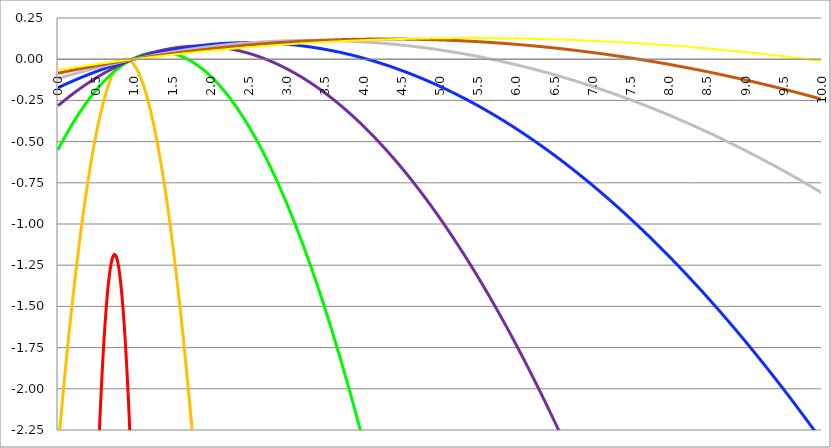
| Category | Series 1 | Series 0 | Series 3 | Series 4 | Series 5 | Series 2 | Series 6 | Series 7 |
|---|---|---|---|---|---|---|---|---|
| 0.0 | -16 | -2.37 | -0.549 | -0.282 | -0.173 | -0.117 | -0.085 | -0.064 |
| 0.005 | -15.801 | -2.344 | -0.544 | -0.28 | -0.172 | -0.117 | -0.085 | -0.064 |
| 0.01 | -15.603 | -2.317 | -0.54 | -0.278 | -0.171 | -0.116 | -0.084 | -0.064 |
| 0.015 | -15.406 | -2.291 | -0.535 | -0.276 | -0.17 | -0.115 | -0.084 | -0.063 |
| 0.02 | -15.211 | -2.265 | -0.531 | -0.274 | -0.169 | -0.115 | -0.083 | -0.063 |
| 0.025 | -15.017 | -2.239 | -0.527 | -0.273 | -0.168 | -0.114 | -0.083 | -0.063 |
| 0.03 | -14.824 | -2.213 | -0.522 | -0.271 | -0.167 | -0.113 | -0.082 | -0.062 |
| 0.035 | -14.633 | -2.187 | -0.518 | -0.269 | -0.165 | -0.113 | -0.082 | -0.062 |
| 0.04 | -14.443 | -2.162 | -0.514 | -0.267 | -0.164 | -0.112 | -0.081 | -0.062 |
| 0.045 | -14.255 | -2.136 | -0.509 | -0.265 | -0.163 | -0.111 | -0.081 | -0.061 |
| 0.05 | -14.068 | -2.111 | -0.505 | -0.263 | -0.162 | -0.11 | -0.08 | -0.061 |
| 0.055 | -13.882 | -2.086 | -0.501 | -0.261 | -0.161 | -0.11 | -0.08 | -0.061 |
| 0.06 | -13.697 | -2.061 | -0.497 | -0.259 | -0.16 | -0.109 | -0.079 | -0.06 |
| 0.065 | -13.514 | -2.036 | -0.492 | -0.257 | -0.159 | -0.108 | -0.079 | -0.06 |
| 0.07 | -13.332 | -2.012 | -0.488 | -0.255 | -0.158 | -0.108 | -0.078 | -0.06 |
| 0.075 | -13.152 | -1.987 | -0.484 | -0.254 | -0.157 | -0.107 | -0.078 | -0.059 |
| 0.08 | -12.973 | -1.963 | -0.48 | -0.252 | -0.156 | -0.106 | -0.077 | -0.059 |
| 0.085 | -12.795 | -1.939 | -0.476 | -0.25 | -0.155 | -0.106 | -0.077 | -0.058 |
| 0.09 | -12.619 | -1.915 | -0.471 | -0.248 | -0.154 | -0.105 | -0.076 | -0.058 |
| 0.095 | -12.444 | -1.891 | -0.467 | -0.246 | -0.153 | -0.104 | -0.076 | -0.058 |
| 0.1 | -12.27 | -1.867 | -0.463 | -0.244 | -0.152 | -0.104 | -0.075 | -0.057 |
| 0.105 | -12.098 | -1.843 | -0.459 | -0.242 | -0.151 | -0.103 | -0.075 | -0.057 |
| 0.11 | -11.927 | -1.82 | -0.455 | -0.241 | -0.15 | -0.102 | -0.075 | -0.057 |
| 0.115 | -11.757 | -1.797 | -0.451 | -0.239 | -0.149 | -0.102 | -0.074 | -0.056 |
| 0.12 | -11.589 | -1.774 | -0.447 | -0.237 | -0.148 | -0.101 | -0.074 | -0.056 |
| 0.125 | -11.422 | -1.751 | -0.443 | -0.235 | -0.147 | -0.1 | -0.073 | -0.056 |
| 0.13 | -11.256 | -1.728 | -0.439 | -0.233 | -0.145 | -0.1 | -0.073 | -0.055 |
| 0.135 | -11.092 | -1.705 | -0.435 | -0.231 | -0.144 | -0.099 | -0.072 | -0.055 |
| 0.14 | -10.929 | -1.683 | -0.431 | -0.23 | -0.143 | -0.098 | -0.072 | -0.055 |
| 0.145 | -10.768 | -1.66 | -0.427 | -0.228 | -0.142 | -0.098 | -0.071 | -0.054 |
| 0.15 | -10.608 | -1.638 | -0.423 | -0.226 | -0.141 | -0.097 | -0.071 | -0.054 |
| 0.155 | -10.449 | -1.616 | -0.419 | -0.224 | -0.14 | -0.096 | -0.07 | -0.054 |
| 0.16 | -10.291 | -1.594 | -0.415 | -0.222 | -0.139 | -0.096 | -0.07 | -0.053 |
| 0.165 | -10.135 | -1.572 | -0.411 | -0.221 | -0.138 | -0.095 | -0.069 | -0.053 |
| 0.17 | -9.98 | -1.55 | -0.407 | -0.219 | -0.137 | -0.094 | -0.069 | -0.053 |
| 0.175 | -9.827 | -1.529 | -0.403 | -0.217 | -0.136 | -0.094 | -0.068 | -0.052 |
| 0.18 | -9.675 | -1.508 | -0.399 | -0.215 | -0.135 | -0.093 | -0.068 | -0.052 |
| 0.185 | -9.524 | -1.486 | -0.396 | -0.214 | -0.134 | -0.092 | -0.068 | -0.052 |
| 0.19 | -9.375 | -1.465 | -0.392 | -0.212 | -0.133 | -0.092 | -0.067 | -0.051 |
| 0.195 | -9.227 | -1.444 | -0.388 | -0.21 | -0.132 | -0.091 | -0.067 | -0.051 |
| 0.2 | -9.08 | -1.424 | -0.384 | -0.208 | -0.131 | -0.09 | -0.066 | -0.05 |
| 0.205 | -8.935 | -1.403 | -0.38 | -0.207 | -0.13 | -0.09 | -0.066 | -0.05 |
| 0.21 | -8.791 | -1.383 | -0.377 | -0.205 | -0.129 | -0.089 | -0.065 | -0.05 |
| 0.215 | -8.648 | -1.362 | -0.373 | -0.203 | -0.128 | -0.088 | -0.065 | -0.049 |
| 0.22 | -8.507 | -1.342 | -0.369 | -0.201 | -0.127 | -0.088 | -0.064 | -0.049 |
| 0.225 | -8.367 | -1.322 | -0.366 | -0.2 | -0.126 | -0.087 | -0.064 | -0.049 |
| 0.23 | -8.228 | -1.302 | -0.362 | -0.198 | -0.125 | -0.087 | -0.063 | -0.048 |
| 0.235 | -8.091 | -1.283 | -0.358 | -0.196 | -0.124 | -0.086 | -0.063 | -0.048 |
| 0.24 | -7.955 | -1.263 | -0.355 | -0.195 | -0.123 | -0.085 | -0.062 | -0.048 |
| 0.245 | -7.821 | -1.244 | -0.351 | -0.193 | -0.122 | -0.085 | -0.062 | -0.047 |
| 0.25 | -7.687 | -1.225 | -0.347 | -0.191 | -0.121 | -0.084 | -0.062 | -0.047 |
| 0.255 | -7.556 | -1.205 | -0.344 | -0.189 | -0.12 | -0.083 | -0.061 | -0.047 |
| 0.26 | -7.425 | -1.187 | -0.34 | -0.188 | -0.119 | -0.083 | -0.061 | -0.046 |
| 0.265 | -7.296 | -1.168 | -0.337 | -0.186 | -0.118 | -0.082 | -0.06 | -0.046 |
| 0.27 | -7.168 | -1.149 | -0.333 | -0.184 | -0.117 | -0.081 | -0.06 | -0.046 |
| 0.275 | -7.042 | -1.131 | -0.329 | -0.183 | -0.116 | -0.081 | -0.059 | -0.045 |
| 0.28 | -6.917 | -1.112 | -0.326 | -0.181 | -0.116 | -0.08 | -0.059 | -0.045 |
| 0.285 | -6.793 | -1.094 | -0.322 | -0.179 | -0.115 | -0.079 | -0.058 | -0.045 |
| 0.29 | -6.671 | -1.076 | -0.319 | -0.178 | -0.114 | -0.079 | -0.058 | -0.044 |
| 0.295 | -6.55 | -1.058 | -0.315 | -0.176 | -0.113 | -0.078 | -0.057 | -0.044 |
| 0.3 | -6.43 | -1.04 | -0.312 | -0.175 | -0.112 | -0.078 | -0.057 | -0.044 |
| 0.305 | -6.312 | -1.023 | -0.309 | -0.173 | -0.111 | -0.077 | -0.057 | -0.043 |
| 0.31 | -6.195 | -1.005 | -0.305 | -0.171 | -0.11 | -0.076 | -0.056 | -0.043 |
| 0.315 | -6.079 | -0.988 | -0.302 | -0.17 | -0.109 | -0.076 | -0.056 | -0.043 |
| 0.32 | -5.965 | -0.971 | -0.298 | -0.168 | -0.108 | -0.075 | -0.055 | -0.042 |
| 0.325 | -5.852 | -0.954 | -0.295 | -0.166 | -0.107 | -0.074 | -0.055 | -0.042 |
| 0.33 | -5.74 | -0.937 | -0.292 | -0.165 | -0.106 | -0.074 | -0.054 | -0.042 |
| 0.335 | -5.63 | -0.92 | -0.288 | -0.163 | -0.105 | -0.073 | -0.054 | -0.041 |
| 0.34 | -5.521 | -0.904 | -0.285 | -0.162 | -0.104 | -0.073 | -0.053 | -0.041 |
| 0.345 | -5.414 | -0.887 | -0.282 | -0.16 | -0.103 | -0.072 | -0.053 | -0.041 |
| 0.35 | -5.307 | -0.871 | -0.278 | -0.158 | -0.102 | -0.071 | -0.053 | -0.04 |
| 0.355 | -5.203 | -0.855 | -0.275 | -0.157 | -0.101 | -0.071 | -0.052 | -0.04 |
| 0.36 | -5.099 | -0.839 | -0.272 | -0.155 | -0.1 | -0.07 | -0.052 | -0.04 |
| 0.365 | -4.997 | -0.823 | -0.269 | -0.154 | -0.099 | -0.069 | -0.051 | -0.039 |
| 0.37 | -4.896 | -0.808 | -0.265 | -0.152 | -0.098 | -0.069 | -0.051 | -0.039 |
| 0.375 | -4.797 | -0.792 | -0.262 | -0.151 | -0.098 | -0.068 | -0.05 | -0.039 |
| 0.38 | -4.699 | -0.777 | -0.259 | -0.149 | -0.097 | -0.068 | -0.05 | -0.038 |
| 0.385 | -4.602 | -0.762 | -0.256 | -0.147 | -0.096 | -0.067 | -0.049 | -0.038 |
| 0.39 | -4.507 | -0.747 | -0.253 | -0.146 | -0.095 | -0.066 | -0.049 | -0.038 |
| 0.395 | -4.413 | -0.732 | -0.25 | -0.144 | -0.094 | -0.066 | -0.049 | -0.037 |
| 0.4 | -4.32 | -0.717 | -0.246 | -0.143 | -0.093 | -0.065 | -0.048 | -0.037 |
| 0.405 | -4.229 | -0.702 | -0.243 | -0.141 | -0.092 | -0.065 | -0.048 | -0.037 |
| 0.41 | -4.139 | -0.688 | -0.24 | -0.14 | -0.091 | -0.064 | -0.047 | -0.036 |
| 0.415 | -4.05 | -0.674 | -0.237 | -0.138 | -0.09 | -0.063 | -0.047 | -0.036 |
| 0.42 | -3.963 | -0.66 | -0.234 | -0.137 | -0.089 | -0.063 | -0.046 | -0.036 |
| 0.425 | -3.877 | -0.646 | -0.231 | -0.135 | -0.088 | -0.062 | -0.046 | -0.035 |
| 0.43 | -3.792 | -0.632 | -0.228 | -0.134 | -0.087 | -0.061 | -0.046 | -0.035 |
| 0.435 | -3.709 | -0.618 | -0.225 | -0.132 | -0.087 | -0.061 | -0.045 | -0.035 |
| 0.44 | -3.627 | -0.605 | -0.222 | -0.131 | -0.086 | -0.06 | -0.045 | -0.034 |
| 0.445 | -3.547 | -0.591 | -0.219 | -0.129 | -0.085 | -0.06 | -0.044 | -0.034 |
| 0.45 | -3.467 | -0.578 | -0.216 | -0.128 | -0.084 | -0.059 | -0.044 | -0.034 |
| 0.455 | -3.39 | -0.565 | -0.213 | -0.126 | -0.083 | -0.058 | -0.043 | -0.033 |
| 0.46 | -3.313 | -0.552 | -0.21 | -0.125 | -0.082 | -0.058 | -0.043 | -0.033 |
| 0.465 | -3.238 | -0.539 | -0.207 | -0.123 | -0.081 | -0.057 | -0.042 | -0.033 |
| 0.47 | -3.164 | -0.526 | -0.205 | -0.122 | -0.08 | -0.057 | -0.042 | -0.032 |
| 0.475 | -3.092 | -0.514 | -0.202 | -0.12 | -0.079 | -0.056 | -0.042 | -0.032 |
| 0.48 | -3.021 | -0.502 | -0.199 | -0.119 | -0.079 | -0.056 | -0.041 | -0.032 |
| 0.485 | -2.951 | -0.489 | -0.196 | -0.118 | -0.078 | -0.055 | -0.041 | -0.031 |
| 0.49 | -2.883 | -0.477 | -0.193 | -0.116 | -0.077 | -0.054 | -0.04 | -0.031 |
| 0.495 | -2.816 | -0.465 | -0.19 | -0.115 | -0.076 | -0.054 | -0.04 | -0.031 |
| 0.5 | -2.75 | -0.454 | -0.188 | -0.113 | -0.075 | -0.053 | -0.039 | -0.03 |
| 0.505 | -2.686 | -0.442 | -0.185 | -0.112 | -0.074 | -0.053 | -0.039 | -0.03 |
| 0.51 | -2.623 | -0.431 | -0.182 | -0.11 | -0.073 | -0.052 | -0.039 | -0.03 |
| 0.515 | -2.561 | -0.419 | -0.179 | -0.109 | -0.072 | -0.051 | -0.038 | -0.03 |
| 0.52 | -2.501 | -0.408 | -0.177 | -0.108 | -0.072 | -0.051 | -0.038 | -0.029 |
| 0.525 | -2.442 | -0.397 | -0.174 | -0.106 | -0.071 | -0.05 | -0.037 | -0.029 |
| 0.53 | -2.384 | -0.386 | -0.171 | -0.105 | -0.07 | -0.05 | -0.037 | -0.029 |
| 0.535 | -2.328 | -0.376 | -0.169 | -0.103 | -0.069 | -0.049 | -0.037 | -0.028 |
| 0.54 | -2.273 | -0.365 | -0.166 | -0.102 | -0.068 | -0.048 | -0.036 | -0.028 |
| 0.545 | -2.22 | -0.355 | -0.163 | -0.101 | -0.067 | -0.048 | -0.036 | -0.028 |
| 0.55 | -2.167 | -0.345 | -0.161 | -0.099 | -0.066 | -0.047 | -0.035 | -0.027 |
| 0.555 | -2.117 | -0.334 | -0.158 | -0.098 | -0.066 | -0.047 | -0.035 | -0.027 |
| 0.56 | -2.067 | -0.325 | -0.155 | -0.097 | -0.065 | -0.046 | -0.034 | -0.027 |
| 0.565 | -2.019 | -0.315 | -0.153 | -0.095 | -0.064 | -0.046 | -0.034 | -0.026 |
| 0.57 | -1.972 | -0.305 | -0.15 | -0.094 | -0.063 | -0.045 | -0.034 | -0.026 |
| 0.575 | -1.927 | -0.296 | -0.148 | -0.092 | -0.062 | -0.044 | -0.033 | -0.026 |
| 0.58 | -1.883 | -0.286 | -0.145 | -0.091 | -0.061 | -0.044 | -0.033 | -0.025 |
| 0.585 | -1.84 | -0.277 | -0.143 | -0.09 | -0.061 | -0.043 | -0.032 | -0.025 |
| 0.59 | -1.799 | -0.268 | -0.14 | -0.088 | -0.06 | -0.043 | -0.032 | -0.025 |
| 0.595 | -1.759 | -0.259 | -0.138 | -0.087 | -0.059 | -0.042 | -0.031 | -0.024 |
| 0.6 | -1.72 | -0.25 | -0.135 | -0.086 | -0.058 | -0.042 | -0.031 | -0.024 |
| 0.605 | -1.683 | -0.242 | -0.133 | -0.085 | -0.057 | -0.041 | -0.031 | -0.024 |
| 0.61 | -1.647 | -0.233 | -0.131 | -0.083 | -0.056 | -0.04 | -0.03 | -0.023 |
| 0.615 | -1.612 | -0.225 | -0.128 | -0.082 | -0.056 | -0.04 | -0.03 | -0.023 |
| 0.62 | -1.579 | -0.217 | -0.126 | -0.081 | -0.055 | -0.039 | -0.029 | -0.023 |
| 0.625 | -1.547 | -0.209 | -0.123 | -0.079 | -0.054 | -0.039 | -0.029 | -0.022 |
| 0.63 | -1.516 | -0.201 | -0.121 | -0.078 | -0.053 | -0.038 | -0.029 | -0.022 |
| 0.635 | -1.487 | -0.193 | -0.119 | -0.077 | -0.052 | -0.038 | -0.028 | -0.022 |
| 0.64 | -1.459 | -0.186 | -0.116 | -0.075 | -0.051 | -0.037 | -0.028 | -0.022 |
| 0.645 | -1.433 | -0.178 | -0.114 | -0.074 | -0.051 | -0.036 | -0.027 | -0.021 |
| 0.65 | -1.407 | -0.171 | -0.112 | -0.073 | -0.05 | -0.036 | -0.027 | -0.021 |
| 0.655 | -1.384 | -0.164 | -0.109 | -0.072 | -0.049 | -0.035 | -0.027 | -0.021 |
| 0.66 | -1.361 | -0.157 | -0.107 | -0.07 | -0.048 | -0.035 | -0.026 | -0.02 |
| 0.665 | -1.34 | -0.15 | -0.105 | -0.069 | -0.047 | -0.034 | -0.026 | -0.02 |
| 0.67 | -1.32 | -0.144 | -0.103 | -0.068 | -0.047 | -0.034 | -0.025 | -0.02 |
| 0.675 | -1.302 | -0.137 | -0.101 | -0.067 | -0.046 | -0.033 | -0.025 | -0.019 |
| 0.68 | -1.285 | -0.131 | -0.098 | -0.065 | -0.045 | -0.033 | -0.024 | -0.019 |
| 0.685 | -1.269 | -0.125 | -0.096 | -0.064 | -0.044 | -0.032 | -0.024 | -0.019 |
| 0.69 | -1.255 | -0.119 | -0.094 | -0.063 | -0.043 | -0.031 | -0.024 | -0.018 |
| 0.695 | -1.242 | -0.113 | -0.092 | -0.062 | -0.043 | -0.031 | -0.023 | -0.018 |
| 0.7 | -1.23 | -0.107 | -0.09 | -0.06 | -0.042 | -0.03 | -0.023 | -0.018 |
| 0.705 | -1.22 | -0.101 | -0.088 | -0.059 | -0.041 | -0.03 | -0.022 | -0.017 |
| 0.71 | -1.211 | -0.096 | -0.086 | -0.058 | -0.04 | -0.029 | -0.022 | -0.017 |
| 0.715 | -1.203 | -0.091 | -0.084 | -0.057 | -0.04 | -0.029 | -0.022 | -0.017 |
| 0.72 | -1.197 | -0.086 | -0.081 | -0.056 | -0.039 | -0.028 | -0.021 | -0.017 |
| 0.725 | -1.192 | -0.081 | -0.079 | -0.054 | -0.038 | -0.028 | -0.021 | -0.016 |
| 0.73 | -1.188 | -0.076 | -0.077 | -0.053 | -0.037 | -0.027 | -0.02 | -0.016 |
| 0.735 | -1.186 | -0.071 | -0.075 | -0.052 | -0.036 | -0.027 | -0.02 | -0.016 |
| 0.74 | -1.185 | -0.067 | -0.073 | -0.051 | -0.036 | -0.026 | -0.02 | -0.015 |
| 0.745 | -1.186 | -0.062 | -0.071 | -0.05 | -0.035 | -0.025 | -0.019 | -0.015 |
| 0.75 | -1.188 | -0.058 | -0.07 | -0.049 | -0.034 | -0.025 | -0.019 | -0.015 |
| 0.755 | -1.191 | -0.054 | -0.068 | -0.047 | -0.033 | -0.024 | -0.018 | -0.014 |
| 0.76 | -1.195 | -0.05 | -0.066 | -0.046 | -0.033 | -0.024 | -0.018 | -0.014 |
| 0.765 | -1.201 | -0.046 | -0.064 | -0.045 | -0.032 | -0.023 | -0.018 | -0.014 |
| 0.77 | -1.208 | -0.042 | -0.062 | -0.044 | -0.031 | -0.023 | -0.017 | -0.013 |
| 0.775000000000001 | -1.217 | -0.039 | -0.06 | -0.043 | -0.03 | -0.022 | -0.017 | -0.013 |
| 0.78 | -1.227 | -0.036 | -0.058 | -0.042 | -0.03 | -0.022 | -0.016 | -0.013 |
| 0.785000000000001 | -1.238 | -0.032 | -0.056 | -0.041 | -0.029 | -0.021 | -0.016 | -0.013 |
| 0.79 | -1.251 | -0.029 | -0.055 | -0.039 | -0.028 | -0.021 | -0.016 | -0.012 |
| 0.795000000000001 | -1.265 | -0.026 | -0.053 | -0.038 | -0.027 | -0.02 | -0.015 | -0.012 |
| 0.800000000000001 | -1.28 | -0.024 | -0.051 | -0.037 | -0.027 | -0.02 | -0.015 | -0.012 |
| 0.805000000000001 | -1.297 | -0.021 | -0.049 | -0.036 | -0.026 | -0.019 | -0.015 | -0.011 |
| 0.810000000000001 | -1.315 | -0.019 | -0.047 | -0.035 | -0.025 | -0.019 | -0.014 | -0.011 |
| 0.815000000000001 | -1.334 | -0.016 | -0.046 | -0.034 | -0.024 | -0.018 | -0.014 | -0.011 |
| 0.820000000000001 | -1.355 | -0.014 | -0.044 | -0.033 | -0.024 | -0.017 | -0.013 | -0.01 |
| 0.825000000000001 | -1.377 | -0.012 | -0.042 | -0.032 | -0.023 | -0.017 | -0.013 | -0.01 |
| 0.830000000000001 | -1.4 | -0.01 | -0.041 | -0.031 | -0.022 | -0.016 | -0.013 | -0.01 |
| 0.835000000000001 | -1.425 | -0.009 | -0.039 | -0.03 | -0.021 | -0.016 | -0.012 | -0.01 |
| 0.840000000000001 | -1.451 | -0.007 | -0.037 | -0.029 | -0.021 | -0.015 | -0.012 | -0.009 |
| 0.845000000000001 | -1.479 | -0.006 | -0.036 | -0.027 | -0.02 | -0.015 | -0.011 | -0.009 |
| 0.850000000000001 | -1.508 | -0.005 | -0.034 | -0.026 | -0.019 | -0.014 | -0.011 | -0.009 |
| 0.855000000000001 | -1.538 | -0.003 | -0.032 | -0.025 | -0.019 | -0.014 | -0.011 | -0.008 |
| 0.860000000000001 | -1.569 | -0.003 | -0.031 | -0.024 | -0.018 | -0.013 | -0.01 | -0.008 |
| 0.865000000000001 | -1.602 | -0.002 | -0.029 | -0.023 | -0.017 | -0.013 | -0.01 | -0.008 |
| 0.870000000000001 | -1.636 | -0.001 | -0.028 | -0.022 | -0.016 | -0.012 | -0.009 | -0.007 |
| 0.875000000000001 | -1.672 | -0.001 | -0.026 | -0.021 | -0.016 | -0.012 | -0.009 | -0.007 |
| 0.880000000000001 | -1.709 | 0 | -0.025 | -0.02 | -0.015 | -0.011 | -0.009 | -0.007 |
| 0.885000000000001 | -1.747 | 0 | -0.023 | -0.019 | -0.014 | -0.011 | -0.008 | -0.007 |
| 0.890000000000001 | -1.787 | 0 | -0.022 | -0.018 | -0.014 | -0.01 | -0.008 | -0.006 |
| 0.895000000000001 | -1.828 | 0 | -0.02 | -0.017 | -0.013 | -0.01 | -0.008 | -0.006 |
| 0.900000000000001 | -1.87 | 0 | -0.019 | -0.016 | -0.012 | -0.009 | -0.007 | -0.006 |
| 0.905000000000001 | -1.914 | -0.001 | -0.017 | -0.015 | -0.012 | -0.009 | -0.007 | -0.005 |
| 0.910000000000001 | -1.959 | -0.001 | -0.016 | -0.014 | -0.011 | -0.008 | -0.006 | -0.005 |
| 0.915000000000001 | -2.005 | -0.002 | -0.014 | -0.013 | -0.01 | -0.008 | -0.006 | -0.005 |
| 0.920000000000001 | -2.053 | -0.003 | -0.013 | -0.012 | -0.009 | -0.007 | -0.006 | -0.004 |
| 0.925000000000001 | -2.102 | -0.004 | -0.012 | -0.011 | -0.009 | -0.007 | -0.005 | -0.004 |
| 0.930000000000001 | -2.152 | -0.005 | -0.01 | -0.01 | -0.008 | -0.006 | -0.005 | -0.004 |
| 0.935000000000001 | -2.204 | -0.006 | -0.009 | -0.009 | -0.007 | -0.006 | -0.004 | -0.004 |
| 0.940000000000001 | -2.257 | -0.008 | -0.008 | -0.008 | -0.007 | -0.005 | -0.004 | -0.003 |
| 0.945000000000001 | -2.312 | -0.009 | -0.006 | -0.007 | -0.006 | -0.005 | -0.004 | -0.003 |
| 0.950000000000001 | -2.368 | -0.011 | -0.005 | -0.006 | -0.005 | -0.004 | -0.003 | -0.003 |
| 0.955000000000001 | -2.425 | -0.013 | -0.004 | -0.005 | -0.005 | -0.004 | -0.003 | -0.002 |
| 0.960000000000001 | -2.483 | -0.015 | -0.003 | -0.004 | -0.004 | -0.003 | -0.003 | -0.002 |
| 0.965000000000001 | -2.543 | -0.017 | -0.001 | -0.003 | -0.003 | -0.003 | -0.002 | -0.002 |
| 0.970000000000001 | -2.604 | -0.02 | 0 | -0.003 | -0.003 | -0.002 | -0.002 | -0.002 |
| 0.975000000000001 | -2.667 | -0.022 | 0.001 | -0.002 | -0.002 | -0.002 | -0.001 | -0.001 |
| 0.980000000000001 | -2.731 | -0.025 | 0.002 | -0.001 | -0.001 | -0.001 | -0.001 | -0.001 |
| 0.985000000000001 | -2.796 | -0.028 | 0.003 | 0 | -0.001 | -0.001 | -0.001 | -0.001 |
| 0.990000000000001 | -2.863 | -0.031 | 0.005 | 0.001 | 0 | 0 | 0 | 0 |
| 0.995000000000001 | -2.931 | -0.034 | 0.006 | 0.002 | 0.001 | 0 | 0 | 0 |
| 1.000000000000001 | -3 | -0.037 | 0.007 | 0.003 | 0.001 | 0.001 | 0 | 0 |
| 1.005000000000001 | -3.071 | -0.04 | 0.008 | 0.004 | 0.002 | 0.001 | 0.001 | 0.001 |
| 1.01 | -3.143 | -0.044 | 0.009 | 0.005 | 0.003 | 0.002 | 0.001 | 0.001 |
| 1.015 | -3.216 | -0.048 | 0.01 | 0.006 | 0.003 | 0.002 | 0.001 | 0.001 |
| 1.02 | -3.291 | -0.052 | 0.011 | 0.006 | 0.004 | 0.003 | 0.002 | 0.001 |
| 1.025 | -3.367 | -0.056 | 0.012 | 0.007 | 0.005 | 0.003 | 0.002 | 0.002 |
| 1.03 | -3.444 | -0.06 | 0.013 | 0.008 | 0.005 | 0.004 | 0.003 | 0.002 |
| 1.035 | -3.523 | -0.064 | 0.014 | 0.009 | 0.006 | 0.004 | 0.003 | 0.002 |
| 1.04 | -3.603 | -0.069 | 0.015 | 0.01 | 0.007 | 0.005 | 0.003 | 0.003 |
| 1.045 | -3.685 | -0.073 | 0.016 | 0.011 | 0.007 | 0.005 | 0.004 | 0.003 |
| 1.05 | -3.767 | -0.078 | 0.017 | 0.012 | 0.008 | 0.005 | 0.004 | 0.003 |
| 1.054999999999999 | -3.852 | -0.083 | 0.018 | 0.012 | 0.008 | 0.006 | 0.004 | 0.003 |
| 1.059999999999999 | -3.937 | -0.088 | 0.019 | 0.013 | 0.009 | 0.006 | 0.005 | 0.004 |
| 1.064999999999999 | -4.024 | -0.093 | 0.02 | 0.014 | 0.01 | 0.007 | 0.005 | 0.004 |
| 1.069999999999999 | -4.112 | -0.098 | 0.021 | 0.015 | 0.01 | 0.007 | 0.006 | 0.004 |
| 1.074999999999999 | -4.202 | -0.104 | 0.022 | 0.016 | 0.011 | 0.008 | 0.006 | 0.005 |
| 1.079999999999999 | -4.293 | -0.11 | 0.023 | 0.017 | 0.012 | 0.008 | 0.006 | 0.005 |
| 1.084999999999999 | -4.385 | -0.115 | 0.023 | 0.017 | 0.012 | 0.009 | 0.007 | 0.005 |
| 1.089999999999999 | -4.479 | -0.121 | 0.024 | 0.018 | 0.013 | 0.009 | 0.007 | 0.005 |
| 1.094999999999999 | -4.574 | -0.127 | 0.025 | 0.019 | 0.013 | 0.01 | 0.007 | 0.006 |
| 1.099999999999999 | -4.67 | -0.134 | 0.026 | 0.02 | 0.014 | 0.01 | 0.008 | 0.006 |
| 1.104999999999998 | -4.768 | -0.14 | 0.027 | 0.021 | 0.015 | 0.011 | 0.008 | 0.006 |
| 1.109999999999998 | -4.867 | -0.147 | 0.027 | 0.021 | 0.015 | 0.011 | 0.008 | 0.007 |
| 1.114999999999998 | -4.967 | -0.153 | 0.028 | 0.022 | 0.016 | 0.012 | 0.009 | 0.007 |
| 1.119999999999998 | -5.069 | -0.16 | 0.029 | 0.023 | 0.016 | 0.012 | 0.009 | 0.007 |
| 1.124999999999998 | -5.172 | -0.167 | 0.029 | 0.024 | 0.017 | 0.013 | 0.009 | 0.007 |
| 1.129999999999998 | -5.276 | -0.174 | 0.03 | 0.025 | 0.018 | 0.013 | 0.01 | 0.008 |
| 1.134999999999998 | -5.382 | -0.182 | 0.031 | 0.025 | 0.018 | 0.013 | 0.01 | 0.008 |
| 1.139999999999998 | -5.489 | -0.189 | 0.031 | 0.026 | 0.019 | 0.014 | 0.011 | 0.008 |
| 1.144999999999998 | -5.598 | -0.197 | 0.032 | 0.027 | 0.019 | 0.014 | 0.011 | 0.009 |
| 1.149999999999997 | -5.707 | -0.205 | 0.033 | 0.028 | 0.02 | 0.015 | 0.011 | 0.009 |
| 1.154999999999997 | -5.819 | -0.212 | 0.033 | 0.028 | 0.021 | 0.015 | 0.012 | 0.009 |
| 1.159999999999997 | -5.931 | -0.221 | 0.034 | 0.029 | 0.021 | 0.016 | 0.012 | 0.009 |
| 1.164999999999997 | -6.045 | -0.229 | 0.034 | 0.03 | 0.022 | 0.016 | 0.012 | 0.01 |
| 1.169999999999997 | -6.16 | -0.237 | 0.035 | 0.03 | 0.022 | 0.017 | 0.013 | 0.01 |
| 1.174999999999997 | -6.277 | -0.246 | 0.036 | 0.031 | 0.023 | 0.017 | 0.013 | 0.01 |
| 1.179999999999997 | -6.395 | -0.254 | 0.036 | 0.032 | 0.024 | 0.018 | 0.013 | 0.01 |
| 1.184999999999997 | -6.514 | -0.263 | 0.037 | 0.033 | 0.024 | 0.018 | 0.014 | 0.011 |
| 1.189999999999997 | -6.635 | -0.272 | 0.037 | 0.033 | 0.025 | 0.018 | 0.014 | 0.011 |
| 1.194999999999996 | -6.757 | -0.281 | 0.038 | 0.034 | 0.025 | 0.019 | 0.014 | 0.011 |
| 1.199999999999996 | -6.88 | -0.29 | 0.038 | 0.035 | 0.026 | 0.019 | 0.015 | 0.012 |
| 1.204999999999996 | -7.005 | -0.3 | 0.038 | 0.035 | 0.026 | 0.02 | 0.015 | 0.012 |
| 1.209999999999996 | -7.131 | -0.309 | 0.039 | 0.036 | 0.027 | 0.02 | 0.015 | 0.012 |
| 1.214999999999996 | -7.258 | -0.319 | 0.039 | 0.037 | 0.028 | 0.021 | 0.016 | 0.012 |
| 1.219999999999996 | -7.387 | -0.329 | 0.04 | 0.037 | 0.028 | 0.021 | 0.016 | 0.013 |
| 1.224999999999996 | -7.517 | -0.339 | 0.04 | 0.038 | 0.029 | 0.022 | 0.016 | 0.013 |
| 1.229999999999996 | -7.648 | -0.349 | 0.04 | 0.039 | 0.029 | 0.022 | 0.017 | 0.013 |
| 1.234999999999996 | -7.781 | -0.359 | 0.041 | 0.039 | 0.03 | 0.022 | 0.017 | 0.014 |
| 1.239999999999996 | -7.915 | -0.37 | 0.041 | 0.04 | 0.03 | 0.023 | 0.018 | 0.014 |
| 1.244999999999995 | -8.051 | -0.38 | 0.041 | 0.041 | 0.031 | 0.023 | 0.018 | 0.014 |
| 1.249999999999995 | -8.187 | -0.391 | 0.042 | 0.041 | 0.031 | 0.024 | 0.018 | 0.014 |
| 1.254999999999995 | -8.326 | -0.402 | 0.042 | 0.042 | 0.032 | 0.024 | 0.019 | 0.015 |
| 1.259999999999995 | -8.465 | -0.413 | 0.042 | 0.043 | 0.033 | 0.025 | 0.019 | 0.015 |
| 1.264999999999995 | -8.606 | -0.424 | 0.042 | 0.043 | 0.033 | 0.025 | 0.019 | 0.015 |
| 1.269999999999995 | -8.748 | -0.436 | 0.043 | 0.044 | 0.034 | 0.025 | 0.02 | 0.015 |
| 1.274999999999995 | -8.892 | -0.447 | 0.043 | 0.044 | 0.034 | 0.026 | 0.02 | 0.016 |
| 1.279999999999995 | -9.037 | -0.459 | 0.043 | 0.045 | 0.035 | 0.026 | 0.02 | 0.016 |
| 1.284999999999995 | -9.183 | -0.471 | 0.043 | 0.046 | 0.035 | 0.027 | 0.021 | 0.016 |
| 1.289999999999994 | -9.331 | -0.483 | 0.043 | 0.046 | 0.036 | 0.027 | 0.021 | 0.017 |
| 1.294999999999994 | -9.48 | -0.495 | 0.043 | 0.047 | 0.036 | 0.028 | 0.021 | 0.017 |
| 1.299999999999994 | -9.63 | -0.507 | 0.044 | 0.047 | 0.037 | 0.028 | 0.022 | 0.017 |
| 1.304999999999994 | -9.782 | -0.519 | 0.044 | 0.048 | 0.037 | 0.028 | 0.022 | 0.017 |
| 1.309999999999994 | -9.935 | -0.532 | 0.044 | 0.048 | 0.038 | 0.029 | 0.022 | 0.018 |
| 1.314999999999994 | -10.089 | -0.545 | 0.044 | 0.049 | 0.038 | 0.029 | 0.023 | 0.018 |
| 1.319999999999994 | -10.245 | -0.558 | 0.044 | 0.05 | 0.039 | 0.03 | 0.023 | 0.018 |
| 1.324999999999994 | -10.402 | -0.571 | 0.044 | 0.05 | 0.039 | 0.03 | 0.023 | 0.018 |
| 1.329999999999994 | -10.56 | -0.584 | 0.044 | 0.051 | 0.04 | 0.031 | 0.024 | 0.019 |
| 1.334999999999993 | -10.72 | -0.597 | 0.044 | 0.051 | 0.04 | 0.031 | 0.024 | 0.019 |
| 1.339999999999993 | -10.881 | -0.611 | 0.044 | 0.052 | 0.041 | 0.031 | 0.024 | 0.019 |
| 1.344999999999993 | -11.044 | -0.624 | 0.044 | 0.052 | 0.041 | 0.032 | 0.025 | 0.019 |
| 1.349999999999993 | -11.207 | -0.638 | 0.044 | 0.053 | 0.042 | 0.032 | 0.025 | 0.02 |
| 1.354999999999993 | -11.373 | -0.652 | 0.044 | 0.053 | 0.042 | 0.033 | 0.025 | 0.02 |
| 1.359999999999993 | -11.539 | -0.666 | 0.044 | 0.054 | 0.043 | 0.033 | 0.026 | 0.02 |
| 1.364999999999993 | -11.707 | -0.68 | 0.044 | 0.054 | 0.043 | 0.033 | 0.026 | 0.021 |
| 1.369999999999993 | -11.876 | -0.694 | 0.043 | 0.055 | 0.044 | 0.034 | 0.026 | 0.021 |
| 1.374999999999993 | -12.047 | -0.709 | 0.043 | 0.055 | 0.044 | 0.034 | 0.027 | 0.021 |
| 1.379999999999993 | -12.219 | -0.724 | 0.043 | 0.056 | 0.045 | 0.035 | 0.027 | 0.021 |
| 1.384999999999992 | -12.392 | -0.738 | 0.043 | 0.056 | 0.045 | 0.035 | 0.027 | 0.022 |
| 1.389999999999992 | -12.567 | -0.753 | 0.043 | 0.057 | 0.046 | 0.035 | 0.028 | 0.022 |
| 1.394999999999992 | -12.743 | -0.768 | 0.043 | 0.057 | 0.046 | 0.036 | 0.028 | 0.022 |
| 1.399999999999992 | -12.92 | -0.784 | 0.042 | 0.058 | 0.047 | 0.036 | 0.028 | 0.022 |
| 1.404999999999992 | -13.099 | -0.799 | 0.042 | 0.058 | 0.047 | 0.037 | 0.029 | 0.023 |
| 1.409999999999992 | -13.279 | -0.815 | 0.042 | 0.059 | 0.048 | 0.037 | 0.029 | 0.023 |
| 1.414999999999992 | -13.46 | -0.83 | 0.042 | 0.059 | 0.048 | 0.037 | 0.029 | 0.023 |
| 1.419999999999992 | -13.643 | -0.846 | 0.041 | 0.06 | 0.049 | 0.038 | 0.03 | 0.023 |
| 1.424999999999992 | -13.827 | -0.862 | 0.041 | 0.06 | 0.049 | 0.038 | 0.03 | 0.024 |
| 1.429999999999991 | -14.012 | -0.878 | 0.041 | 0.061 | 0.05 | 0.039 | 0.03 | 0.024 |
| 1.434999999999991 | -14.199 | -0.895 | 0.04 | 0.061 | 0.05 | 0.039 | 0.031 | 0.024 |
| 1.439999999999991 | -14.387 | -0.911 | 0.04 | 0.062 | 0.051 | 0.039 | 0.031 | 0.025 |
| 1.444999999999991 | -14.577 | -0.928 | 0.04 | 0.062 | 0.051 | 0.04 | 0.031 | 0.025 |
| 1.449999999999991 | -14.767 | -0.945 | 0.039 | 0.062 | 0.052 | 0.04 | 0.031 | 0.025 |
| 1.454999999999991 | -14.96 | -0.961 | 0.039 | 0.063 | 0.052 | 0.041 | 0.032 | 0.025 |
| 1.459999999999991 | -15.153 | -0.979 | 0.039 | 0.063 | 0.053 | 0.041 | 0.032 | 0.026 |
| 1.464999999999991 | -15.348 | -0.996 | 0.038 | 0.064 | 0.053 | 0.041 | 0.032 | 0.026 |
| 1.469999999999991 | -15.544 | -1.013 | 0.038 | 0.064 | 0.053 | 0.042 | 0.033 | 0.026 |
| 1.474999999999991 | -15.742 | -1.031 | 0.037 | 0.064 | 0.054 | 0.042 | 0.033 | 0.026 |
| 1.47999999999999 | -15.941 | -1.048 | 0.037 | 0.065 | 0.054 | 0.043 | 0.033 | 0.027 |
| 1.48499999999999 | -16.141 | -1.066 | 0.036 | 0.065 | 0.055 | 0.043 | 0.034 | 0.027 |
| 1.48999999999999 | -16.343 | -1.084 | 0.036 | 0.066 | 0.055 | 0.043 | 0.034 | 0.027 |
| 1.49499999999999 | -16.546 | -1.102 | 0.035 | 0.066 | 0.056 | 0.044 | 0.034 | 0.027 |
| 1.49999999999999 | -16.75 | -1.12 | 0.035 | 0.066 | 0.056 | 0.044 | 0.035 | 0.028 |
| 1.50499999999999 | -16.956 | -1.139 | 0.034 | 0.067 | 0.057 | 0.044 | 0.035 | 0.028 |
| 1.50999999999999 | -17.163 | -1.157 | 0.033 | 0.067 | 0.057 | 0.045 | 0.035 | 0.028 |
| 1.51499999999999 | -17.371 | -1.176 | 0.033 | 0.067 | 0.057 | 0.045 | 0.036 | 0.028 |
| 1.51999999999999 | -17.581 | -1.195 | 0.032 | 0.068 | 0.058 | 0.046 | 0.036 | 0.029 |
| 1.524999999999989 | -17.792 | -1.214 | 0.032 | 0.068 | 0.058 | 0.046 | 0.036 | 0.029 |
| 1.529999999999989 | -18.004 | -1.233 | 0.031 | 0.069 | 0.059 | 0.046 | 0.037 | 0.029 |
| 1.534999999999989 | -18.218 | -1.252 | 0.03 | 0.069 | 0.059 | 0.047 | 0.037 | 0.029 |
| 1.539999999999989 | -18.433 | -1.272 | 0.03 | 0.069 | 0.06 | 0.047 | 0.037 | 0.03 |
| 1.544999999999989 | -18.65 | -1.291 | 0.029 | 0.07 | 0.06 | 0.047 | 0.037 | 0.03 |
| 1.549999999999989 | -18.867 | -1.311 | 0.028 | 0.07 | 0.06 | 0.048 | 0.038 | 0.03 |
| 1.554999999999989 | -19.087 | -1.331 | 0.028 | 0.07 | 0.061 | 0.048 | 0.038 | 0.03 |
| 1.559999999999989 | -19.307 | -1.351 | 0.027 | 0.07 | 0.061 | 0.049 | 0.038 | 0.031 |
| 1.564999999999989 | -19.529 | -1.371 | 0.026 | 0.071 | 0.062 | 0.049 | 0.039 | 0.031 |
| 1.569999999999989 | -19.752 | -1.392 | 0.025 | 0.071 | 0.062 | 0.049 | 0.039 | 0.031 |
| 1.574999999999988 | -19.977 | -1.412 | 0.024 | 0.071 | 0.063 | 0.05 | 0.039 | 0.031 |
| 1.579999999999988 | -20.203 | -1.433 | 0.024 | 0.072 | 0.063 | 0.05 | 0.04 | 0.032 |
| 1.584999999999988 | -20.43 | -1.454 | 0.023 | 0.072 | 0.063 | 0.05 | 0.04 | 0.032 |
| 1.589999999999988 | -20.659 | -1.475 | 0.022 | 0.072 | 0.064 | 0.051 | 0.04 | 0.032 |
| 1.594999999999988 | -20.889 | -1.496 | 0.021 | 0.073 | 0.064 | 0.051 | 0.041 | 0.032 |
| 1.599999999999988 | -21.12 | -1.517 | 0.02 | 0.073 | 0.065 | 0.052 | 0.041 | 0.033 |
| 1.604999999999988 | -21.353 | -1.538 | 0.019 | 0.073 | 0.065 | 0.052 | 0.041 | 0.033 |
| 1.609999999999988 | -21.587 | -1.56 | 0.018 | 0.073 | 0.065 | 0.052 | 0.041 | 0.033 |
| 1.614999999999987 | -21.822 | -1.582 | 0.017 | 0.074 | 0.066 | 0.053 | 0.042 | 0.033 |
| 1.619999999999987 | -22.059 | -1.604 | 0.017 | 0.074 | 0.066 | 0.053 | 0.042 | 0.034 |
| 1.624999999999987 | -22.297 | -1.626 | 0.016 | 0.074 | 0.066 | 0.053 | 0.042 | 0.034 |
| 1.629999999999987 | -22.536 | -1.648 | 0.015 | 0.074 | 0.067 | 0.054 | 0.043 | 0.034 |
| 1.634999999999987 | -22.777 | -1.67 | 0.014 | 0.075 | 0.067 | 0.054 | 0.043 | 0.034 |
| 1.639999999999987 | -23.019 | -1.693 | 0.013 | 0.075 | 0.068 | 0.054 | 0.043 | 0.035 |
| 1.644999999999987 | -23.263 | -1.715 | 0.012 | 0.075 | 0.068 | 0.055 | 0.044 | 0.035 |
| 1.649999999999987 | -23.507 | -1.738 | 0.01 | 0.075 | 0.068 | 0.055 | 0.044 | 0.035 |
| 1.654999999999987 | -23.754 | -1.761 | 0.009 | 0.075 | 0.069 | 0.055 | 0.044 | 0.035 |
| 1.659999999999986 | -24.001 | -1.784 | 0.008 | 0.076 | 0.069 | 0.056 | 0.044 | 0.036 |
| 1.664999999999986 | -24.25 | -1.807 | 0.007 | 0.076 | 0.069 | 0.056 | 0.045 | 0.036 |
| 1.669999999999986 | -24.5 | -1.83 | 0.006 | 0.076 | 0.07 | 0.056 | 0.045 | 0.036 |
| 1.674999999999986 | -24.752 | -1.854 | 0.005 | 0.076 | 0.07 | 0.057 | 0.045 | 0.036 |
| 1.679999999999986 | -25.005 | -1.878 | 0.004 | 0.076 | 0.071 | 0.057 | 0.046 | 0.037 |
| 1.684999999999986 | -25.259 | -1.901 | 0.003 | 0.077 | 0.071 | 0.058 | 0.046 | 0.037 |
| 1.689999999999986 | -25.515 | -1.925 | 0.001 | 0.077 | 0.071 | 0.058 | 0.046 | 0.037 |
| 1.694999999999986 | -25.772 | -1.949 | 0 | 0.077 | 0.072 | 0.058 | 0.046 | 0.037 |
| 1.699999999999986 | -26.03 | -1.974 | -0.001 | 0.077 | 0.072 | 0.059 | 0.047 | 0.038 |
| 1.704999999999986 | -26.29 | -1.998 | -0.002 | 0.077 | 0.072 | 0.059 | 0.047 | 0.038 |
| 1.709999999999985 | -26.551 | -2.023 | -0.003 | 0.077 | 0.073 | 0.059 | 0.047 | 0.038 |
| 1.714999999999985 | -26.813 | -2.047 | -0.005 | 0.077 | 0.073 | 0.06 | 0.048 | 0.038 |
| 1.719999999999985 | -27.077 | -2.072 | -0.006 | 0.078 | 0.073 | 0.06 | 0.048 | 0.039 |
| 1.724999999999985 | -27.342 | -2.097 | -0.007 | 0.078 | 0.074 | 0.06 | 0.048 | 0.039 |
| 1.729999999999985 | -27.608 | -2.122 | -0.009 | 0.078 | 0.074 | 0.061 | 0.049 | 0.039 |
| 1.734999999999985 | -27.876 | -2.148 | -0.01 | 0.078 | 0.074 | 0.061 | 0.049 | 0.039 |
| 1.739999999999985 | -28.145 | -2.173 | -0.011 | 0.078 | 0.075 | 0.061 | 0.049 | 0.04 |
| 1.744999999999985 | -28.416 | -2.199 | -0.013 | 0.078 | 0.075 | 0.062 | 0.049 | 0.04 |
| 1.749999999999985 | -28.687 | -2.225 | -0.014 | 0.078 | 0.075 | 0.062 | 0.05 | 0.04 |
| 1.754999999999984 | -28.961 | -2.25 | -0.015 | 0.078 | 0.076 | 0.062 | 0.05 | 0.04 |
| 1.759999999999984 | -29.235 | -2.277 | -0.017 | 0.079 | 0.076 | 0.063 | 0.05 | 0.041 |
| 1.764999999999984 | -29.511 | -2.303 | -0.018 | 0.079 | 0.076 | 0.063 | 0.051 | 0.041 |
| 1.769999999999984 | -29.788 | -2.329 | -0.02 | 0.079 | 0.077 | 0.063 | 0.051 | 0.041 |
| 1.774999999999984 | -30.067 | -2.356 | -0.021 | 0.079 | 0.077 | 0.064 | 0.051 | 0.041 |
| 1.779999999999984 | -30.347 | -2.382 | -0.023 | 0.079 | 0.077 | 0.064 | 0.051 | 0.042 |
| 1.784999999999984 | -30.628 | -2.409 | -0.024 | 0.079 | 0.078 | 0.064 | 0.052 | 0.042 |
| 1.789999999999984 | -30.911 | -2.436 | -0.026 | 0.079 | 0.078 | 0.064 | 0.052 | 0.042 |
| 1.794999999999984 | -31.195 | -2.463 | -0.027 | 0.079 | 0.078 | 0.065 | 0.052 | 0.042 |
| 1.799999999999984 | -31.48 | -2.49 | -0.029 | 0.079 | 0.079 | 0.065 | 0.052 | 0.042 |
| 1.804999999999983 | -31.767 | -2.518 | -0.03 | 0.079 | 0.079 | 0.065 | 0.053 | 0.043 |
| 1.809999999999983 | -32.055 | -2.545 | -0.032 | 0.079 | 0.079 | 0.066 | 0.053 | 0.043 |
| 1.814999999999983 | -32.344 | -2.573 | -0.033 | 0.079 | 0.08 | 0.066 | 0.053 | 0.043 |
| 1.819999999999983 | -32.635 | -2.601 | -0.035 | 0.079 | 0.08 | 0.066 | 0.054 | 0.043 |
| 1.824999999999983 | -32.927 | -2.629 | -0.037 | 0.079 | 0.08 | 0.067 | 0.054 | 0.044 |
| 1.829999999999983 | -33.22 | -2.657 | -0.038 | 0.079 | 0.08 | 0.067 | 0.054 | 0.044 |
| 1.834999999999983 | -33.515 | -2.685 | -0.04 | 0.079 | 0.081 | 0.067 | 0.054 | 0.044 |
| 1.839999999999983 | -33.811 | -2.714 | -0.042 | 0.079 | 0.081 | 0.068 | 0.055 | 0.044 |
| 1.844999999999983 | -34.109 | -2.742 | -0.043 | 0.079 | 0.081 | 0.068 | 0.055 | 0.045 |
| 1.849999999999982 | -34.407 | -2.771 | -0.045 | 0.079 | 0.082 | 0.068 | 0.055 | 0.045 |
| 1.854999999999982 | -34.708 | -2.8 | -0.047 | 0.079 | 0.082 | 0.069 | 0.056 | 0.045 |
| 1.859999999999982 | -35.009 | -2.829 | -0.049 | 0.079 | 0.082 | 0.069 | 0.056 | 0.045 |
| 1.864999999999982 | -35.312 | -2.858 | -0.05 | 0.079 | 0.083 | 0.069 | 0.056 | 0.046 |
| 1.869999999999982 | -35.616 | -2.888 | -0.052 | 0.079 | 0.083 | 0.07 | 0.056 | 0.046 |
| 1.874999999999982 | -35.922 | -2.917 | -0.054 | 0.079 | 0.083 | 0.07 | 0.057 | 0.046 |
| 1.879999999999982 | -36.229 | -2.947 | -0.056 | 0.079 | 0.083 | 0.07 | 0.057 | 0.046 |
| 1.884999999999982 | -36.537 | -2.977 | -0.058 | 0.079 | 0.084 | 0.07 | 0.057 | 0.046 |
| 1.889999999999982 | -36.847 | -3.007 | -0.059 | 0.079 | 0.084 | 0.071 | 0.057 | 0.047 |
| 1.894999999999982 | -37.158 | -3.037 | -0.061 | 0.079 | 0.084 | 0.071 | 0.058 | 0.047 |
| 1.899999999999981 | -37.47 | -3.067 | -0.063 | 0.079 | 0.084 | 0.071 | 0.058 | 0.047 |
| 1.904999999999981 | -37.784 | -3.097 | -0.065 | 0.079 | 0.085 | 0.072 | 0.058 | 0.047 |
| 1.909999999999981 | -38.099 | -3.128 | -0.067 | 0.079 | 0.085 | 0.072 | 0.059 | 0.048 |
| 1.914999999999981 | -38.415 | -3.159 | -0.069 | 0.079 | 0.085 | 0.072 | 0.059 | 0.048 |
| 1.919999999999981 | -38.733 | -3.19 | -0.071 | 0.079 | 0.085 | 0.072 | 0.059 | 0.048 |
| 1.924999999999981 | -39.052 | -3.221 | -0.073 | 0.079 | 0.086 | 0.073 | 0.059 | 0.048 |
| 1.929999999999981 | -39.372 | -3.252 | -0.075 | 0.079 | 0.086 | 0.073 | 0.06 | 0.049 |
| 1.934999999999981 | -39.694 | -3.283 | -0.077 | 0.079 | 0.086 | 0.073 | 0.06 | 0.049 |
| 1.939999999999981 | -40.017 | -3.315 | -0.079 | 0.079 | 0.087 | 0.074 | 0.06 | 0.049 |
| 1.94499999999998 | -40.342 | -3.346 | -0.081 | 0.079 | 0.087 | 0.074 | 0.06 | 0.049 |
| 1.94999999999998 | -40.667 | -3.378 | -0.083 | 0.078 | 0.087 | 0.074 | 0.061 | 0.049 |
| 1.95499999999998 | -40.995 | -3.41 | -0.085 | 0.078 | 0.087 | 0.075 | 0.061 | 0.05 |
| 1.95999999999998 | -41.323 | -3.442 | -0.087 | 0.078 | 0.087 | 0.075 | 0.061 | 0.05 |
| 1.96499999999998 | -41.653 | -3.474 | -0.089 | 0.078 | 0.088 | 0.075 | 0.061 | 0.05 |
| 1.96999999999998 | -41.984 | -3.506 | -0.091 | 0.078 | 0.088 | 0.075 | 0.062 | 0.05 |
| 1.97499999999998 | -42.317 | -3.539 | -0.093 | 0.078 | 0.088 | 0.076 | 0.062 | 0.051 |
| 1.97999999999998 | -42.651 | -3.572 | -0.095 | 0.078 | 0.088 | 0.076 | 0.062 | 0.051 |
| 1.98499999999998 | -42.986 | -3.604 | -0.098 | 0.078 | 0.089 | 0.076 | 0.062 | 0.051 |
| 1.98999999999998 | -43.323 | -3.637 | -0.1 | 0.077 | 0.089 | 0.077 | 0.063 | 0.051 |
| 1.994999999999979 | -43.661 | -3.67 | -0.102 | 0.077 | 0.089 | 0.077 | 0.063 | 0.052 |
| 1.999999999999979 | -44 | -3.704 | -0.104 | 0.077 | 0.089 | 0.077 | 0.063 | 0.052 |
| 2.004999999999979 | -44.341 | -3.737 | -0.106 | 0.077 | 0.09 | 0.077 | 0.064 | 0.052 |
| 2.009999999999979 | -44.683 | -3.771 | -0.109 | 0.077 | 0.09 | 0.078 | 0.064 | 0.052 |
| 2.014999999999979 | -45.026 | -3.804 | -0.111 | 0.077 | 0.09 | 0.078 | 0.064 | 0.052 |
| 2.019999999999979 | -45.371 | -3.838 | -0.113 | 0.076 | 0.09 | 0.078 | 0.064 | 0.053 |
| 2.02499999999998 | -45.717 | -3.872 | -0.116 | 0.076 | 0.09 | 0.078 | 0.065 | 0.053 |
| 2.029999999999979 | -46.064 | -3.906 | -0.118 | 0.076 | 0.091 | 0.079 | 0.065 | 0.053 |
| 2.034999999999979 | -46.413 | -3.941 | -0.12 | 0.076 | 0.091 | 0.079 | 0.065 | 0.053 |
| 2.039999999999979 | -46.763 | -3.975 | -0.123 | 0.076 | 0.091 | 0.079 | 0.065 | 0.054 |
| 2.044999999999979 | -47.115 | -4.01 | -0.125 | 0.076 | 0.091 | 0.08 | 0.066 | 0.054 |
| 2.049999999999978 | -47.467 | -4.045 | -0.127 | 0.075 | 0.091 | 0.08 | 0.066 | 0.054 |
| 2.054999999999978 | -47.822 | -4.079 | -0.13 | 0.075 | 0.092 | 0.08 | 0.066 | 0.054 |
| 2.059999999999978 | -48.177 | -4.115 | -0.132 | 0.075 | 0.092 | 0.08 | 0.066 | 0.054 |
| 2.064999999999978 | -48.534 | -4.15 | -0.135 | 0.075 | 0.092 | 0.081 | 0.067 | 0.055 |
| 2.069999999999978 | -48.892 | -4.185 | -0.137 | 0.074 | 0.092 | 0.081 | 0.067 | 0.055 |
| 2.074999999999978 | -49.252 | -4.221 | -0.139 | 0.074 | 0.092 | 0.081 | 0.067 | 0.055 |
| 2.079999999999978 | -49.613 | -4.256 | -0.142 | 0.074 | 0.093 | 0.081 | 0.067 | 0.055 |
| 2.084999999999978 | -49.975 | -4.292 | -0.144 | 0.074 | 0.093 | 0.082 | 0.068 | 0.056 |
| 2.089999999999978 | -50.339 | -4.328 | -0.147 | 0.073 | 0.093 | 0.082 | 0.068 | 0.056 |
| 2.094999999999978 | -50.704 | -4.364 | -0.149 | 0.073 | 0.093 | 0.082 | 0.068 | 0.056 |
| 2.099999999999977 | -51.07 | -4.4 | -0.152 | 0.073 | 0.093 | 0.082 | 0.068 | 0.056 |
| 2.104999999999977 | -51.438 | -4.437 | -0.155 | 0.073 | 0.094 | 0.083 | 0.069 | 0.056 |
| 2.109999999999977 | -51.807 | -4.473 | -0.157 | 0.072 | 0.094 | 0.083 | 0.069 | 0.057 |
| 2.114999999999977 | -52.177 | -4.51 | -0.16 | 0.072 | 0.094 | 0.083 | 0.069 | 0.057 |
| 2.119999999999977 | -52.549 | -4.547 | -0.162 | 0.072 | 0.094 | 0.083 | 0.069 | 0.057 |
| 2.124999999999977 | -52.922 | -4.584 | -0.165 | 0.072 | 0.094 | 0.084 | 0.07 | 0.057 |
| 2.129999999999977 | -53.296 | -4.621 | -0.168 | 0.071 | 0.094 | 0.084 | 0.07 | 0.057 |
| 2.134999999999977 | -53.672 | -4.658 | -0.17 | 0.071 | 0.095 | 0.084 | 0.07 | 0.058 |
| 2.139999999999977 | -54.049 | -4.696 | -0.173 | 0.071 | 0.095 | 0.084 | 0.07 | 0.058 |
| 2.144999999999976 | -54.428 | -4.733 | -0.176 | 0.07 | 0.095 | 0.085 | 0.071 | 0.058 |
| 2.149999999999976 | -54.807 | -4.771 | -0.178 | 0.07 | 0.095 | 0.085 | 0.071 | 0.058 |
| 2.154999999999976 | -55.189 | -4.809 | -0.181 | 0.07 | 0.095 | 0.085 | 0.071 | 0.059 |
| 2.159999999999976 | -55.571 | -4.847 | -0.184 | 0.069 | 0.095 | 0.085 | 0.071 | 0.059 |
| 2.164999999999976 | -55.955 | -4.885 | -0.187 | 0.069 | 0.096 | 0.086 | 0.071 | 0.059 |
| 2.169999999999976 | -56.34 | -4.924 | -0.189 | 0.069 | 0.096 | 0.086 | 0.072 | 0.059 |
| 2.174999999999976 | -56.727 | -4.962 | -0.192 | 0.068 | 0.096 | 0.086 | 0.072 | 0.059 |
| 2.179999999999976 | -57.115 | -5.001 | -0.195 | 0.068 | 0.096 | 0.086 | 0.072 | 0.06 |
| 2.184999999999976 | -57.504 | -5.04 | -0.198 | 0.068 | 0.096 | 0.087 | 0.072 | 0.06 |
| 2.189999999999975 | -57.895 | -5.079 | -0.201 | 0.067 | 0.096 | 0.087 | 0.073 | 0.06 |
| 2.194999999999975 | -58.287 | -5.118 | -0.204 | 0.067 | 0.096 | 0.087 | 0.073 | 0.06 |
| 2.199999999999975 | -58.68 | -5.157 | -0.206 | 0.067 | 0.097 | 0.087 | 0.073 | 0.06 |
| 2.204999999999975 | -59.075 | -5.196 | -0.209 | 0.066 | 0.097 | 0.088 | 0.073 | 0.061 |
| 2.209999999999975 | -59.471 | -5.236 | -0.212 | 0.066 | 0.097 | 0.088 | 0.074 | 0.061 |
| 2.214999999999975 | -59.868 | -5.276 | -0.215 | 0.066 | 0.097 | 0.088 | 0.074 | 0.061 |
| 2.219999999999975 | -60.267 | -5.316 | -0.218 | 0.065 | 0.097 | 0.088 | 0.074 | 0.061 |
| 2.224999999999975 | -60.667 | -5.356 | -0.221 | 0.065 | 0.097 | 0.089 | 0.074 | 0.062 |
| 2.229999999999975 | -61.068 | -5.396 | -0.224 | 0.064 | 0.097 | 0.089 | 0.075 | 0.062 |
| 2.234999999999975 | -61.471 | -5.436 | -0.227 | 0.064 | 0.097 | 0.089 | 0.075 | 0.062 |
| 2.239999999999974 | -61.875 | -5.477 | -0.23 | 0.064 | 0.098 | 0.089 | 0.075 | 0.062 |
| 2.244999999999974 | -62.281 | -5.517 | -0.233 | 0.063 | 0.098 | 0.089 | 0.075 | 0.062 |
| 2.249999999999974 | -62.687 | -5.558 | -0.236 | 0.063 | 0.098 | 0.09 | 0.075 | 0.063 |
| 2.254999999999974 | -63.096 | -5.599 | -0.239 | 0.062 | 0.098 | 0.09 | 0.076 | 0.063 |
| 2.259999999999974 | -63.505 | -5.64 | -0.242 | 0.062 | 0.098 | 0.09 | 0.076 | 0.063 |
| 2.264999999999974 | -63.916 | -5.681 | -0.245 | 0.061 | 0.098 | 0.09 | 0.076 | 0.063 |
| 2.269999999999974 | -64.328 | -5.722 | -0.249 | 0.061 | 0.098 | 0.091 | 0.076 | 0.063 |
| 2.274999999999974 | -64.742 | -5.764 | -0.252 | 0.061 | 0.098 | 0.091 | 0.077 | 0.064 |
| 2.279999999999974 | -65.157 | -5.806 | -0.255 | 0.06 | 0.099 | 0.091 | 0.077 | 0.064 |
| 2.284999999999973 | -65.573 | -5.847 | -0.258 | 0.06 | 0.099 | 0.091 | 0.077 | 0.064 |
| 2.289999999999973 | -65.991 | -5.889 | -0.261 | 0.059 | 0.099 | 0.091 | 0.077 | 0.064 |
| 2.294999999999973 | -66.41 | -5.931 | -0.264 | 0.059 | 0.099 | 0.092 | 0.078 | 0.064 |
| 2.299999999999973 | -66.83 | -5.974 | -0.268 | 0.058 | 0.099 | 0.092 | 0.078 | 0.065 |
| 2.304999999999973 | -67.252 | -6.016 | -0.271 | 0.058 | 0.099 | 0.092 | 0.078 | 0.065 |
| 2.309999999999973 | -67.675 | -6.059 | -0.274 | 0.057 | 0.099 | 0.092 | 0.078 | 0.065 |
| 2.314999999999973 | -68.099 | -6.101 | -0.277 | 0.057 | 0.099 | 0.093 | 0.078 | 0.065 |
| 2.319999999999973 | -68.525 | -6.144 | -0.281 | 0.056 | 0.099 | 0.093 | 0.079 | 0.065 |
| 2.324999999999973 | -68.952 | -6.187 | -0.284 | 0.056 | 0.099 | 0.093 | 0.079 | 0.066 |
| 2.329999999999972 | -69.38 | -6.23 | -0.287 | 0.055 | 0.099 | 0.093 | 0.079 | 0.066 |
| 2.334999999999972 | -69.81 | -6.274 | -0.291 | 0.055 | 0.1 | 0.093 | 0.079 | 0.066 |
| 2.339999999999972 | -70.241 | -6.317 | -0.294 | 0.054 | 0.1 | 0.094 | 0.08 | 0.066 |
| 2.344999999999972 | -70.674 | -6.361 | -0.297 | 0.054 | 0.1 | 0.094 | 0.08 | 0.066 |
| 2.349999999999972 | -71.107 | -6.405 | -0.301 | 0.053 | 0.1 | 0.094 | 0.08 | 0.067 |
| 2.354999999999972 | -71.543 | -6.448 | -0.304 | 0.053 | 0.1 | 0.094 | 0.08 | 0.067 |
| 2.359999999999972 | -71.979 | -6.493 | -0.307 | 0.052 | 0.1 | 0.094 | 0.08 | 0.067 |
| 2.364999999999972 | -72.417 | -6.537 | -0.311 | 0.052 | 0.1 | 0.095 | 0.081 | 0.067 |
| 2.369999999999972 | -72.856 | -6.581 | -0.314 | 0.051 | 0.1 | 0.095 | 0.081 | 0.067 |
| 2.374999999999972 | -73.297 | -6.626 | -0.318 | 0.051 | 0.1 | 0.095 | 0.081 | 0.068 |
| 2.379999999999971 | -73.739 | -6.67 | -0.321 | 0.05 | 0.1 | 0.095 | 0.081 | 0.068 |
| 2.384999999999971 | -74.182 | -6.715 | -0.325 | 0.049 | 0.1 | 0.095 | 0.081 | 0.068 |
| 2.389999999999971 | -74.627 | -6.76 | -0.328 | 0.049 | 0.1 | 0.096 | 0.082 | 0.068 |
| 2.394999999999971 | -75.073 | -6.805 | -0.332 | 0.048 | 0.1 | 0.096 | 0.082 | 0.068 |
| 2.399999999999971 | -75.52 | -6.85 | -0.335 | 0.048 | 0.1 | 0.096 | 0.082 | 0.069 |
| 2.404999999999971 | -75.969 | -6.896 | -0.339 | 0.047 | 0.1 | 0.096 | 0.082 | 0.069 |
| 2.409999999999971 | -76.419 | -6.941 | -0.343 | 0.047 | 0.1 | 0.096 | 0.083 | 0.069 |
| 2.414999999999971 | -76.87 | -6.987 | -0.346 | 0.046 | 0.1 | 0.097 | 0.083 | 0.069 |
| 2.419999999999971 | -77.323 | -7.033 | -0.35 | 0.045 | 0.101 | 0.097 | 0.083 | 0.069 |
| 2.42499999999997 | -77.777 | -7.079 | -0.353 | 0.045 | 0.101 | 0.097 | 0.083 | 0.07 |
| 2.42999999999997 | -78.232 | -7.125 | -0.357 | 0.044 | 0.101 | 0.097 | 0.083 | 0.07 |
| 2.43499999999997 | -78.689 | -7.171 | -0.361 | 0.044 | 0.101 | 0.097 | 0.084 | 0.07 |
| 2.43999999999997 | -79.147 | -7.218 | -0.364 | 0.043 | 0.101 | 0.097 | 0.084 | 0.07 |
| 2.44499999999997 | -79.607 | -7.264 | -0.368 | 0.042 | 0.101 | 0.098 | 0.084 | 0.07 |
| 2.44999999999997 | -80.067 | -7.311 | -0.372 | 0.042 | 0.101 | 0.098 | 0.084 | 0.071 |
| 2.45499999999997 | -80.53 | -7.358 | -0.375 | 0.041 | 0.101 | 0.098 | 0.084 | 0.071 |
| 2.45999999999997 | -80.993 | -7.405 | -0.379 | 0.04 | 0.101 | 0.098 | 0.085 | 0.071 |
| 2.46499999999997 | -81.458 | -7.452 | -0.383 | 0.04 | 0.101 | 0.098 | 0.085 | 0.071 |
| 2.46999999999997 | -81.924 | -7.5 | -0.387 | 0.039 | 0.101 | 0.099 | 0.085 | 0.071 |
| 2.474999999999969 | -82.392 | -7.547 | -0.391 | 0.039 | 0.101 | 0.099 | 0.085 | 0.072 |
| 2.479999999999969 | -82.861 | -7.595 | -0.394 | 0.038 | 0.101 | 0.099 | 0.085 | 0.072 |
| 2.484999999999969 | -83.331 | -7.643 | -0.398 | 0.037 | 0.101 | 0.099 | 0.086 | 0.072 |
| 2.489999999999969 | -83.803 | -7.691 | -0.402 | 0.037 | 0.101 | 0.099 | 0.086 | 0.072 |
| 2.494999999999969 | -84.276 | -7.739 | -0.406 | 0.036 | 0.101 | 0.099 | 0.086 | 0.072 |
| 2.499999999999969 | -84.75 | -7.787 | -0.41 | 0.035 | 0.101 | 0.1 | 0.086 | 0.073 |
| 2.504999999999969 | -85.226 | -7.835 | -0.414 | 0.034 | 0.101 | 0.1 | 0.086 | 0.073 |
| 2.509999999999969 | -85.703 | -7.884 | -0.418 | 0.034 | 0.101 | 0.1 | 0.087 | 0.073 |
| 2.514999999999969 | -86.181 | -7.933 | -0.422 | 0.033 | 0.101 | 0.1 | 0.087 | 0.073 |
| 2.519999999999968 | -86.661 | -7.982 | -0.425 | 0.032 | 0.101 | 0.1 | 0.087 | 0.073 |
| 2.524999999999968 | -87.142 | -8.031 | -0.429 | 0.032 | 0.101 | 0.1 | 0.087 | 0.074 |
| 2.529999999999968 | -87.624 | -8.08 | -0.433 | 0.031 | 0.101 | 0.101 | 0.087 | 0.074 |
| 2.534999999999968 | -88.108 | -8.129 | -0.437 | 0.03 | 0.101 | 0.101 | 0.088 | 0.074 |
| 2.539999999999968 | -88.593 | -8.179 | -0.441 | 0.03 | 0.101 | 0.101 | 0.088 | 0.074 |
| 2.544999999999968 | -89.08 | -8.228 | -0.445 | 0.029 | 0.101 | 0.101 | 0.088 | 0.074 |
| 2.549999999999968 | -89.567 | -8.278 | -0.45 | 0.028 | 0.101 | 0.101 | 0.088 | 0.074 |
| 2.554999999999968 | -90.057 | -8.328 | -0.454 | 0.027 | 0.101 | 0.101 | 0.088 | 0.075 |
| 2.559999999999968 | -90.547 | -8.378 | -0.458 | 0.027 | 0.101 | 0.102 | 0.089 | 0.075 |
| 2.564999999999968 | -91.039 | -8.428 | -0.462 | 0.026 | 0.101 | 0.102 | 0.089 | 0.075 |
| 2.569999999999967 | -91.532 | -8.478 | -0.466 | 0.025 | 0.101 | 0.102 | 0.089 | 0.075 |
| 2.574999999999967 | -92.027 | -8.529 | -0.47 | 0.024 | 0.101 | 0.102 | 0.089 | 0.075 |
| 2.579999999999967 | -92.523 | -8.58 | -0.474 | 0.024 | 0.101 | 0.102 | 0.089 | 0.076 |
| 2.584999999999967 | -93.02 | -8.63 | -0.478 | 0.023 | 0.101 | 0.102 | 0.09 | 0.076 |
| 2.589999999999967 | -93.519 | -8.681 | -0.483 | 0.022 | 0.101 | 0.103 | 0.09 | 0.076 |
| 2.594999999999967 | -94.019 | -8.732 | -0.487 | 0.021 | 0.101 | 0.103 | 0.09 | 0.076 |
| 2.599999999999967 | -94.52 | -8.784 | -0.491 | 0.02 | 0.101 | 0.103 | 0.09 | 0.076 |
| 2.604999999999967 | -95.023 | -8.835 | -0.495 | 0.02 | 0.101 | 0.103 | 0.09 | 0.077 |
| 2.609999999999966 | -95.527 | -8.887 | -0.499 | 0.019 | 0.101 | 0.103 | 0.091 | 0.077 |
| 2.614999999999966 | -96.032 | -8.938 | -0.504 | 0.018 | 0.101 | 0.103 | 0.091 | 0.077 |
| 2.619999999999966 | -96.539 | -8.99 | -0.508 | 0.017 | 0.101 | 0.104 | 0.091 | 0.077 |
| 2.624999999999966 | -97.047 | -9.042 | -0.512 | 0.016 | 0.1 | 0.104 | 0.091 | 0.077 |
| 2.629999999999966 | -97.556 | -9.094 | -0.517 | 0.016 | 0.1 | 0.104 | 0.091 | 0.077 |
| 2.634999999999966 | -98.067 | -9.147 | -0.521 | 0.015 | 0.1 | 0.104 | 0.092 | 0.078 |
| 2.639999999999966 | -98.579 | -9.199 | -0.525 | 0.014 | 0.1 | 0.104 | 0.092 | 0.078 |
| 2.644999999999966 | -99.093 | -9.252 | -0.53 | 0.013 | 0.1 | 0.104 | 0.092 | 0.078 |
| 2.649999999999966 | -99.607 | -9.305 | -0.534 | 0.012 | 0.1 | 0.104 | 0.092 | 0.078 |
| 2.654999999999966 | -100.124 | -9.357 | -0.538 | 0.011 | 0.1 | 0.105 | 0.092 | 0.078 |
| 2.659999999999965 | -100.641 | -9.411 | -0.543 | 0.011 | 0.1 | 0.105 | 0.092 | 0.079 |
| 2.664999999999965 | -101.16 | -9.464 | -0.547 | 0.01 | 0.1 | 0.105 | 0.093 | 0.079 |
| 2.669999999999965 | -101.68 | -9.517 | -0.552 | 0.009 | 0.1 | 0.105 | 0.093 | 0.079 |
| 2.674999999999965 | -102.202 | -9.571 | -0.556 | 0.008 | 0.1 | 0.105 | 0.093 | 0.079 |
| 2.679999999999965 | -102.725 | -9.624 | -0.561 | 0.007 | 0.1 | 0.105 | 0.093 | 0.079 |
| 2.684999999999965 | -103.249 | -9.678 | -0.565 | 0.006 | 0.1 | 0.105 | 0.093 | 0.079 |
| 2.689999999999965 | -103.775 | -9.732 | -0.57 | 0.005 | 0.1 | 0.105 | 0.094 | 0.08 |
| 2.694999999999965 | -104.302 | -9.786 | -0.574 | 0.004 | 0.1 | 0.106 | 0.094 | 0.08 |
| 2.699999999999965 | -104.83 | -9.84 | -0.579 | 0.004 | 0.1 | 0.106 | 0.094 | 0.08 |
| 2.704999999999964 | -105.36 | -9.895 | -0.583 | 0.003 | 0.099 | 0.106 | 0.094 | 0.08 |
| 2.709999999999964 | -105.891 | -9.949 | -0.588 | 0.002 | 0.099 | 0.106 | 0.094 | 0.08 |
| 2.714999999999964 | -106.423 | -10.004 | -0.592 | 0.001 | 0.099 | 0.106 | 0.094 | 0.08 |
| 2.719999999999964 | -106.957 | -10.059 | -0.597 | 0 | 0.099 | 0.106 | 0.095 | 0.081 |
| 2.724999999999964 | -107.492 | -10.114 | -0.602 | -0.001 | 0.099 | 0.106 | 0.095 | 0.081 |
| 2.729999999999964 | -108.028 | -10.169 | -0.606 | -0.002 | 0.099 | 0.107 | 0.095 | 0.081 |
| 2.734999999999964 | -108.566 | -10.224 | -0.611 | -0.003 | 0.099 | 0.107 | 0.095 | 0.081 |
| 2.739999999999964 | -109.105 | -10.28 | -0.616 | -0.004 | 0.099 | 0.107 | 0.095 | 0.081 |
| 2.744999999999964 | -109.646 | -10.335 | -0.62 | -0.005 | 0.099 | 0.107 | 0.096 | 0.082 |
| 2.749999999999964 | -110.187 | -10.391 | -0.625 | -0.006 | 0.099 | 0.107 | 0.096 | 0.082 |
| 2.754999999999963 | -110.731 | -10.447 | -0.63 | -0.007 | 0.099 | 0.107 | 0.096 | 0.082 |
| 2.759999999999963 | -111.275 | -10.503 | -0.635 | -0.008 | 0.098 | 0.107 | 0.096 | 0.082 |
| 2.764999999999963 | -111.821 | -10.559 | -0.639 | -0.008 | 0.098 | 0.107 | 0.096 | 0.082 |
| 2.769999999999963 | -112.368 | -10.616 | -0.644 | -0.009 | 0.098 | 0.108 | 0.096 | 0.082 |
| 2.774999999999963 | -112.917 | -10.672 | -0.649 | -0.01 | 0.098 | 0.108 | 0.097 | 0.083 |
| 2.779999999999963 | -113.467 | -10.729 | -0.654 | -0.011 | 0.098 | 0.108 | 0.097 | 0.083 |
| 2.784999999999963 | -114.018 | -10.786 | -0.659 | -0.012 | 0.098 | 0.108 | 0.097 | 0.083 |
| 2.789999999999963 | -114.571 | -10.843 | -0.663 | -0.013 | 0.098 | 0.108 | 0.097 | 0.083 |
| 2.794999999999963 | -115.125 | -10.9 | -0.668 | -0.014 | 0.098 | 0.108 | 0.097 | 0.083 |
| 2.799999999999962 | -115.68 | -10.957 | -0.673 | -0.015 | 0.098 | 0.108 | 0.097 | 0.083 |
| 2.804999999999962 | -116.237 | -11.014 | -0.678 | -0.016 | 0.097 | 0.108 | 0.098 | 0.084 |
| 2.809999999999962 | -116.795 | -11.072 | -0.683 | -0.017 | 0.097 | 0.108 | 0.098 | 0.084 |
| 2.814999999999962 | -117.354 | -11.13 | -0.688 | -0.018 | 0.097 | 0.109 | 0.098 | 0.084 |
| 2.819999999999962 | -117.915 | -11.188 | -0.693 | -0.019 | 0.097 | 0.109 | 0.098 | 0.084 |
| 2.824999999999962 | -118.477 | -11.246 | -0.698 | -0.02 | 0.097 | 0.109 | 0.098 | 0.084 |
| 2.829999999999962 | -119.04 | -11.304 | -0.703 | -0.021 | 0.097 | 0.109 | 0.098 | 0.084 |
| 2.834999999999962 | -119.605 | -11.362 | -0.708 | -0.022 | 0.097 | 0.109 | 0.099 | 0.085 |
| 2.839999999999962 | -120.171 | -11.421 | -0.713 | -0.024 | 0.096 | 0.109 | 0.099 | 0.085 |
| 2.844999999999962 | -120.739 | -11.479 | -0.718 | -0.025 | 0.096 | 0.109 | 0.099 | 0.085 |
| 2.849999999999961 | -121.307 | -11.538 | -0.723 | -0.026 | 0.096 | 0.109 | 0.099 | 0.085 |
| 2.854999999999961 | -121.878 | -11.597 | -0.728 | -0.027 | 0.096 | 0.109 | 0.099 | 0.085 |
| 2.859999999999961 | -122.449 | -11.656 | -0.733 | -0.028 | 0.096 | 0.109 | 0.099 | 0.086 |
| 2.864999999999961 | -123.022 | -11.715 | -0.738 | -0.029 | 0.096 | 0.11 | 0.1 | 0.086 |
| 2.869999999999961 | -123.596 | -11.774 | -0.743 | -0.03 | 0.096 | 0.11 | 0.1 | 0.086 |
| 2.874999999999961 | -124.172 | -11.834 | -0.748 | -0.031 | 0.095 | 0.11 | 0.1 | 0.086 |
| 2.879999999999961 | -124.749 | -11.894 | -0.753 | -0.032 | 0.095 | 0.11 | 0.1 | 0.086 |
| 2.884999999999961 | -125.327 | -11.953 | -0.759 | -0.033 | 0.095 | 0.11 | 0.1 | 0.086 |
| 2.889999999999961 | -125.907 | -12.013 | -0.764 | -0.034 | 0.095 | 0.11 | 0.1 | 0.087 |
| 2.89499999999996 | -126.488 | -12.073 | -0.769 | -0.035 | 0.095 | 0.11 | 0.1 | 0.087 |
| 2.89999999999996 | -127.07 | -12.134 | -0.774 | -0.036 | 0.095 | 0.11 | 0.101 | 0.087 |
| 2.90499999999996 | -127.654 | -12.194 | -0.779 | -0.038 | 0.095 | 0.11 | 0.101 | 0.087 |
| 2.90999999999996 | -128.239 | -12.255 | -0.785 | -0.039 | 0.094 | 0.11 | 0.101 | 0.087 |
| 2.91499999999996 | -128.825 | -12.315 | -0.79 | -0.04 | 0.094 | 0.11 | 0.101 | 0.087 |
| 2.91999999999996 | -129.413 | -12.376 | -0.795 | -0.041 | 0.094 | 0.111 | 0.101 | 0.087 |
| 2.92499999999996 | -130.002 | -12.437 | -0.801 | -0.042 | 0.094 | 0.111 | 0.101 | 0.088 |
| 2.92999999999996 | -130.592 | -12.498 | -0.806 | -0.043 | 0.094 | 0.111 | 0.102 | 0.088 |
| 2.93499999999996 | -131.184 | -12.56 | -0.811 | -0.044 | 0.093 | 0.111 | 0.102 | 0.088 |
| 2.93999999999996 | -131.777 | -12.621 | -0.817 | -0.045 | 0.093 | 0.111 | 0.102 | 0.088 |
| 2.944999999999959 | -132.372 | -12.683 | -0.822 | -0.047 | 0.093 | 0.111 | 0.102 | 0.088 |
| 2.949999999999959 | -132.967 | -12.745 | -0.827 | -0.048 | 0.093 | 0.111 | 0.102 | 0.088 |
| 2.954999999999959 | -133.565 | -12.806 | -0.833 | -0.049 | 0.093 | 0.111 | 0.102 | 0.089 |
| 2.959999999999959 | -134.163 | -12.869 | -0.838 | -0.05 | 0.093 | 0.111 | 0.102 | 0.089 |
| 2.964999999999959 | -134.763 | -12.931 | -0.844 | -0.051 | 0.092 | 0.111 | 0.103 | 0.089 |
| 2.969999999999959 | -135.364 | -12.993 | -0.849 | -0.052 | 0.092 | 0.111 | 0.103 | 0.089 |
| 2.974999999999959 | -135.967 | -13.056 | -0.854 | -0.054 | 0.092 | 0.111 | 0.103 | 0.089 |
| 2.979999999999959 | -136.571 | -13.118 | -0.86 | -0.055 | 0.092 | 0.112 | 0.103 | 0.089 |
| 2.984999999999959 | -137.176 | -13.181 | -0.865 | -0.056 | 0.092 | 0.112 | 0.103 | 0.09 |
| 2.989999999999958 | -137.783 | -13.244 | -0.871 | -0.057 | 0.091 | 0.112 | 0.103 | 0.09 |
| 2.994999999999958 | -138.391 | -13.307 | -0.876 | -0.058 | 0.091 | 0.112 | 0.104 | 0.09 |
| 2.999999999999958 | -139 | -13.37 | -0.882 | -0.06 | 0.091 | 0.112 | 0.104 | 0.09 |
| 3.004999999999958 | -139.611 | -13.434 | -0.888 | -0.061 | 0.091 | 0.112 | 0.104 | 0.09 |
| 3.009999999999958 | -140.223 | -13.497 | -0.893 | -0.062 | 0.091 | 0.112 | 0.104 | 0.09 |
| 3.014999999999958 | -140.836 | -13.561 | -0.899 | -0.063 | 0.09 | 0.112 | 0.104 | 0.091 |
| 3.019999999999958 | -141.451 | -13.625 | -0.904 | -0.064 | 0.09 | 0.112 | 0.104 | 0.091 |
| 3.024999999999958 | -142.067 | -13.689 | -0.91 | -0.066 | 0.09 | 0.112 | 0.104 | 0.091 |
| 3.029999999999958 | -142.684 | -13.753 | -0.916 | -0.067 | 0.09 | 0.112 | 0.105 | 0.091 |
| 3.034999999999958 | -143.303 | -13.817 | -0.921 | -0.068 | 0.089 | 0.112 | 0.105 | 0.091 |
| 3.039999999999957 | -143.923 | -13.882 | -0.927 | -0.069 | 0.089 | 0.112 | 0.105 | 0.091 |
| 3.044999999999957 | -144.545 | -13.946 | -0.933 | -0.071 | 0.089 | 0.112 | 0.105 | 0.091 |
| 3.049999999999957 | -145.167 | -14.011 | -0.938 | -0.072 | 0.089 | 0.112 | 0.105 | 0.092 |
| 3.054999999999957 | -145.792 | -14.076 | -0.944 | -0.073 | 0.089 | 0.112 | 0.105 | 0.092 |
| 3.059999999999957 | -146.417 | -14.141 | -0.95 | -0.074 | 0.088 | 0.113 | 0.105 | 0.092 |
| 3.064999999999957 | -147.044 | -14.206 | -0.956 | -0.076 | 0.088 | 0.113 | 0.106 | 0.092 |
| 3.069999999999957 | -147.672 | -14.272 | -0.961 | -0.077 | 0.088 | 0.113 | 0.106 | 0.092 |
| 3.074999999999957 | -148.302 | -14.337 | -0.967 | -0.078 | 0.088 | 0.113 | 0.106 | 0.092 |
| 3.079999999999957 | -148.933 | -14.403 | -0.973 | -0.08 | 0.087 | 0.113 | 0.106 | 0.093 |
| 3.084999999999956 | -149.565 | -14.469 | -0.979 | -0.081 | 0.087 | 0.113 | 0.106 | 0.093 |
| 3.089999999999956 | -150.199 | -14.535 | -0.985 | -0.082 | 0.087 | 0.113 | 0.106 | 0.093 |
| 3.094999999999956 | -150.834 | -14.601 | -0.991 | -0.084 | 0.087 | 0.113 | 0.106 | 0.093 |
| 3.099999999999956 | -151.47 | -14.667 | -0.996 | -0.085 | 0.086 | 0.113 | 0.106 | 0.093 |
| 3.104999999999956 | -152.108 | -14.733 | -1.002 | -0.086 | 0.086 | 0.113 | 0.107 | 0.093 |
| 3.109999999999956 | -152.747 | -14.8 | -1.008 | -0.087 | 0.086 | 0.113 | 0.107 | 0.093 |
| 3.114999999999956 | -153.387 | -14.867 | -1.014 | -0.089 | 0.086 | 0.113 | 0.107 | 0.094 |
| 3.119999999999956 | -154.029 | -14.934 | -1.02 | -0.09 | 0.085 | 0.113 | 0.107 | 0.094 |
| 3.124999999999956 | -154.672 | -15.001 | -1.026 | -0.091 | 0.085 | 0.113 | 0.107 | 0.094 |
| 3.129999999999955 | -155.316 | -15.068 | -1.032 | -0.093 | 0.085 | 0.113 | 0.107 | 0.094 |
| 3.134999999999955 | -155.962 | -15.135 | -1.038 | -0.094 | 0.085 | 0.113 | 0.107 | 0.094 |
| 3.139999999999955 | -156.609 | -15.203 | -1.044 | -0.096 | 0.084 | 0.113 | 0.108 | 0.094 |
| 3.144999999999955 | -157.258 | -15.27 | -1.05 | -0.097 | 0.084 | 0.113 | 0.108 | 0.095 |
| 3.149999999999955 | -157.907 | -15.338 | -1.056 | -0.098 | 0.084 | 0.113 | 0.108 | 0.095 |
| 3.154999999999955 | -158.559 | -15.406 | -1.062 | -0.1 | 0.083 | 0.113 | 0.108 | 0.095 |
| 3.159999999999955 | -159.211 | -15.474 | -1.068 | -0.101 | 0.083 | 0.113 | 0.108 | 0.095 |
| 3.164999999999955 | -159.865 | -15.542 | -1.074 | -0.102 | 0.083 | 0.114 | 0.108 | 0.095 |
| 3.169999999999955 | -160.52 | -15.61 | -1.081 | -0.104 | 0.083 | 0.114 | 0.108 | 0.095 |
| 3.174999999999955 | -161.177 | -15.679 | -1.087 | -0.105 | 0.082 | 0.114 | 0.108 | 0.095 |
| 3.179999999999954 | -161.835 | -15.748 | -1.093 | -0.107 | 0.082 | 0.114 | 0.109 | 0.096 |
| 3.184999999999954 | -162.494 | -15.816 | -1.099 | -0.108 | 0.082 | 0.114 | 0.109 | 0.096 |
| 3.189999999999954 | -163.155 | -15.885 | -1.105 | -0.109 | 0.081 | 0.114 | 0.109 | 0.096 |
| 3.194999999999954 | -163.817 | -15.954 | -1.111 | -0.111 | 0.081 | 0.114 | 0.109 | 0.096 |
| 3.199999999999954 | -164.48 | -16.024 | -1.118 | -0.112 | 0.081 | 0.114 | 0.109 | 0.096 |
| 3.204999999999954 | -165.145 | -16.093 | -1.124 | -0.114 | 0.081 | 0.114 | 0.109 | 0.096 |
| 3.209999999999954 | -165.811 | -16.163 | -1.13 | -0.115 | 0.08 | 0.114 | 0.109 | 0.096 |
| 3.214999999999954 | -166.478 | -16.232 | -1.136 | -0.117 | 0.08 | 0.114 | 0.109 | 0.097 |
| 3.219999999999954 | -167.147 | -16.302 | -1.143 | -0.118 | 0.08 | 0.114 | 0.11 | 0.097 |
| 3.224999999999953 | -167.817 | -16.372 | -1.149 | -0.119 | 0.079 | 0.114 | 0.11 | 0.097 |
| 3.229999999999953 | -168.488 | -16.442 | -1.155 | -0.121 | 0.079 | 0.114 | 0.11 | 0.097 |
| 3.234999999999953 | -169.161 | -16.513 | -1.162 | -0.122 | 0.079 | 0.114 | 0.11 | 0.097 |
| 3.239999999999953 | -169.835 | -16.583 | -1.168 | -0.124 | 0.078 | 0.114 | 0.11 | 0.097 |
| 3.244999999999953 | -170.511 | -16.654 | -1.174 | -0.125 | 0.078 | 0.114 | 0.11 | 0.097 |
| 3.249999999999953 | -171.187 | -16.725 | -1.181 | -0.127 | 0.078 | 0.114 | 0.11 | 0.098 |
| 3.254999999999953 | -171.866 | -16.795 | -1.187 | -0.128 | 0.078 | 0.114 | 0.11 | 0.098 |
| 3.259999999999953 | -172.545 | -16.867 | -1.193 | -0.13 | 0.077 | 0.114 | 0.11 | 0.098 |
| 3.264999999999952 | -173.226 | -16.938 | -1.2 | -0.131 | 0.077 | 0.114 | 0.111 | 0.098 |
| 3.269999999999952 | -173.908 | -17.009 | -1.206 | -0.133 | 0.077 | 0.114 | 0.111 | 0.098 |
| 3.274999999999952 | -174.592 | -17.081 | -1.213 | -0.134 | 0.076 | 0.114 | 0.111 | 0.098 |
| 3.279999999999952 | -175.277 | -17.152 | -1.219 | -0.136 | 0.076 | 0.114 | 0.111 | 0.098 |
| 3.284999999999952 | -175.963 | -17.224 | -1.226 | -0.137 | 0.076 | 0.114 | 0.111 | 0.099 |
| 3.289999999999952 | -176.651 | -17.296 | -1.232 | -0.139 | 0.075 | 0.114 | 0.111 | 0.099 |
| 3.294999999999952 | -177.34 | -17.368 | -1.239 | -0.14 | 0.075 | 0.114 | 0.111 | 0.099 |
| 3.299999999999952 | -178.03 | -17.44 | -1.245 | -0.142 | 0.075 | 0.114 | 0.111 | 0.099 |
| 3.304999999999952 | -178.722 | -17.513 | -1.252 | -0.143 | 0.074 | 0.114 | 0.112 | 0.099 |
| 3.309999999999952 | -179.415 | -17.585 | -1.259 | -0.145 | 0.074 | 0.114 | 0.112 | 0.099 |
| 3.314999999999951 | -180.109 | -17.658 | -1.265 | -0.146 | 0.074 | 0.114 | 0.112 | 0.099 |
| 3.319999999999951 | -180.805 | -17.731 | -1.272 | -0.148 | 0.073 | 0.114 | 0.112 | 0.1 |
| 3.324999999999951 | -181.502 | -17.804 | -1.278 | -0.149 | 0.073 | 0.114 | 0.112 | 0.1 |
| 3.329999999999951 | -182.2 | -17.877 | -1.285 | -0.151 | 0.073 | 0.114 | 0.112 | 0.1 |
| 3.334999999999951 | -182.9 | -17.95 | -1.292 | -0.153 | 0.072 | 0.114 | 0.112 | 0.1 |
| 3.339999999999951 | -183.601 | -18.024 | -1.298 | -0.154 | 0.072 | 0.114 | 0.112 | 0.1 |
| 3.344999999999951 | -184.304 | -18.097 | -1.305 | -0.156 | 0.071 | 0.114 | 0.112 | 0.1 |
| 3.349999999999951 | -185.007 | -18.171 | -1.312 | -0.157 | 0.071 | 0.114 | 0.112 | 0.1 |
| 3.354999999999951 | -185.713 | -18.245 | -1.318 | -0.159 | 0.071 | 0.114 | 0.113 | 0.101 |
| 3.359999999999951 | -186.419 | -18.319 | -1.325 | -0.16 | 0.07 | 0.114 | 0.113 | 0.101 |
| 3.36499999999995 | -187.127 | -18.393 | -1.332 | -0.162 | 0.07 | 0.114 | 0.113 | 0.101 |
| 3.36999999999995 | -187.836 | -18.468 | -1.339 | -0.164 | 0.07 | 0.114 | 0.113 | 0.101 |
| 3.37499999999995 | -188.547 | -18.542 | -1.346 | -0.165 | 0.069 | 0.114 | 0.113 | 0.101 |
| 3.37999999999995 | -189.259 | -18.617 | -1.352 | -0.167 | 0.069 | 0.114 | 0.113 | 0.101 |
| 3.38499999999995 | -189.972 | -18.692 | -1.359 | -0.168 | 0.069 | 0.114 | 0.113 | 0.101 |
| 3.38999999999995 | -190.687 | -18.767 | -1.366 | -0.17 | 0.068 | 0.114 | 0.113 | 0.101 |
| 3.39499999999995 | -191.403 | -18.842 | -1.373 | -0.172 | 0.068 | 0.114 | 0.113 | 0.102 |
| 3.39999999999995 | -192.12 | -18.917 | -1.38 | -0.173 | 0.067 | 0.114 | 0.114 | 0.102 |
| 3.40499999999995 | -192.839 | -18.992 | -1.387 | -0.175 | 0.067 | 0.114 | 0.114 | 0.102 |
| 3.409999999999949 | -193.559 | -19.068 | -1.394 | -0.177 | 0.067 | 0.114 | 0.114 | 0.102 |
| 3.414999999999949 | -194.28 | -19.144 | -1.401 | -0.178 | 0.066 | 0.114 | 0.114 | 0.102 |
| 3.419999999999949 | -195.003 | -19.22 | -1.407 | -0.18 | 0.066 | 0.114 | 0.114 | 0.102 |
| 3.424999999999949 | -195.727 | -19.296 | -1.414 | -0.182 | 0.065 | 0.114 | 0.114 | 0.102 |
| 3.429999999999949 | -196.452 | -19.372 | -1.421 | -0.183 | 0.065 | 0.114 | 0.114 | 0.103 |
| 3.434999999999949 | -197.179 | -19.448 | -1.428 | -0.185 | 0.065 | 0.114 | 0.114 | 0.103 |
| 3.439999999999949 | -197.907 | -19.525 | -1.435 | -0.187 | 0.064 | 0.114 | 0.114 | 0.103 |
| 3.444999999999949 | -198.637 | -19.601 | -1.442 | -0.188 | 0.064 | 0.114 | 0.114 | 0.103 |
| 3.449999999999949 | -199.367 | -19.678 | -1.45 | -0.19 | 0.063 | 0.114 | 0.115 | 0.103 |
| 3.454999999999949 | -200.1 | -19.755 | -1.457 | -0.192 | 0.063 | 0.114 | 0.115 | 0.103 |
| 3.459999999999948 | -200.833 | -19.832 | -1.464 | -0.193 | 0.063 | 0.114 | 0.115 | 0.103 |
| 3.464999999999948 | -201.568 | -19.909 | -1.471 | -0.195 | 0.062 | 0.114 | 0.115 | 0.103 |
| 3.469999999999948 | -202.304 | -19.986 | -1.478 | -0.197 | 0.062 | 0.114 | 0.115 | 0.104 |
| 3.474999999999948 | -203.042 | -20.064 | -1.485 | -0.198 | 0.061 | 0.114 | 0.115 | 0.104 |
| 3.479999999999948 | -203.781 | -20.142 | -1.492 | -0.2 | 0.061 | 0.114 | 0.115 | 0.104 |
| 3.484999999999948 | -204.521 | -20.219 | -1.499 | -0.202 | 0.061 | 0.114 | 0.115 | 0.104 |
| 3.489999999999948 | -205.263 | -20.297 | -1.507 | -0.204 | 0.06 | 0.114 | 0.115 | 0.104 |
| 3.494999999999948 | -206.006 | -20.375 | -1.514 | -0.205 | 0.06 | 0.114 | 0.115 | 0.104 |
| 3.499999999999948 | -206.75 | -20.454 | -1.521 | -0.207 | 0.059 | 0.114 | 0.115 | 0.104 |
| 3.504999999999947 | -207.496 | -20.532 | -1.528 | -0.209 | 0.059 | 0.113 | 0.116 | 0.104 |
| 3.509999999999947 | -208.243 | -20.611 | -1.535 | -0.211 | 0.058 | 0.113 | 0.116 | 0.105 |
| 3.514999999999947 | -208.991 | -20.689 | -1.543 | -0.212 | 0.058 | 0.113 | 0.116 | 0.105 |
| 3.519999999999947 | -209.741 | -20.768 | -1.55 | -0.214 | 0.058 | 0.113 | 0.116 | 0.105 |
| 3.524999999999947 | -210.492 | -20.847 | -1.557 | -0.216 | 0.057 | 0.113 | 0.116 | 0.105 |
| 3.529999999999947 | -211.244 | -20.926 | -1.565 | -0.218 | 0.057 | 0.113 | 0.116 | 0.105 |
| 3.534999999999947 | -211.998 | -21.006 | -1.572 | -0.219 | 0.056 | 0.113 | 0.116 | 0.105 |
| 3.539999999999947 | -212.753 | -21.085 | -1.579 | -0.221 | 0.056 | 0.113 | 0.116 | 0.105 |
| 3.544999999999947 | -213.51 | -21.165 | -1.587 | -0.223 | 0.055 | 0.113 | 0.116 | 0.105 |
| 3.549999999999947 | -214.267 | -21.245 | -1.594 | -0.225 | 0.055 | 0.113 | 0.116 | 0.106 |
| 3.554999999999946 | -215.027 | -21.324 | -1.601 | -0.226 | 0.055 | 0.113 | 0.116 | 0.106 |
| 3.559999999999946 | -215.787 | -21.405 | -1.609 | -0.228 | 0.054 | 0.113 | 0.116 | 0.106 |
| 3.564999999999946 | -216.549 | -21.485 | -1.616 | -0.23 | 0.054 | 0.113 | 0.117 | 0.106 |
| 3.569999999999946 | -217.312 | -21.565 | -1.624 | -0.232 | 0.053 | 0.113 | 0.117 | 0.106 |
| 3.574999999999946 | -218.077 | -21.646 | -1.631 | -0.234 | 0.053 | 0.113 | 0.117 | 0.106 |
| 3.579999999999946 | -218.843 | -21.726 | -1.639 | -0.236 | 0.052 | 0.113 | 0.117 | 0.106 |
| 3.584999999999946 | -219.61 | -21.807 | -1.646 | -0.237 | 0.052 | 0.113 | 0.117 | 0.106 |
| 3.589999999999946 | -220.379 | -21.888 | -1.654 | -0.239 | 0.051 | 0.113 | 0.117 | 0.107 |
| 3.594999999999946 | -221.149 | -21.969 | -1.661 | -0.241 | 0.051 | 0.113 | 0.117 | 0.107 |
| 3.599999999999945 | -221.92 | -22.05 | -1.669 | -0.243 | 0.05 | 0.113 | 0.117 | 0.107 |
| 3.604999999999945 | -222.693 | -22.132 | -1.676 | -0.245 | 0.05 | 0.113 | 0.117 | 0.107 |
| 3.609999999999945 | -223.467 | -22.213 | -1.684 | -0.247 | 0.049 | 0.113 | 0.117 | 0.107 |
| 3.614999999999945 | -224.242 | -22.295 | -1.691 | -0.248 | 0.049 | 0.112 | 0.117 | 0.107 |
| 3.619999999999945 | -225.019 | -22.377 | -1.699 | -0.25 | 0.049 | 0.112 | 0.117 | 0.107 |
| 3.624999999999945 | -225.797 | -22.459 | -1.707 | -0.252 | 0.048 | 0.112 | 0.118 | 0.107 |
| 3.629999999999945 | -226.576 | -22.541 | -1.714 | -0.254 | 0.048 | 0.112 | 0.118 | 0.107 |
| 3.634999999999945 | -227.357 | -22.623 | -1.722 | -0.256 | 0.047 | 0.112 | 0.118 | 0.108 |
| 3.639999999999945 | -228.139 | -22.706 | -1.73 | -0.258 | 0.047 | 0.112 | 0.118 | 0.108 |
| 3.644999999999944 | -228.923 | -22.788 | -1.737 | -0.26 | 0.046 | 0.112 | 0.118 | 0.108 |
| 3.649999999999944 | -229.707 | -22.871 | -1.745 | -0.262 | 0.046 | 0.112 | 0.118 | 0.108 |
| 3.654999999999944 | -230.494 | -22.954 | -1.753 | -0.263 | 0.045 | 0.112 | 0.118 | 0.108 |
| 3.659999999999944 | -231.281 | -23.037 | -1.761 | -0.265 | 0.045 | 0.112 | 0.118 | 0.108 |
| 3.664999999999944 | -232.07 | -23.12 | -1.768 | -0.267 | 0.044 | 0.112 | 0.118 | 0.108 |
| 3.669999999999944 | -232.86 | -23.204 | -1.776 | -0.269 | 0.044 | 0.112 | 0.118 | 0.108 |
| 3.674999999999944 | -233.652 | -23.287 | -1.784 | -0.271 | 0.043 | 0.112 | 0.118 | 0.108 |
| 3.679999999999944 | -234.445 | -23.371 | -1.792 | -0.273 | 0.043 | 0.112 | 0.118 | 0.109 |
| 3.684999999999944 | -235.239 | -23.455 | -1.8 | -0.275 | 0.042 | 0.112 | 0.118 | 0.109 |
| 3.689999999999943 | -236.035 | -23.539 | -1.807 | -0.277 | 0.042 | 0.111 | 0.118 | 0.109 |
| 3.694999999999943 | -236.832 | -23.623 | -1.815 | -0.279 | 0.041 | 0.111 | 0.119 | 0.109 |
| 3.699999999999943 | -237.63 | -23.707 | -1.823 | -0.281 | 0.041 | 0.111 | 0.119 | 0.109 |
| 3.704999999999943 | -238.43 | -23.791 | -1.831 | -0.283 | 0.04 | 0.111 | 0.119 | 0.109 |
| 3.709999999999943 | -239.231 | -23.876 | -1.839 | -0.285 | 0.04 | 0.111 | 0.119 | 0.109 |
| 3.714999999999943 | -240.033 | -23.961 | -1.847 | -0.287 | 0.039 | 0.111 | 0.119 | 0.109 |
| 3.719999999999943 | -240.837 | -24.046 | -1.855 | -0.289 | 0.039 | 0.111 | 0.119 | 0.11 |
| 3.724999999999943 | -241.642 | -24.131 | -1.863 | -0.291 | 0.038 | 0.111 | 0.119 | 0.11 |
| 3.729999999999943 | -242.448 | -24.216 | -1.871 | -0.293 | 0.038 | 0.111 | 0.119 | 0.11 |
| 3.734999999999943 | -243.256 | -24.301 | -1.879 | -0.295 | 0.037 | 0.111 | 0.119 | 0.11 |
| 3.739999999999942 | -244.065 | -24.387 | -1.887 | -0.297 | 0.037 | 0.111 | 0.119 | 0.11 |
| 3.744999999999942 | -244.876 | -24.472 | -1.895 | -0.299 | 0.036 | 0.111 | 0.119 | 0.11 |
| 3.749999999999942 | -245.687 | -24.558 | -1.903 | -0.301 | 0.035 | 0.11 | 0.119 | 0.11 |
| 3.754999999999942 | -246.501 | -24.644 | -1.911 | -0.303 | 0.035 | 0.11 | 0.119 | 0.11 |
| 3.759999999999942 | -247.315 | -24.73 | -1.919 | -0.305 | 0.034 | 0.11 | 0.119 | 0.11 |
| 3.764999999999942 | -248.131 | -24.816 | -1.927 | -0.307 | 0.034 | 0.11 | 0.119 | 0.11 |
| 3.769999999999942 | -248.948 | -24.902 | -1.935 | -0.309 | 0.033 | 0.11 | 0.119 | 0.111 |
| 3.774999999999942 | -249.767 | -24.989 | -1.943 | -0.311 | 0.033 | 0.11 | 0.12 | 0.111 |
| 3.779999999999942 | -250.587 | -25.076 | -1.951 | -0.313 | 0.032 | 0.11 | 0.12 | 0.111 |
| 3.784999999999941 | -251.408 | -25.162 | -1.96 | -0.315 | 0.032 | 0.11 | 0.12 | 0.111 |
| 3.789999999999941 | -252.231 | -25.249 | -1.968 | -0.317 | 0.031 | 0.11 | 0.12 | 0.111 |
| 3.794999999999941 | -253.055 | -25.336 | -1.976 | -0.319 | 0.031 | 0.11 | 0.12 | 0.111 |
| 3.799999999999941 | -253.88 | -25.424 | -1.984 | -0.321 | 0.03 | 0.11 | 0.12 | 0.111 |
| 3.804999999999941 | -254.707 | -25.511 | -1.992 | -0.323 | 0.029 | 0.109 | 0.12 | 0.111 |
| 3.809999999999941 | -255.535 | -25.599 | -2.001 | -0.325 | 0.029 | 0.109 | 0.12 | 0.111 |
| 3.814999999999941 | -256.364 | -25.686 | -2.009 | -0.327 | 0.028 | 0.109 | 0.12 | 0.112 |
| 3.819999999999941 | -257.195 | -25.774 | -2.017 | -0.329 | 0.028 | 0.109 | 0.12 | 0.112 |
| 3.824999999999941 | -258.027 | -25.862 | -2.026 | -0.331 | 0.027 | 0.109 | 0.12 | 0.112 |
| 3.829999999999941 | -258.86 | -25.95 | -2.034 | -0.333 | 0.027 | 0.109 | 0.12 | 0.112 |
| 3.83499999999994 | -259.695 | -26.039 | -2.042 | -0.335 | 0.026 | 0.109 | 0.12 | 0.112 |
| 3.83999999999994 | -260.531 | -26.127 | -2.051 | -0.337 | 0.026 | 0.109 | 0.12 | 0.112 |
| 3.84499999999994 | -261.369 | -26.216 | -2.059 | -0.34 | 0.025 | 0.109 | 0.12 | 0.112 |
| 3.84999999999994 | -262.207 | -26.305 | -2.067 | -0.342 | 0.024 | 0.109 | 0.12 | 0.112 |
| 3.85499999999994 | -263.048 | -26.393 | -2.076 | -0.344 | 0.024 | 0.108 | 0.12 | 0.112 |
| 3.85999999999994 | -263.889 | -26.483 | -2.084 | -0.346 | 0.023 | 0.108 | 0.12 | 0.112 |
| 3.86499999999994 | -264.732 | -26.572 | -2.093 | -0.348 | 0.023 | 0.108 | 0.12 | 0.113 |
| 3.86999999999994 | -265.576 | -26.661 | -2.101 | -0.35 | 0.022 | 0.108 | 0.121 | 0.113 |
| 3.87499999999994 | -266.422 | -26.751 | -2.109 | -0.352 | 0.021 | 0.108 | 0.121 | 0.113 |
| 3.879999999999939 | -267.269 | -26.84 | -2.118 | -0.354 | 0.021 | 0.108 | 0.121 | 0.113 |
| 3.884999999999939 | -268.117 | -26.93 | -2.126 | -0.357 | 0.02 | 0.108 | 0.121 | 0.113 |
| 3.889999999999939 | -268.967 | -27.02 | -2.135 | -0.359 | 0.02 | 0.108 | 0.121 | 0.113 |
| 3.894999999999939 | -269.818 | -27.11 | -2.143 | -0.361 | 0.019 | 0.108 | 0.121 | 0.113 |
| 3.899999999999939 | -270.67 | -27.2 | -2.152 | -0.363 | 0.019 | 0.107 | 0.121 | 0.113 |
| 3.904999999999939 | -271.524 | -27.291 | -2.161 | -0.365 | 0.018 | 0.107 | 0.121 | 0.113 |
| 3.909999999999939 | -272.379 | -27.381 | -2.169 | -0.367 | 0.017 | 0.107 | 0.121 | 0.113 |
| 3.914999999999939 | -273.235 | -27.472 | -2.178 | -0.369 | 0.017 | 0.107 | 0.121 | 0.114 |
| 3.919999999999939 | -274.093 | -27.563 | -2.186 | -0.372 | 0.016 | 0.107 | 0.121 | 0.114 |
| 3.924999999999939 | -274.952 | -27.654 | -2.195 | -0.374 | 0.016 | 0.107 | 0.121 | 0.114 |
| 3.929999999999938 | -275.812 | -27.745 | -2.204 | -0.376 | 0.015 | 0.107 | 0.121 | 0.114 |
| 3.934999999999938 | -276.674 | -27.836 | -2.212 | -0.378 | 0.014 | 0.107 | 0.121 | 0.114 |
| 3.939999999999938 | -277.537 | -27.928 | -2.221 | -0.38 | 0.014 | 0.106 | 0.121 | 0.114 |
| 3.944999999999938 | -278.402 | -28.019 | -2.23 | -0.383 | 0.013 | 0.106 | 0.121 | 0.114 |
| 3.949999999999938 | -279.267 | -28.111 | -2.238 | -0.385 | 0.012 | 0.106 | 0.121 | 0.114 |
| 3.954999999999938 | -280.135 | -28.203 | -2.247 | -0.387 | 0.012 | 0.106 | 0.121 | 0.114 |
| 3.959999999999938 | -281.003 | -28.295 | -2.256 | -0.389 | 0.011 | 0.106 | 0.121 | 0.114 |
| 3.964999999999938 | -281.873 | -28.387 | -2.265 | -0.391 | 0.011 | 0.106 | 0.121 | 0.115 |
| 3.969999999999938 | -282.744 | -28.48 | -2.273 | -0.394 | 0.01 | 0.106 | 0.121 | 0.115 |
| 3.974999999999937 | -283.617 | -28.572 | -2.282 | -0.396 | 0.009 | 0.106 | 0.121 | 0.115 |
| 3.979999999999937 | -284.491 | -28.665 | -2.291 | -0.398 | 0.009 | 0.105 | 0.121 | 0.115 |
| 3.984999999999937 | -285.366 | -28.758 | -2.3 | -0.4 | 0.008 | 0.105 | 0.121 | 0.115 |
| 3.989999999999937 | -286.243 | -28.851 | -2.309 | -0.403 | 0.007 | 0.105 | 0.122 | 0.115 |
| 3.994999999999937 | -287.121 | -28.944 | -2.318 | -0.405 | 0.007 | 0.105 | 0.122 | 0.115 |
| 3.999999999999937 | -288 | -29.037 | -2.326 | -0.407 | 0.006 | 0.105 | 0.122 | 0.115 |
| 4.004999999999937 | -288.881 | -29.13 | -2.335 | -0.409 | 0.006 | 0.105 | 0.122 | 0.115 |
| 4.009999999999936 | -289.763 | -29.224 | -2.344 | -0.412 | 0.005 | 0.105 | 0.122 | 0.115 |
| 4.014999999999937 | -290.646 | -29.318 | -2.353 | -0.414 | 0.004 | 0.104 | 0.122 | 0.115 |
| 4.019999999999936 | -291.531 | -29.412 | -2.362 | -0.416 | 0.004 | 0.104 | 0.122 | 0.116 |
| 4.024999999999936 | -292.417 | -29.506 | -2.371 | -0.419 | 0.003 | 0.104 | 0.122 | 0.116 |
| 4.029999999999936 | -293.304 | -29.6 | -2.38 | -0.421 | 0.002 | 0.104 | 0.122 | 0.116 |
| 4.034999999999936 | -294.193 | -29.694 | -2.389 | -0.423 | 0.002 | 0.104 | 0.122 | 0.116 |
| 4.039999999999936 | -295.083 | -29.789 | -2.398 | -0.426 | 0.001 | 0.104 | 0.122 | 0.116 |
| 4.044999999999936 | -295.975 | -29.883 | -2.407 | -0.428 | 0 | 0.104 | 0.122 | 0.116 |
| 4.049999999999935 | -296.867 | -29.978 | -2.416 | -0.43 | 0 | 0.103 | 0.122 | 0.116 |
| 4.054999999999936 | -297.762 | -30.073 | -2.425 | -0.432 | -0.001 | 0.103 | 0.122 | 0.116 |
| 4.059999999999935 | -298.657 | -30.168 | -2.434 | -0.435 | -0.002 | 0.103 | 0.122 | 0.116 |
| 4.064999999999936 | -299.554 | -30.263 | -2.443 | -0.437 | -0.002 | 0.103 | 0.122 | 0.116 |
| 4.069999999999935 | -300.452 | -30.358 | -2.453 | -0.439 | -0.003 | 0.103 | 0.122 | 0.116 |
| 4.074999999999935 | -301.352 | -30.454 | -2.462 | -0.442 | -0.004 | 0.103 | 0.122 | 0.117 |
| 4.079999999999935 | -302.253 | -30.55 | -2.471 | -0.444 | -0.004 | 0.102 | 0.122 | 0.117 |
| 4.084999999999935 | -303.155 | -30.645 | -2.48 | -0.447 | -0.005 | 0.102 | 0.122 | 0.117 |
| 4.089999999999935 | -304.059 | -30.741 | -2.489 | -0.449 | -0.006 | 0.102 | 0.122 | 0.117 |
| 4.094999999999935 | -304.964 | -30.837 | -2.498 | -0.451 | -0.006 | 0.102 | 0.122 | 0.117 |
| 4.099999999999934 | -305.87 | -30.934 | -2.508 | -0.454 | -0.007 | 0.102 | 0.122 | 0.117 |
| 4.104999999999935 | -306.778 | -31.03 | -2.517 | -0.456 | -0.008 | 0.102 | 0.122 | 0.117 |
| 4.109999999999934 | -307.687 | -31.127 | -2.526 | -0.458 | -0.008 | 0.102 | 0.122 | 0.117 |
| 4.114999999999934 | -308.597 | -31.223 | -2.535 | -0.461 | -0.009 | 0.101 | 0.122 | 0.117 |
| 4.119999999999934 | -309.509 | -31.32 | -2.545 | -0.463 | -0.01 | 0.101 | 0.122 | 0.117 |
| 4.124999999999934 | -310.422 | -31.417 | -2.554 | -0.466 | -0.011 | 0.101 | 0.122 | 0.117 |
| 4.129999999999934 | -311.336 | -31.514 | -2.563 | -0.468 | -0.011 | 0.101 | 0.122 | 0.118 |
| 4.134999999999934 | -312.252 | -31.612 | -2.573 | -0.47 | -0.012 | 0.101 | 0.122 | 0.118 |
| 4.139999999999934 | -313.169 | -31.709 | -2.582 | -0.473 | -0.013 | 0.101 | 0.122 | 0.118 |
| 4.144999999999934 | -314.088 | -31.807 | -2.591 | -0.475 | -0.013 | 0.1 | 0.122 | 0.118 |
| 4.149999999999934 | -315.007 | -31.905 | -2.601 | -0.478 | -0.014 | 0.1 | 0.122 | 0.118 |
| 4.154999999999934 | -315.929 | -32.002 | -2.61 | -0.48 | -0.015 | 0.1 | 0.122 | 0.118 |
| 4.159999999999934 | -316.851 | -32.101 | -2.619 | -0.482 | -0.015 | 0.1 | 0.122 | 0.118 |
| 4.164999999999933 | -317.775 | -32.199 | -2.629 | -0.485 | -0.016 | 0.1 | 0.122 | 0.118 |
| 4.169999999999933 | -318.7 | -32.297 | -2.638 | -0.487 | -0.017 | 0.1 | 0.122 | 0.118 |
| 4.174999999999933 | -319.627 | -32.396 | -2.648 | -0.49 | -0.018 | 0.099 | 0.122 | 0.118 |
| 4.179999999999933 | -320.555 | -32.494 | -2.657 | -0.492 | -0.018 | 0.099 | 0.122 | 0.118 |
| 4.184999999999933 | -321.484 | -32.593 | -2.667 | -0.495 | -0.019 | 0.099 | 0.122 | 0.118 |
| 4.189999999999933 | -322.415 | -32.692 | -2.676 | -0.497 | -0.02 | 0.099 | 0.122 | 0.119 |
| 4.194999999999933 | -323.347 | -32.791 | -2.686 | -0.5 | -0.02 | 0.099 | 0.122 | 0.119 |
| 4.199999999999933 | -324.28 | -32.89 | -2.695 | -0.502 | -0.021 | 0.098 | 0.122 | 0.119 |
| 4.204999999999933 | -325.215 | -32.99 | -2.705 | -0.505 | -0.022 | 0.098 | 0.122 | 0.119 |
| 4.209999999999932 | -326.151 | -33.089 | -2.715 | -0.507 | -0.023 | 0.098 | 0.122 | 0.119 |
| 4.214999999999932 | -327.088 | -33.189 | -2.724 | -0.51 | -0.023 | 0.098 | 0.122 | 0.119 |
| 4.219999999999932 | -328.027 | -33.289 | -2.734 | -0.512 | -0.024 | 0.098 | 0.123 | 0.119 |
| 4.224999999999932 | -328.967 | -33.389 | -2.743 | -0.515 | -0.025 | 0.098 | 0.123 | 0.119 |
| 4.229999999999932 | -329.908 | -33.489 | -2.753 | -0.517 | -0.026 | 0.097 | 0.123 | 0.119 |
| 4.234999999999932 | -330.851 | -33.589 | -2.763 | -0.52 | -0.026 | 0.097 | 0.123 | 0.119 |
| 4.239999999999931 | -331.795 | -33.69 | -2.772 | -0.522 | -0.027 | 0.097 | 0.123 | 0.119 |
| 4.244999999999932 | -332.741 | -33.79 | -2.782 | -0.525 | -0.028 | 0.097 | 0.123 | 0.119 |
| 4.249999999999931 | -333.687 | -33.891 | -2.792 | -0.527 | -0.029 | 0.097 | 0.123 | 0.119 |
| 4.254999999999931 | -334.636 | -33.992 | -2.801 | -0.53 | -0.029 | 0.096 | 0.123 | 0.12 |
| 4.259999999999931 | -335.585 | -34.093 | -2.811 | -0.532 | -0.03 | 0.096 | 0.123 | 0.12 |
| 4.264999999999931 | -336.536 | -34.194 | -2.821 | -0.535 | -0.031 | 0.096 | 0.123 | 0.12 |
| 4.269999999999931 | -337.488 | -34.296 | -2.831 | -0.537 | -0.032 | 0.096 | 0.123 | 0.12 |
| 4.274999999999931 | -338.442 | -34.397 | -2.841 | -0.54 | -0.032 | 0.096 | 0.123 | 0.12 |
| 4.27999999999993 | -339.397 | -34.499 | -2.85 | -0.542 | -0.033 | 0.095 | 0.123 | 0.12 |
| 4.284999999999931 | -340.353 | -34.601 | -2.86 | -0.545 | -0.034 | 0.095 | 0.123 | 0.12 |
| 4.28999999999993 | -341.311 | -34.703 | -2.87 | -0.548 | -0.035 | 0.095 | 0.123 | 0.12 |
| 4.294999999999931 | -342.27 | -34.805 | -2.88 | -0.55 | -0.035 | 0.095 | 0.123 | 0.12 |
| 4.29999999999993 | -343.23 | -34.907 | -2.89 | -0.553 | -0.036 | 0.095 | 0.123 | 0.12 |
| 4.30499999999993 | -344.192 | -35.009 | -2.9 | -0.555 | -0.037 | 0.094 | 0.123 | 0.12 |
| 4.30999999999993 | -345.155 | -35.112 | -2.91 | -0.558 | -0.038 | 0.094 | 0.123 | 0.12 |
| 4.31499999999993 | -346.119 | -35.215 | -2.92 | -0.56 | -0.038 | 0.094 | 0.123 | 0.12 |
| 4.31999999999993 | -347.085 | -35.318 | -2.929 | -0.563 | -0.039 | 0.094 | 0.123 | 0.12 |
| 4.32499999999993 | -348.052 | -35.421 | -2.939 | -0.566 | -0.04 | 0.094 | 0.123 | 0.121 |
| 4.32999999999993 | -349.02 | -35.524 | -2.949 | -0.568 | -0.041 | 0.093 | 0.123 | 0.121 |
| 4.33499999999993 | -349.99 | -35.627 | -2.959 | -0.571 | -0.042 | 0.093 | 0.123 | 0.121 |
| 4.33999999999993 | -350.961 | -35.731 | -2.969 | -0.573 | -0.042 | 0.093 | 0.123 | 0.121 |
| 4.34499999999993 | -351.934 | -35.834 | -2.979 | -0.576 | -0.043 | 0.093 | 0.123 | 0.121 |
| 4.34999999999993 | -352.907 | -35.938 | -2.99 | -0.579 | -0.044 | 0.093 | 0.123 | 0.121 |
| 4.354999999999929 | -353.883 | -36.042 | -3 | -0.581 | -0.045 | 0.092 | 0.123 | 0.121 |
| 4.35999999999993 | -354.859 | -36.146 | -3.01 | -0.584 | -0.046 | 0.092 | 0.123 | 0.121 |
| 4.364999999999929 | -355.837 | -36.25 | -3.02 | -0.587 | -0.046 | 0.092 | 0.123 | 0.121 |
| 4.369999999999929 | -356.816 | -36.354 | -3.03 | -0.589 | -0.047 | 0.092 | 0.123 | 0.121 |
| 4.374999999999929 | -357.797 | -36.459 | -3.04 | -0.592 | -0.048 | 0.092 | 0.122 | 0.121 |
| 4.379999999999928 | -358.779 | -36.564 | -3.05 | -0.595 | -0.049 | 0.091 | 0.122 | 0.121 |
| 4.384999999999929 | -359.762 | -36.668 | -3.06 | -0.597 | -0.05 | 0.091 | 0.122 | 0.121 |
| 4.389999999999928 | -360.747 | -36.773 | -3.071 | -0.6 | -0.05 | 0.091 | 0.122 | 0.121 |
| 4.394999999999928 | -361.733 | -36.878 | -3.081 | -0.603 | -0.051 | 0.091 | 0.122 | 0.122 |
| 4.399999999999928 | -362.72 | -36.984 | -3.091 | -0.605 | -0.052 | 0.09 | 0.122 | 0.122 |
| 4.404999999999928 | -363.709 | -37.089 | -3.101 | -0.608 | -0.053 | 0.09 | 0.122 | 0.122 |
| 4.409999999999928 | -364.699 | -37.195 | -3.111 | -0.611 | -0.054 | 0.09 | 0.122 | 0.122 |
| 4.414999999999928 | -365.69 | -37.3 | -3.122 | -0.613 | -0.054 | 0.09 | 0.122 | 0.122 |
| 4.419999999999927 | -366.683 | -37.406 | -3.132 | -0.616 | -0.055 | 0.09 | 0.122 | 0.122 |
| 4.424999999999928 | -367.677 | -37.512 | -3.142 | -0.619 | -0.056 | 0.089 | 0.122 | 0.122 |
| 4.429999999999927 | -368.672 | -37.618 | -3.153 | -0.622 | -0.057 | 0.089 | 0.122 | 0.122 |
| 4.434999999999927 | -369.669 | -37.725 | -3.163 | -0.624 | -0.058 | 0.089 | 0.122 | 0.122 |
| 4.439999999999927 | -370.667 | -37.831 | -3.173 | -0.627 | -0.059 | 0.089 | 0.122 | 0.122 |
| 4.444999999999927 | -371.667 | -37.938 | -3.184 | -0.63 | -0.059 | 0.088 | 0.122 | 0.122 |
| 4.449999999999927 | -372.667 | -38.045 | -3.194 | -0.632 | -0.06 | 0.088 | 0.122 | 0.122 |
| 4.454999999999927 | -373.67 | -38.151 | -3.204 | -0.635 | -0.061 | 0.088 | 0.122 | 0.122 |
| 4.459999999999927 | -374.673 | -38.259 | -3.215 | -0.638 | -0.062 | 0.088 | 0.122 | 0.122 |
| 4.464999999999927 | -375.678 | -38.366 | -3.225 | -0.641 | -0.063 | 0.087 | 0.122 | 0.122 |
| 4.469999999999926 | -376.684 | -38.473 | -3.236 | -0.643 | -0.064 | 0.087 | 0.122 | 0.122 |
| 4.474999999999926 | -377.692 | -38.581 | -3.246 | -0.646 | -0.064 | 0.087 | 0.122 | 0.123 |
| 4.479999999999926 | -378.701 | -38.688 | -3.257 | -0.649 | -0.065 | 0.087 | 0.122 | 0.123 |
| 4.484999999999926 | -379.711 | -38.796 | -3.267 | -0.652 | -0.066 | 0.086 | 0.122 | 0.123 |
| 4.489999999999926 | -380.723 | -38.904 | -3.278 | -0.655 | -0.067 | 0.086 | 0.122 | 0.123 |
| 4.494999999999926 | -381.736 | -39.012 | -3.288 | -0.657 | -0.068 | 0.086 | 0.122 | 0.123 |
| 4.499999999999926 | -382.75 | -39.12 | -3.299 | -0.66 | -0.069 | 0.086 | 0.122 | 0.123 |
| 4.504999999999926 | -383.766 | -39.229 | -3.309 | -0.663 | -0.07 | 0.086 | 0.122 | 0.123 |
| 4.509999999999926 | -384.783 | -39.337 | -3.32 | -0.666 | -0.07 | 0.085 | 0.122 | 0.123 |
| 4.514999999999926 | -385.801 | -39.446 | -3.33 | -0.669 | -0.071 | 0.085 | 0.122 | 0.123 |
| 4.519999999999925 | -386.821 | -39.555 | -3.341 | -0.671 | -0.072 | 0.085 | 0.122 | 0.123 |
| 4.524999999999926 | -387.842 | -39.664 | -3.352 | -0.674 | -0.073 | 0.085 | 0.122 | 0.123 |
| 4.529999999999925 | -388.864 | -39.773 | -3.362 | -0.677 | -0.074 | 0.084 | 0.122 | 0.123 |
| 4.534999999999925 | -389.888 | -39.882 | -3.373 | -0.68 | -0.075 | 0.084 | 0.122 | 0.123 |
| 4.539999999999925 | -390.913 | -39.992 | -3.384 | -0.683 | -0.076 | 0.084 | 0.122 | 0.123 |
| 4.544999999999925 | -391.94 | -40.101 | -3.394 | -0.686 | -0.076 | 0.084 | 0.122 | 0.123 |
| 4.549999999999925 | -392.967 | -40.211 | -3.405 | -0.688 | -0.077 | 0.083 | 0.122 | 0.123 |
| 4.554999999999925 | -393.997 | -40.321 | -3.416 | -0.691 | -0.078 | 0.083 | 0.122 | 0.123 |
| 4.559999999999924 | -395.027 | -40.431 | -3.427 | -0.694 | -0.079 | 0.083 | 0.122 | 0.124 |
| 4.564999999999925 | -396.059 | -40.541 | -3.437 | -0.697 | -0.08 | 0.083 | 0.122 | 0.124 |
| 4.569999999999924 | -397.092 | -40.652 | -3.448 | -0.7 | -0.081 | 0.082 | 0.122 | 0.124 |
| 4.574999999999924 | -398.127 | -40.762 | -3.459 | -0.703 | -0.082 | 0.082 | 0.122 | 0.124 |
| 4.579999999999924 | -399.163 | -40.873 | -3.47 | -0.706 | -0.083 | 0.082 | 0.122 | 0.124 |
| 4.584999999999924 | -400.2 | -40.984 | -3.481 | -0.708 | -0.084 | 0.081 | 0.122 | 0.124 |
| 4.589999999999924 | -401.239 | -41.095 | -3.491 | -0.711 | -0.084 | 0.081 | 0.122 | 0.124 |
| 4.594999999999924 | -402.279 | -41.206 | -3.502 | -0.714 | -0.085 | 0.081 | 0.122 | 0.124 |
| 4.599999999999924 | -403.32 | -41.317 | -3.513 | -0.717 | -0.086 | 0.081 | 0.122 | 0.124 |
| 4.604999999999924 | -404.363 | -41.428 | -3.524 | -0.72 | -0.087 | 0.08 | 0.121 | 0.124 |
| 4.609999999999924 | -405.407 | -41.54 | -3.535 | -0.723 | -0.088 | 0.08 | 0.121 | 0.124 |
| 4.614999999999924 | -406.452 | -41.652 | -3.546 | -0.726 | -0.089 | 0.08 | 0.121 | 0.124 |
| 4.619999999999924 | -407.499 | -41.764 | -3.557 | -0.729 | -0.09 | 0.08 | 0.121 | 0.124 |
| 4.624999999999924 | -408.547 | -41.876 | -3.568 | -0.732 | -0.091 | 0.079 | 0.121 | 0.124 |
| 4.629999999999923 | -409.596 | -41.988 | -3.579 | -0.735 | -0.092 | 0.079 | 0.121 | 0.124 |
| 4.634999999999923 | -410.647 | -42.1 | -3.59 | -0.737 | -0.093 | 0.079 | 0.121 | 0.124 |
| 4.639999999999923 | -411.699 | -42.213 | -3.601 | -0.74 | -0.093 | 0.079 | 0.121 | 0.124 |
| 4.644999999999923 | -412.753 | -42.325 | -3.612 | -0.743 | -0.094 | 0.078 | 0.121 | 0.124 |
| 4.649999999999923 | -413.807 | -42.438 | -3.623 | -0.746 | -0.095 | 0.078 | 0.121 | 0.124 |
| 4.654999999999923 | -414.864 | -42.551 | -3.634 | -0.749 | -0.096 | 0.078 | 0.121 | 0.125 |
| 4.659999999999923 | -415.921 | -42.664 | -3.645 | -0.752 | -0.097 | 0.077 | 0.121 | 0.125 |
| 4.664999999999923 | -416.98 | -42.777 | -3.656 | -0.755 | -0.098 | 0.077 | 0.121 | 0.125 |
| 4.669999999999923 | -418.04 | -42.89 | -3.667 | -0.758 | -0.099 | 0.077 | 0.121 | 0.125 |
| 4.674999999999922 | -419.102 | -43.004 | -3.678 | -0.761 | -0.1 | 0.077 | 0.121 | 0.125 |
| 4.679999999999922 | -420.165 | -43.118 | -3.689 | -0.764 | -0.101 | 0.076 | 0.121 | 0.125 |
| 4.684999999999922 | -421.229 | -43.231 | -3.701 | -0.767 | -0.102 | 0.076 | 0.121 | 0.125 |
| 4.689999999999922 | -422.295 | -43.345 | -3.712 | -0.77 | -0.103 | 0.076 | 0.121 | 0.125 |
| 4.694999999999922 | -423.362 | -43.459 | -3.723 | -0.773 | -0.104 | 0.075 | 0.121 | 0.125 |
| 4.699999999999922 | -424.43 | -43.574 | -3.734 | -0.776 | -0.105 | 0.075 | 0.121 | 0.125 |
| 4.704999999999922 | -425.5 | -43.688 | -3.745 | -0.779 | -0.106 | 0.075 | 0.121 | 0.125 |
| 4.709999999999921 | -426.571 | -43.803 | -3.757 | -0.782 | -0.107 | 0.075 | 0.121 | 0.125 |
| 4.714999999999922 | -427.643 | -43.917 | -3.768 | -0.785 | -0.107 | 0.074 | 0.121 | 0.125 |
| 4.719999999999921 | -428.717 | -44.032 | -3.779 | -0.788 | -0.108 | 0.074 | 0.121 | 0.125 |
| 4.724999999999921 | -429.792 | -44.147 | -3.791 | -0.791 | -0.109 | 0.074 | 0.121 | 0.125 |
| 4.729999999999921 | -430.868 | -44.262 | -3.802 | -0.794 | -0.11 | 0.073 | 0.12 | 0.125 |
| 4.734999999999921 | -431.946 | -44.378 | -3.813 | -0.797 | -0.111 | 0.073 | 0.12 | 0.125 |
| 4.73999999999992 | -433.025 | -44.493 | -3.825 | -0.8 | -0.112 | 0.073 | 0.12 | 0.125 |
| 4.744999999999921 | -434.106 | -44.609 | -3.836 | -0.803 | -0.113 | 0.073 | 0.12 | 0.125 |
| 4.74999999999992 | -435.187 | -44.725 | -3.847 | -0.806 | -0.114 | 0.072 | 0.12 | 0.125 |
| 4.754999999999921 | -436.271 | -44.84 | -3.859 | -0.809 | -0.115 | 0.072 | 0.12 | 0.125 |
| 4.75999999999992 | -437.355 | -44.957 | -3.87 | -0.813 | -0.116 | 0.072 | 0.12 | 0.126 |
| 4.764999999999921 | -438.441 | -45.073 | -3.882 | -0.816 | -0.117 | 0.071 | 0.12 | 0.126 |
| 4.76999999999992 | -439.528 | -45.189 | -3.893 | -0.819 | -0.118 | 0.071 | 0.12 | 0.126 |
| 4.77499999999992 | -440.617 | -45.306 | -3.904 | -0.822 | -0.119 | 0.071 | 0.12 | 0.126 |
| 4.77999999999992 | -441.707 | -45.422 | -3.916 | -0.825 | -0.12 | 0.071 | 0.12 | 0.126 |
| 4.78499999999992 | -442.798 | -45.539 | -3.927 | -0.828 | -0.121 | 0.07 | 0.12 | 0.126 |
| 4.78999999999992 | -443.891 | -45.656 | -3.939 | -0.831 | -0.122 | 0.07 | 0.12 | 0.126 |
| 4.79499999999992 | -444.985 | -45.773 | -3.95 | -0.834 | -0.123 | 0.07 | 0.12 | 0.126 |
| 4.79999999999992 | -446.08 | -45.89 | -3.962 | -0.837 | -0.124 | 0.069 | 0.12 | 0.126 |
| 4.80499999999992 | -447.177 | -46.008 | -3.974 | -0.84 | -0.125 | 0.069 | 0.12 | 0.126 |
| 4.80999999999992 | -448.275 | -46.125 | -3.985 | -0.843 | -0.126 | 0.069 | 0.12 | 0.126 |
| 4.81499999999992 | -449.374 | -46.243 | -3.997 | -0.847 | -0.127 | 0.068 | 0.12 | 0.126 |
| 4.819999999999919 | -450.475 | -46.361 | -4.008 | -0.85 | -0.128 | 0.068 | 0.119 | 0.126 |
| 4.824999999999919 | -451.577 | -46.479 | -4.02 | -0.853 | -0.129 | 0.068 | 0.119 | 0.126 |
| 4.829999999999919 | -452.68 | -46.597 | -4.032 | -0.856 | -0.13 | 0.067 | 0.119 | 0.126 |
| 4.834999999999919 | -453.785 | -46.715 | -4.043 | -0.859 | -0.131 | 0.067 | 0.119 | 0.126 |
| 4.839999999999919 | -454.891 | -46.834 | -4.055 | -0.862 | -0.132 | 0.067 | 0.119 | 0.126 |
| 4.844999999999919 | -455.999 | -46.952 | -4.067 | -0.865 | -0.133 | 0.067 | 0.119 | 0.126 |
| 4.849999999999919 | -457.107 | -47.071 | -4.078 | -0.869 | -0.134 | 0.066 | 0.119 | 0.126 |
| 4.854999999999919 | -458.218 | -47.19 | -4.09 | -0.872 | -0.135 | 0.066 | 0.119 | 0.126 |
| 4.859999999999919 | -459.329 | -47.309 | -4.102 | -0.875 | -0.136 | 0.066 | 0.119 | 0.126 |
| 4.864999999999918 | -460.442 | -47.428 | -4.114 | -0.878 | -0.137 | 0.065 | 0.119 | 0.126 |
| 4.869999999999918 | -461.556 | -47.548 | -4.125 | -0.881 | -0.138 | 0.065 | 0.119 | 0.126 |
| 4.874999999999918 | -462.672 | -47.667 | -4.137 | -0.884 | -0.139 | 0.065 | 0.119 | 0.126 |
| 4.879999999999918 | -463.789 | -47.787 | -4.149 | -0.888 | -0.14 | 0.064 | 0.119 | 0.126 |
| 4.884999999999918 | -464.907 | -47.907 | -4.161 | -0.891 | -0.141 | 0.064 | 0.119 | 0.126 |
| 4.889999999999918 | -466.027 | -48.027 | -4.173 | -0.894 | -0.142 | 0.064 | 0.119 | 0.127 |
| 4.894999999999918 | -467.148 | -48.147 | -4.185 | -0.897 | -0.143 | 0.063 | 0.119 | 0.127 |
| 4.899999999999918 | -468.27 | -48.267 | -4.196 | -0.9 | -0.144 | 0.063 | 0.118 | 0.127 |
| 4.904999999999918 | -469.394 | -48.387 | -4.208 | -0.904 | -0.145 | 0.063 | 0.118 | 0.127 |
| 4.909999999999917 | -470.519 | -48.508 | -4.22 | -0.907 | -0.146 | 0.062 | 0.118 | 0.127 |
| 4.914999999999917 | -471.645 | -48.629 | -4.232 | -0.91 | -0.147 | 0.062 | 0.118 | 0.127 |
| 4.919999999999917 | -472.773 | -48.75 | -4.244 | -0.913 | -0.148 | 0.062 | 0.118 | 0.127 |
| 4.924999999999917 | -473.902 | -48.871 | -4.256 | -0.917 | -0.149 | 0.061 | 0.118 | 0.127 |
| 4.929999999999917 | -475.032 | -48.992 | -4.268 | -0.92 | -0.15 | 0.061 | 0.118 | 0.127 |
| 4.934999999999917 | -476.164 | -49.113 | -4.28 | -0.923 | -0.151 | 0.061 | 0.118 | 0.127 |
| 4.939999999999916 | -477.297 | -49.235 | -4.292 | -0.926 | -0.152 | 0.06 | 0.118 | 0.127 |
| 4.944999999999917 | -478.432 | -49.356 | -4.304 | -0.93 | -0.153 | 0.06 | 0.118 | 0.127 |
| 4.949999999999916 | -479.567 | -49.478 | -4.316 | -0.933 | -0.154 | 0.06 | 0.118 | 0.127 |
| 4.954999999999917 | -480.705 | -49.6 | -4.328 | -0.936 | -0.155 | 0.059 | 0.118 | 0.127 |
| 4.959999999999916 | -481.843 | -49.722 | -4.34 | -0.939 | -0.157 | 0.059 | 0.118 | 0.127 |
| 4.964999999999916 | -482.983 | -49.844 | -4.352 | -0.943 | -0.158 | 0.059 | 0.118 | 0.127 |
| 4.969999999999916 | -484.124 | -49.966 | -4.365 | -0.946 | -0.159 | 0.058 | 0.117 | 0.127 |
| 4.974999999999916 | -485.267 | -50.089 | -4.377 | -0.949 | -0.16 | 0.058 | 0.117 | 0.127 |
| 4.979999999999916 | -486.411 | -50.212 | -4.389 | -0.953 | -0.161 | 0.058 | 0.117 | 0.127 |
| 4.984999999999916 | -487.556 | -50.334 | -4.401 | -0.956 | -0.162 | 0.057 | 0.117 | 0.127 |
| 4.989999999999915 | -488.703 | -50.457 | -4.413 | -0.959 | -0.163 | 0.057 | 0.117 | 0.127 |
| 4.994999999999916 | -489.851 | -50.58 | -4.425 | -0.963 | -0.164 | 0.057 | 0.117 | 0.127 |
| 4.999999999999915 | -491 | -50.704 | -4.438 | -0.966 | -0.165 | 0.056 | 0.117 | 0.127 |
| 5.004999999999916 | -492.151 | -50.827 | -4.45 | -0.969 | -0.166 | 0.056 | 0.117 | 0.127 |
| 5.009999999999915 | -493.303 | -50.951 | -4.462 | -0.972 | -0.167 | 0.056 | 0.117 | 0.127 |
| 5.014999999999915 | -494.456 | -51.074 | -4.474 | -0.976 | -0.168 | 0.055 | 0.117 | 0.127 |
| 5.019999999999915 | -495.611 | -51.198 | -4.487 | -0.979 | -0.169 | 0.055 | 0.117 | 0.127 |
| 5.024999999999915 | -496.767 | -51.322 | -4.499 | -0.982 | -0.17 | 0.054 | 0.117 | 0.127 |
| 5.029999999999915 | -497.924 | -51.446 | -4.511 | -0.986 | -0.172 | 0.054 | 0.117 | 0.127 |
| 5.034999999999915 | -499.083 | -51.571 | -4.524 | -0.989 | -0.173 | 0.054 | 0.116 | 0.127 |
| 5.039999999999914 | -500.243 | -51.695 | -4.536 | -0.993 | -0.174 | 0.053 | 0.116 | 0.127 |
| 5.044999999999915 | -501.405 | -51.82 | -4.548 | -0.996 | -0.175 | 0.053 | 0.116 | 0.127 |
| 5.049999999999914 | -502.567 | -51.945 | -4.561 | -0.999 | -0.176 | 0.053 | 0.116 | 0.127 |
| 5.054999999999914 | -503.732 | -52.069 | -4.573 | -1.003 | -0.177 | 0.052 | 0.116 | 0.127 |
| 5.059999999999914 | -504.897 | -52.195 | -4.585 | -1.006 | -0.178 | 0.052 | 0.116 | 0.127 |
| 5.064999999999914 | -506.064 | -52.32 | -4.598 | -1.009 | -0.179 | 0.052 | 0.116 | 0.128 |
| 5.069999999999914 | -507.232 | -52.445 | -4.61 | -1.013 | -0.18 | 0.051 | 0.116 | 0.128 |
| 5.074999999999914 | -508.402 | -52.571 | -4.623 | -1.016 | -0.181 | 0.051 | 0.116 | 0.128 |
| 5.079999999999914 | -509.573 | -52.696 | -4.635 | -1.02 | -0.182 | 0.051 | 0.116 | 0.128 |
| 5.084999999999914 | -510.745 | -52.822 | -4.648 | -1.023 | -0.184 | 0.05 | 0.116 | 0.128 |
| 5.089999999999914 | -511.919 | -52.948 | -4.66 | -1.026 | -0.185 | 0.05 | 0.115 | 0.128 |
| 5.094999999999914 | -513.094 | -53.074 | -4.673 | -1.03 | -0.186 | 0.049 | 0.115 | 0.128 |
| 5.099999999999913 | -514.27 | -53.2 | -4.685 | -1.033 | -0.187 | 0.049 | 0.115 | 0.128 |
| 5.104999999999913 | -515.448 | -53.327 | -4.698 | -1.037 | -0.188 | 0.049 | 0.115 | 0.128 |
| 5.109999999999913 | -516.627 | -53.453 | -4.711 | -1.04 | -0.189 | 0.048 | 0.115 | 0.128 |
| 5.114999999999913 | -517.807 | -53.58 | -4.723 | -1.044 | -0.19 | 0.048 | 0.115 | 0.128 |
| 5.119999999999913 | -518.989 | -53.707 | -4.736 | -1.047 | -0.191 | 0.048 | 0.115 | 0.128 |
| 5.124999999999913 | -520.172 | -53.834 | -4.748 | -1.05 | -0.193 | 0.047 | 0.115 | 0.128 |
| 5.129999999999913 | -521.356 | -53.961 | -4.761 | -1.054 | -0.194 | 0.047 | 0.115 | 0.128 |
| 5.134999999999913 | -522.542 | -54.088 | -4.774 | -1.057 | -0.195 | 0.046 | 0.115 | 0.128 |
| 5.139999999999913 | -523.729 | -54.216 | -4.786 | -1.061 | -0.196 | 0.046 | 0.115 | 0.128 |
| 5.144999999999913 | -524.918 | -54.343 | -4.799 | -1.064 | -0.197 | 0.046 | 0.114 | 0.128 |
| 5.149999999999912 | -526.107 | -54.471 | -4.812 | -1.068 | -0.198 | 0.045 | 0.114 | 0.128 |
| 5.154999999999912 | -527.299 | -54.599 | -4.824 | -1.071 | -0.199 | 0.045 | 0.114 | 0.128 |
| 5.159999999999912 | -528.491 | -54.727 | -4.837 | -1.075 | -0.2 | 0.045 | 0.114 | 0.128 |
| 5.164999999999912 | -529.685 | -54.855 | -4.85 | -1.078 | -0.202 | 0.044 | 0.114 | 0.128 |
| 5.169999999999912 | -530.88 | -54.984 | -4.863 | -1.082 | -0.203 | 0.044 | 0.114 | 0.128 |
| 5.174999999999912 | -532.077 | -55.112 | -4.876 | -1.085 | -0.204 | 0.043 | 0.114 | 0.128 |
| 5.179999999999912 | -533.275 | -55.241 | -4.888 | -1.089 | -0.205 | 0.043 | 0.114 | 0.128 |
| 5.184999999999912 | -534.474 | -55.37 | -4.901 | -1.092 | -0.206 | 0.043 | 0.114 | 0.128 |
| 5.189999999999912 | -535.675 | -55.499 | -4.914 | -1.096 | -0.207 | 0.042 | 0.114 | 0.128 |
| 5.194999999999911 | -536.877 | -55.628 | -4.927 | -1.099 | -0.209 | 0.042 | 0.113 | 0.128 |
| 5.199999999999911 | -538.08 | -55.757 | -4.94 | -1.103 | -0.21 | 0.042 | 0.113 | 0.128 |
| 5.204999999999911 | -539.285 | -55.886 | -4.953 | -1.106 | -0.211 | 0.041 | 0.113 | 0.128 |
| 5.209999999999911 | -540.491 | -56.016 | -4.966 | -1.11 | -0.212 | 0.041 | 0.113 | 0.128 |
| 5.214999999999911 | -541.698 | -56.146 | -4.979 | -1.113 | -0.213 | 0.04 | 0.113 | 0.128 |
| 5.219999999999911 | -542.907 | -56.276 | -4.991 | -1.117 | -0.214 | 0.04 | 0.113 | 0.128 |
| 5.224999999999911 | -544.117 | -56.406 | -5.004 | -1.121 | -0.215 | 0.04 | 0.113 | 0.128 |
| 5.229999999999911 | -545.328 | -56.536 | -5.017 | -1.124 | -0.217 | 0.039 | 0.113 | 0.128 |
| 5.234999999999911 | -546.541 | -56.666 | -5.03 | -1.128 | -0.218 | 0.039 | 0.113 | 0.128 |
| 5.23999999999991 | -547.755 | -56.797 | -5.043 | -1.131 | -0.219 | 0.038 | 0.113 | 0.128 |
| 5.24499999999991 | -548.971 | -56.927 | -5.056 | -1.135 | -0.22 | 0.038 | 0.112 | 0.128 |
| 5.24999999999991 | -550.187 | -57.058 | -5.07 | -1.138 | -0.221 | 0.038 | 0.112 | 0.128 |
| 5.25499999999991 | -551.406 | -57.189 | -5.083 | -1.142 | -0.223 | 0.037 | 0.112 | 0.128 |
| 5.25999999999991 | -552.625 | -57.32 | -5.096 | -1.146 | -0.224 | 0.037 | 0.112 | 0.128 |
| 5.26499999999991 | -553.846 | -57.451 | -5.109 | -1.149 | -0.225 | 0.036 | 0.112 | 0.128 |
| 5.26999999999991 | -555.068 | -57.582 | -5.122 | -1.153 | -0.226 | 0.036 | 0.112 | 0.128 |
| 5.27499999999991 | -556.292 | -57.714 | -5.135 | -1.156 | -0.227 | 0.036 | 0.112 | 0.128 |
| 5.27999999999991 | -557.517 | -57.846 | -5.148 | -1.16 | -0.228 | 0.035 | 0.112 | 0.128 |
| 5.28499999999991 | -558.743 | -57.977 | -5.161 | -1.164 | -0.23 | 0.035 | 0.112 | 0.128 |
| 5.28999999999991 | -559.971 | -58.109 | -5.175 | -1.167 | -0.231 | 0.034 | 0.111 | 0.128 |
| 5.294999999999909 | -561.2 | -58.241 | -5.188 | -1.171 | -0.232 | 0.034 | 0.111 | 0.128 |
| 5.29999999999991 | -562.43 | -58.374 | -5.201 | -1.175 | -0.233 | 0.034 | 0.111 | 0.128 |
| 5.304999999999909 | -563.662 | -58.506 | -5.214 | -1.178 | -0.234 | 0.033 | 0.111 | 0.128 |
| 5.309999999999909 | -564.895 | -58.639 | -5.227 | -1.182 | -0.236 | 0.033 | 0.111 | 0.128 |
| 5.314999999999909 | -566.129 | -58.771 | -5.241 | -1.185 | -0.237 | 0.032 | 0.111 | 0.128 |
| 5.319999999999909 | -567.365 | -58.904 | -5.254 | -1.189 | -0.238 | 0.032 | 0.111 | 0.128 |
| 5.324999999999909 | -568.602 | -59.037 | -5.267 | -1.193 | -0.239 | 0.031 | 0.111 | 0.128 |
| 5.329999999999909 | -569.84 | -59.17 | -5.281 | -1.196 | -0.241 | 0.031 | 0.111 | 0.128 |
| 5.334999999999908 | -571.08 | -59.304 | -5.294 | -1.2 | -0.242 | 0.031 | 0.11 | 0.128 |
| 5.339999999999908 | -572.321 | -59.437 | -5.307 | -1.204 | -0.243 | 0.03 | 0.11 | 0.128 |
| 5.344999999999908 | -573.564 | -59.571 | -5.321 | -1.207 | -0.244 | 0.03 | 0.11 | 0.128 |
| 5.349999999999908 | -574.807 | -59.705 | -5.334 | -1.211 | -0.245 | 0.029 | 0.11 | 0.128 |
| 5.354999999999908 | -576.053 | -59.838 | -5.347 | -1.215 | -0.247 | 0.029 | 0.11 | 0.128 |
| 5.359999999999908 | -577.299 | -59.973 | -5.361 | -1.219 | -0.248 | 0.029 | 0.11 | 0.128 |
| 5.364999999999908 | -578.547 | -60.107 | -5.374 | -1.222 | -0.249 | 0.028 | 0.11 | 0.128 |
| 5.369999999999908 | -579.796 | -60.241 | -5.388 | -1.226 | -0.25 | 0.028 | 0.11 | 0.128 |
| 5.374999999999908 | -581.047 | -60.376 | -5.401 | -1.23 | -0.252 | 0.027 | 0.109 | 0.128 |
| 5.379999999999907 | -582.299 | -60.51 | -5.415 | -1.233 | -0.253 | 0.027 | 0.109 | 0.128 |
| 5.384999999999907 | -583.552 | -60.645 | -5.428 | -1.237 | -0.254 | 0.026 | 0.109 | 0.128 |
| 5.389999999999907 | -584.807 | -60.78 | -5.442 | -1.241 | -0.255 | 0.026 | 0.109 | 0.128 |
| 5.394999999999907 | -586.063 | -60.915 | -5.455 | -1.245 | -0.256 | 0.026 | 0.109 | 0.128 |
| 5.399999999999907 | -587.32 | -61.05 | -5.469 | -1.248 | -0.258 | 0.025 | 0.109 | 0.128 |
| 5.404999999999907 | -588.579 | -61.186 | -5.482 | -1.252 | -0.259 | 0.025 | 0.109 | 0.128 |
| 5.409999999999906 | -589.839 | -61.321 | -5.496 | -1.256 | -0.26 | 0.024 | 0.109 | 0.128 |
| 5.414999999999907 | -591.1 | -61.457 | -5.509 | -1.26 | -0.261 | 0.024 | 0.108 | 0.128 |
| 5.419999999999906 | -592.363 | -61.593 | -5.523 | -1.263 | -0.263 | 0.023 | 0.108 | 0.128 |
| 5.424999999999907 | -593.627 | -61.729 | -5.537 | -1.267 | -0.264 | 0.023 | 0.108 | 0.128 |
| 5.429999999999906 | -594.892 | -61.865 | -5.55 | -1.271 | -0.265 | 0.023 | 0.108 | 0.128 |
| 5.434999999999906 | -596.159 | -62.001 | -5.564 | -1.275 | -0.266 | 0.022 | 0.108 | 0.128 |
| 5.439999999999906 | -597.427 | -62.138 | -5.578 | -1.278 | -0.268 | 0.022 | 0.108 | 0.128 |
| 5.444999999999906 | -598.697 | -62.274 | -5.591 | -1.282 | -0.269 | 0.021 | 0.108 | 0.128 |
| 5.449999999999905 | -599.967 | -62.411 | -5.605 | -1.286 | -0.27 | 0.021 | 0.108 | 0.128 |
| 5.454999999999906 | -601.24 | -62.548 | -5.619 | -1.29 | -0.272 | 0.02 | 0.107 | 0.128 |
| 5.459999999999905 | -602.513 | -62.685 | -5.633 | -1.294 | -0.273 | 0.02 | 0.107 | 0.128 |
| 5.464999999999906 | -603.788 | -62.822 | -5.646 | -1.297 | -0.274 | 0.019 | 0.107 | 0.128 |
| 5.469999999999905 | -605.064 | -62.96 | -5.66 | -1.301 | -0.275 | 0.019 | 0.107 | 0.128 |
| 5.474999999999905 | -606.342 | -63.097 | -5.674 | -1.305 | -0.277 | 0.019 | 0.107 | 0.128 |
| 5.479999999999905 | -607.621 | -63.235 | -5.688 | -1.309 | -0.278 | 0.018 | 0.107 | 0.128 |
| 5.484999999999905 | -608.901 | -63.373 | -5.702 | -1.313 | -0.279 | 0.018 | 0.107 | 0.128 |
| 5.489999999999905 | -610.183 | -63.511 | -5.715 | -1.317 | -0.28 | 0.017 | 0.107 | 0.128 |
| 5.494999999999905 | -611.466 | -63.649 | -5.729 | -1.32 | -0.282 | 0.017 | 0.106 | 0.128 |
| 5.499999999999904 | -612.75 | -63.787 | -5.743 | -1.324 | -0.283 | 0.016 | 0.106 | 0.128 |
| 5.504999999999905 | -614.036 | -63.925 | -5.757 | -1.328 | -0.284 | 0.016 | 0.106 | 0.128 |
| 5.509999999999904 | -615.323 | -64.064 | -5.771 | -1.332 | -0.286 | 0.015 | 0.106 | 0.128 |
| 5.514999999999905 | -616.611 | -64.203 | -5.785 | -1.336 | -0.287 | 0.015 | 0.106 | 0.128 |
| 5.519999999999904 | -617.901 | -64.342 | -5.799 | -1.34 | -0.288 | 0.014 | 0.106 | 0.128 |
| 5.524999999999904 | -619.192 | -64.481 | -5.813 | -1.344 | -0.29 | 0.014 | 0.106 | 0.128 |
| 5.529999999999904 | -620.484 | -64.62 | -5.827 | -1.347 | -0.291 | 0.014 | 0.105 | 0.128 |
| 5.534999999999904 | -621.778 | -64.759 | -5.841 | -1.351 | -0.292 | 0.013 | 0.105 | 0.128 |
| 5.539999999999904 | -623.073 | -64.899 | -5.855 | -1.355 | -0.293 | 0.013 | 0.105 | 0.128 |
| 5.544999999999904 | -624.37 | -65.038 | -5.869 | -1.359 | -0.295 | 0.012 | 0.105 | 0.128 |
| 5.549999999999904 | -625.667 | -65.178 | -5.883 | -1.363 | -0.296 | 0.012 | 0.105 | 0.128 |
| 5.554999999999904 | -626.967 | -65.318 | -5.897 | -1.367 | -0.297 | 0.011 | 0.105 | 0.128 |
| 5.559999999999904 | -628.267 | -65.458 | -5.911 | -1.371 | -0.299 | 0.011 | 0.105 | 0.128 |
| 5.564999999999904 | -629.569 | -65.598 | -5.925 | -1.375 | -0.3 | 0.01 | 0.104 | 0.128 |
| 5.569999999999903 | -630.872 | -65.738 | -5.939 | -1.379 | -0.301 | 0.01 | 0.104 | 0.128 |
| 5.574999999999903 | -632.177 | -65.879 | -5.953 | -1.383 | -0.303 | 0.009 | 0.104 | 0.128 |
| 5.579999999999903 | -633.483 | -66.02 | -5.967 | -1.386 | -0.304 | 0.009 | 0.104 | 0.128 |
| 5.584999999999903 | -634.79 | -66.16 | -5.982 | -1.39 | -0.305 | 0.008 | 0.104 | 0.128 |
| 5.589999999999903 | -636.099 | -66.301 | -5.996 | -1.394 | -0.307 | 0.008 | 0.104 | 0.128 |
| 5.594999999999903 | -637.409 | -66.442 | -6.01 | -1.398 | -0.308 | 0.008 | 0.104 | 0.128 |
| 5.599999999999903 | -638.72 | -66.584 | -6.024 | -1.402 | -0.309 | 0.007 | 0.103 | 0.128 |
| 5.604999999999903 | -640.033 | -66.725 | -6.038 | -1.406 | -0.311 | 0.007 | 0.103 | 0.128 |
| 5.609999999999903 | -641.347 | -66.867 | -6.053 | -1.41 | -0.312 | 0.006 | 0.103 | 0.128 |
| 5.614999999999902 | -642.662 | -67.008 | -6.067 | -1.414 | -0.313 | 0.006 | 0.103 | 0.128 |
| 5.619999999999902 | -643.979 | -67.15 | -6.081 | -1.418 | -0.315 | 0.005 | 0.103 | 0.128 |
| 5.624999999999902 | -645.297 | -67.292 | -6.096 | -1.422 | -0.316 | 0.005 | 0.103 | 0.128 |
| 5.629999999999902 | -646.616 | -67.434 | -6.11 | -1.426 | -0.317 | 0.004 | 0.103 | 0.128 |
| 5.634999999999902 | -647.937 | -67.577 | -6.124 | -1.43 | -0.319 | 0.004 | 0.102 | 0.128 |
| 5.639999999999902 | -649.259 | -67.719 | -6.139 | -1.434 | -0.32 | 0.003 | 0.102 | 0.128 |
| 5.644999999999902 | -650.583 | -67.862 | -6.153 | -1.438 | -0.321 | 0.003 | 0.102 | 0.128 |
| 5.649999999999902 | -651.907 | -68.005 | -6.167 | -1.442 | -0.323 | 0.002 | 0.102 | 0.128 |
| 5.654999999999902 | -653.234 | -68.147 | -6.182 | -1.446 | -0.324 | 0.002 | 0.102 | 0.128 |
| 5.659999999999901 | -654.561 | -68.291 | -6.196 | -1.45 | -0.325 | 0.001 | 0.102 | 0.128 |
| 5.664999999999901 | -655.89 | -68.434 | -6.211 | -1.454 | -0.327 | 0.001 | 0.102 | 0.128 |
| 5.669999999999901 | -657.22 | -68.577 | -6.225 | -1.458 | -0.328 | 0 | 0.101 | 0.128 |
| 5.674999999999901 | -658.552 | -68.721 | -6.239 | -1.462 | -0.329 | 0 | 0.101 | 0.128 |
| 5.679999999999901 | -659.885 | -68.864 | -6.254 | -1.466 | -0.331 | -0.001 | 0.101 | 0.128 |
| 5.684999999999901 | -661.219 | -69.008 | -6.268 | -1.47 | -0.332 | -0.001 | 0.101 | 0.128 |
| 5.689999999999901 | -662.555 | -69.152 | -6.283 | -1.474 | -0.334 | -0.002 | 0.101 | 0.128 |
| 5.694999999999901 | -663.892 | -69.296 | -6.297 | -1.478 | -0.335 | -0.002 | 0.101 | 0.128 |
| 5.699999999999901 | -665.23 | -69.44 | -6.312 | -1.482 | -0.336 | -0.003 | 0.1 | 0.128 |
| 5.704999999999901 | -666.57 | -69.585 | -6.327 | -1.486 | -0.338 | -0.003 | 0.1 | 0.128 |
| 5.7099999999999 | -667.911 | -69.729 | -6.341 | -1.49 | -0.339 | -0.004 | 0.1 | 0.128 |
| 5.7149999999999 | -669.253 | -69.874 | -6.356 | -1.495 | -0.34 | -0.004 | 0.1 | 0.128 |
| 5.7199999999999 | -670.597 | -70.019 | -6.37 | -1.499 | -0.342 | -0.005 | 0.1 | 0.128 |
| 5.7249999999999 | -671.942 | -70.164 | -6.385 | -1.503 | -0.343 | -0.005 | 0.1 | 0.128 |
| 5.7299999999999 | -673.288 | -70.309 | -6.4 | -1.507 | -0.345 | -0.006 | 0.099 | 0.128 |
| 5.7349999999999 | -674.636 | -70.454 | -6.414 | -1.511 | -0.346 | -0.006 | 0.099 | 0.128 |
| 5.7399999999999 | -675.985 | -70.6 | -6.429 | -1.515 | -0.347 | -0.007 | 0.099 | 0.128 |
| 5.7449999999999 | -677.336 | -70.745 | -6.444 | -1.519 | -0.349 | -0.007 | 0.099 | 0.128 |
| 5.7499999999999 | -678.687 | -70.891 | -6.458 | -1.523 | -0.35 | -0.008 | 0.099 | 0.128 |
| 5.754999999999899 | -680.041 | -71.037 | -6.473 | -1.527 | -0.352 | -0.008 | 0.099 | 0.127 |
| 5.7599999999999 | -681.395 | -71.183 | -6.488 | -1.531 | -0.353 | -0.009 | 0.098 | 0.127 |
| 5.764999999999899 | -682.751 | -71.329 | -6.503 | -1.536 | -0.354 | -0.009 | 0.098 | 0.127 |
| 5.7699999999999 | -684.108 | -71.476 | -6.517 | -1.54 | -0.356 | -0.01 | 0.098 | 0.127 |
| 5.7749999999999 | -685.467 | -71.622 | -6.532 | -1.544 | -0.357 | -0.01 | 0.098 | 0.127 |
| 5.779999999999898 | -686.827 | -71.769 | -6.547 | -1.548 | -0.359 | -0.011 | 0.098 | 0.127 |
| 5.784999999999899 | -688.188 | -71.916 | -6.562 | -1.552 | -0.36 | -0.011 | 0.098 | 0.127 |
| 5.789999999999898 | -689.551 | -72.063 | -6.577 | -1.556 | -0.361 | -0.012 | 0.097 | 0.127 |
| 5.794999999999899 | -690.915 | -72.21 | -6.592 | -1.56 | -0.363 | -0.012 | 0.097 | 0.127 |
| 5.799999999999898 | -692.28 | -72.357 | -6.606 | -1.565 | -0.364 | -0.013 | 0.097 | 0.127 |
| 5.804999999999898 | -693.647 | -72.504 | -6.621 | -1.569 | -0.366 | -0.013 | 0.097 | 0.127 |
| 5.809999999999898 | -695.015 | -72.652 | -6.636 | -1.573 | -0.367 | -0.014 | 0.097 | 0.127 |
| 5.814999999999898 | -696.384 | -72.8 | -6.651 | -1.577 | -0.368 | -0.014 | 0.097 | 0.127 |
| 5.819999999999898 | -697.755 | -72.948 | -6.666 | -1.581 | -0.37 | -0.015 | 0.096 | 0.127 |
| 5.824999999999898 | -699.127 | -73.096 | -6.681 | -1.585 | -0.371 | -0.015 | 0.096 | 0.127 |
| 5.829999999999898 | -700.5 | -73.244 | -6.696 | -1.59 | -0.373 | -0.016 | 0.096 | 0.127 |
| 5.834999999999898 | -701.875 | -73.392 | -6.711 | -1.594 | -0.374 | -0.016 | 0.096 | 0.127 |
| 5.839999999999897 | -703.251 | -73.541 | -6.726 | -1.598 | -0.376 | -0.017 | 0.096 | 0.127 |
| 5.844999999999898 | -704.629 | -73.689 | -6.741 | -1.602 | -0.377 | -0.017 | 0.096 | 0.127 |
| 5.849999999999897 | -706.007 | -73.838 | -6.756 | -1.606 | -0.379 | -0.018 | 0.095 | 0.127 |
| 5.854999999999897 | -707.388 | -73.987 | -6.771 | -1.611 | -0.38 | -0.018 | 0.095 | 0.127 |
| 5.859999999999897 | -708.769 | -74.136 | -6.786 | -1.615 | -0.381 | -0.019 | 0.095 | 0.127 |
| 5.864999999999897 | -710.152 | -74.285 | -6.801 | -1.619 | -0.383 | -0.019 | 0.095 | 0.127 |
| 5.869999999999897 | -711.536 | -74.434 | -6.817 | -1.623 | -0.384 | -0.02 | 0.095 | 0.127 |
| 5.874999999999897 | -712.922 | -74.584 | -6.832 | -1.628 | -0.386 | -0.02 | 0.095 | 0.127 |
| 5.879999999999896 | -714.309 | -74.734 | -6.847 | -1.632 | -0.387 | -0.021 | 0.094 | 0.127 |
| 5.884999999999897 | -715.697 | -74.883 | -6.862 | -1.636 | -0.389 | -0.022 | 0.094 | 0.127 |
| 5.889999999999896 | -717.087 | -75.033 | -6.877 | -1.64 | -0.39 | -0.022 | 0.094 | 0.127 |
| 5.894999999999896 | -718.478 | -75.183 | -6.892 | -1.645 | -0.392 | -0.023 | 0.094 | 0.127 |
| 5.899999999999896 | -719.87 | -75.334 | -6.908 | -1.649 | -0.393 | -0.023 | 0.094 | 0.127 |
| 5.904999999999896 | -721.264 | -75.484 | -6.923 | -1.653 | -0.394 | -0.024 | 0.093 | 0.127 |
| 5.909999999999896 | -722.659 | -75.635 | -6.938 | -1.657 | -0.396 | -0.024 | 0.093 | 0.127 |
| 5.914999999999896 | -724.055 | -75.785 | -6.953 | -1.662 | -0.397 | -0.025 | 0.093 | 0.127 |
| 5.919999999999895 | -725.453 | -75.936 | -6.969 | -1.666 | -0.399 | -0.025 | 0.093 | 0.127 |
| 5.924999999999896 | -726.852 | -76.087 | -6.984 | -1.67 | -0.4 | -0.026 | 0.093 | 0.127 |
| 5.929999999999895 | -728.252 | -76.238 | -6.999 | -1.675 | -0.402 | -0.026 | 0.093 | 0.126 |
| 5.934999999999895 | -729.654 | -76.39 | -7.015 | -1.679 | -0.403 | -0.027 | 0.092 | 0.126 |
| 5.939999999999895 | -731.057 | -76.541 | -7.03 | -1.683 | -0.405 | -0.027 | 0.092 | 0.126 |
| 5.944999999999895 | -732.462 | -76.693 | -7.045 | -1.688 | -0.406 | -0.028 | 0.092 | 0.126 |
| 5.949999999999895 | -733.867 | -76.845 | -7.061 | -1.692 | -0.408 | -0.029 | 0.092 | 0.126 |
| 5.954999999999895 | -735.275 | -76.996 | -7.076 | -1.696 | -0.409 | -0.029 | 0.092 | 0.126 |
| 5.959999999999895 | -736.683 | -77.149 | -7.091 | -1.701 | -0.411 | -0.03 | 0.091 | 0.126 |
| 5.964999999999895 | -738.093 | -77.301 | -7.107 | -1.705 | -0.412 | -0.03 | 0.091 | 0.126 |
| 5.969999999999894 | -739.504 | -77.453 | -7.122 | -1.709 | -0.414 | -0.031 | 0.091 | 0.126 |
| 5.974999999999894 | -740.917 | -77.606 | -7.138 | -1.714 | -0.415 | -0.031 | 0.091 | 0.126 |
| 5.979999999999894 | -742.331 | -77.758 | -7.153 | -1.718 | -0.417 | -0.032 | 0.091 | 0.126 |
| 5.984999999999894 | -743.746 | -77.911 | -7.169 | -1.722 | -0.418 | -0.032 | 0.091 | 0.126 |
| 5.989999999999894 | -745.163 | -78.064 | -7.184 | -1.727 | -0.42 | -0.033 | 0.09 | 0.126 |
| 5.994999999999894 | -746.581 | -78.217 | -7.2 | -1.731 | -0.421 | -0.033 | 0.09 | 0.126 |
| 5.999999999999894 | -748 | -78.37 | -7.215 | -1.735 | -0.423 | -0.034 | 0.09 | 0.126 |
| 6.004999999999894 | -749.421 | -78.524 | -7.231 | -1.74 | -0.424 | -0.035 | 0.09 | 0.126 |
| 6.009999999999894 | -750.843 | -78.677 | -7.247 | -1.744 | -0.426 | -0.035 | 0.09 | 0.126 |
| 6.014999999999894 | -752.266 | -78.831 | -7.262 | -1.749 | -0.427 | -0.036 | 0.089 | 0.126 |
| 6.019999999999894 | -753.691 | -78.985 | -7.278 | -1.753 | -0.429 | -0.036 | 0.089 | 0.126 |
| 6.024999999999894 | -755.117 | -79.139 | -7.293 | -1.757 | -0.43 | -0.037 | 0.089 | 0.126 |
| 6.029999999999894 | -756.544 | -79.293 | -7.309 | -1.762 | -0.432 | -0.037 | 0.089 | 0.126 |
| 6.034999999999894 | -757.973 | -79.447 | -7.325 | -1.766 | -0.433 | -0.038 | 0.089 | 0.126 |
| 6.039999999999893 | -759.403 | -79.602 | -7.34 | -1.771 | -0.435 | -0.039 | 0.088 | 0.126 |
| 6.044999999999893 | -760.835 | -79.756 | -7.356 | -1.775 | -0.436 | -0.039 | 0.088 | 0.126 |
| 6.049999999999893 | -762.267 | -79.911 | -7.372 | -1.779 | -0.438 | -0.04 | 0.088 | 0.126 |
| 6.054999999999893 | -763.702 | -80.066 | -7.387 | -1.784 | -0.439 | -0.04 | 0.088 | 0.126 |
| 6.059999999999893 | -765.137 | -80.221 | -7.403 | -1.788 | -0.441 | -0.041 | 0.088 | 0.125 |
| 6.064999999999893 | -766.574 | -80.376 | -7.419 | -1.793 | -0.442 | -0.041 | 0.087 | 0.125 |
| 6.069999999999893 | -768.012 | -80.532 | -7.435 | -1.797 | -0.444 | -0.042 | 0.087 | 0.125 |
| 6.074999999999893 | -769.452 | -80.687 | -7.451 | -1.802 | -0.445 | -0.042 | 0.087 | 0.125 |
| 6.079999999999892 | -770.893 | -80.843 | -7.466 | -1.806 | -0.447 | -0.043 | 0.087 | 0.125 |
| 6.084999999999892 | -772.335 | -80.999 | -7.482 | -1.81 | -0.449 | -0.044 | 0.087 | 0.125 |
| 6.089999999999892 | -773.779 | -81.155 | -7.498 | -1.815 | -0.45 | -0.044 | 0.086 | 0.125 |
| 6.094999999999892 | -775.224 | -81.311 | -7.514 | -1.819 | -0.452 | -0.045 | 0.086 | 0.125 |
| 6.099999999999892 | -776.67 | -81.467 | -7.53 | -1.824 | -0.453 | -0.045 | 0.086 | 0.125 |
| 6.104999999999892 | -778.118 | -81.623 | -7.546 | -1.828 | -0.455 | -0.046 | 0.086 | 0.125 |
| 6.109999999999892 | -779.567 | -81.78 | -7.562 | -1.833 | -0.456 | -0.047 | 0.086 | 0.125 |
| 6.114999999999892 | -781.017 | -81.937 | -7.578 | -1.837 | -0.458 | -0.047 | 0.085 | 0.125 |
| 6.119999999999892 | -782.469 | -82.094 | -7.593 | -1.842 | -0.459 | -0.048 | 0.085 | 0.125 |
| 6.124999999999892 | -783.922 | -82.251 | -7.609 | -1.846 | -0.461 | -0.048 | 0.085 | 0.125 |
| 6.129999999999892 | -785.376 | -82.408 | -7.625 | -1.851 | -0.462 | -0.049 | 0.085 | 0.125 |
| 6.134999999999891 | -786.832 | -82.565 | -7.641 | -1.855 | -0.464 | -0.049 | 0.085 | 0.125 |
| 6.139999999999891 | -788.289 | -82.723 | -7.657 | -1.86 | -0.466 | -0.05 | 0.084 | 0.125 |
| 6.144999999999891 | -789.748 | -82.88 | -7.673 | -1.864 | -0.467 | -0.051 | 0.084 | 0.125 |
| 6.149999999999891 | -791.207 | -83.038 | -7.69 | -1.869 | -0.469 | -0.051 | 0.084 | 0.125 |
| 6.154999999999891 | -792.669 | -83.196 | -7.706 | -1.874 | -0.47 | -0.052 | 0.084 | 0.125 |
| 6.159999999999891 | -794.131 | -83.354 | -7.722 | -1.878 | -0.472 | -0.052 | 0.084 | 0.125 |
| 6.164999999999891 | -795.595 | -83.512 | -7.738 | -1.883 | -0.473 | -0.053 | 0.083 | 0.124 |
| 6.169999999999891 | -797.06 | -83.67 | -7.754 | -1.887 | -0.475 | -0.054 | 0.083 | 0.124 |
| 6.174999999999891 | -798.527 | -83.829 | -7.77 | -1.892 | -0.477 | -0.054 | 0.083 | 0.124 |
| 6.17999999999989 | -799.995 | -83.988 | -7.786 | -1.896 | -0.478 | -0.055 | 0.083 | 0.124 |
| 6.18499999999989 | -801.464 | -84.146 | -7.802 | -1.901 | -0.48 | -0.055 | 0.082 | 0.124 |
| 6.18999999999989 | -802.935 | -84.305 | -7.819 | -1.905 | -0.481 | -0.056 | 0.082 | 0.124 |
| 6.19499999999989 | -804.407 | -84.464 | -7.835 | -1.91 | -0.483 | -0.056 | 0.082 | 0.124 |
| 6.19999999999989 | -805.88 | -84.624 | -7.851 | -1.915 | -0.485 | -0.057 | 0.082 | 0.124 |
| 6.20499999999989 | -807.355 | -84.783 | -7.867 | -1.919 | -0.486 | -0.058 | 0.082 | 0.124 |
| 6.20999999999989 | -808.831 | -84.943 | -7.883 | -1.924 | -0.488 | -0.058 | 0.081 | 0.124 |
| 6.21499999999989 | -810.308 | -85.102 | -7.9 | -1.928 | -0.489 | -0.059 | 0.081 | 0.124 |
| 6.21999999999989 | -811.787 | -85.262 | -7.916 | -1.933 | -0.491 | -0.059 | 0.081 | 0.124 |
| 6.224999999999889 | -813.267 | -85.422 | -7.932 | -1.938 | -0.493 | -0.06 | 0.081 | 0.124 |
| 6.22999999999989 | -814.748 | -85.582 | -7.949 | -1.942 | -0.494 | -0.061 | 0.081 | 0.124 |
| 6.23499999999989 | -816.231 | -85.743 | -7.965 | -1.947 | -0.496 | -0.061 | 0.08 | 0.124 |
| 6.23999999999989 | -817.715 | -85.903 | -7.981 | -1.951 | -0.497 | -0.062 | 0.08 | 0.124 |
| 6.24499999999989 | -819.201 | -86.064 | -7.998 | -1.956 | -0.499 | -0.063 | 0.08 | 0.124 |
| 6.249999999999888 | -820.687 | -86.225 | -8.014 | -1.961 | -0.501 | -0.063 | 0.08 | 0.124 |
| 6.254999999999889 | -822.176 | -86.385 | -8.03 | -1.965 | -0.502 | -0.064 | 0.079 | 0.124 |
| 6.259999999999888 | -823.665 | -86.547 | -8.047 | -1.97 | -0.504 | -0.064 | 0.079 | 0.123 |
| 6.264999999999889 | -825.156 | -86.708 | -8.063 | -1.975 | -0.505 | -0.065 | 0.079 | 0.123 |
| 6.269999999999888 | -826.648 | -86.869 | -8.08 | -1.979 | -0.507 | -0.066 | 0.079 | 0.123 |
| 6.274999999999888 | -828.142 | -87.031 | -8.096 | -1.984 | -0.509 | -0.066 | 0.079 | 0.123 |
| 6.279999999999888 | -829.637 | -87.192 | -8.113 | -1.989 | -0.51 | -0.067 | 0.078 | 0.123 |
| 6.284999999999888 | -831.133 | -87.354 | -8.129 | -1.993 | -0.512 | -0.067 | 0.078 | 0.123 |
| 6.289999999999888 | -832.631 | -87.516 | -8.146 | -1.998 | -0.514 | -0.068 | 0.078 | 0.123 |
| 6.294999999999888 | -834.13 | -87.678 | -8.162 | -2.003 | -0.515 | -0.069 | 0.078 | 0.123 |
| 6.299999999999887 | -835.63 | -87.84 | -8.179 | -2.007 | -0.517 | -0.069 | 0.077 | 0.123 |
| 6.304999999999888 | -837.132 | -88.003 | -8.195 | -2.012 | -0.518 | -0.07 | 0.077 | 0.123 |
| 6.309999999999887 | -838.635 | -88.165 | -8.212 | -2.017 | -0.52 | -0.07 | 0.077 | 0.123 |
| 6.314999999999888 | -840.139 | -88.328 | -8.228 | -2.021 | -0.522 | -0.071 | 0.077 | 0.123 |
| 6.319999999999887 | -841.645 | -88.491 | -8.245 | -2.026 | -0.523 | -0.072 | 0.077 | 0.123 |
| 6.324999999999887 | -843.152 | -88.654 | -8.262 | -2.031 | -0.525 | -0.072 | 0.076 | 0.123 |
| 6.329999999999887 | -844.66 | -88.817 | -8.278 | -2.036 | -0.527 | -0.073 | 0.076 | 0.123 |
| 6.334999999999887 | -846.17 | -88.98 | -8.295 | -2.04 | -0.528 | -0.074 | 0.076 | 0.123 |
| 6.339999999999887 | -847.681 | -89.144 | -8.312 | -2.045 | -0.53 | -0.074 | 0.076 | 0.123 |
| 6.344999999999887 | -849.194 | -89.307 | -8.328 | -2.05 | -0.532 | -0.075 | 0.075 | 0.122 |
| 6.349999999999886 | -850.707 | -89.471 | -8.345 | -2.055 | -0.533 | -0.075 | 0.075 | 0.122 |
| 6.354999999999887 | -852.223 | -89.635 | -8.362 | -2.059 | -0.535 | -0.076 | 0.075 | 0.122 |
| 6.359999999999886 | -853.739 | -89.799 | -8.379 | -2.064 | -0.537 | -0.077 | 0.075 | 0.122 |
| 6.364999999999886 | -855.257 | -89.963 | -8.395 | -2.069 | -0.538 | -0.077 | 0.074 | 0.122 |
| 6.369999999999886 | -856.776 | -90.128 | -8.412 | -2.074 | -0.54 | -0.078 | 0.074 | 0.122 |
| 6.374999999999886 | -858.297 | -90.292 | -8.429 | -2.078 | -0.542 | -0.079 | 0.074 | 0.122 |
| 6.379999999999886 | -859.819 | -90.457 | -8.446 | -2.083 | -0.543 | -0.079 | 0.074 | 0.122 |
| 6.384999999999886 | -861.342 | -90.622 | -8.463 | -2.088 | -0.545 | -0.08 | 0.074 | 0.122 |
| 6.389999999999885 | -862.867 | -90.787 | -8.479 | -2.093 | -0.547 | -0.081 | 0.073 | 0.122 |
| 6.394999999999886 | -864.393 | -90.952 | -8.496 | -2.097 | -0.548 | -0.081 | 0.073 | 0.122 |
| 6.399999999999885 | -865.92 | -91.117 | -8.513 | -2.102 | -0.55 | -0.082 | 0.073 | 0.122 |
| 6.404999999999885 | -867.449 | -91.282 | -8.53 | -2.107 | -0.552 | -0.082 | 0.073 | 0.122 |
| 6.409999999999885 | -868.979 | -91.448 | -8.547 | -2.112 | -0.553 | -0.083 | 0.072 | 0.122 |
| 6.414999999999885 | -870.51 | -91.614 | -8.564 | -2.117 | -0.555 | -0.084 | 0.072 | 0.122 |
| 6.419999999999885 | -872.043 | -91.78 | -8.581 | -2.121 | -0.557 | -0.084 | 0.072 | 0.122 |
| 6.424999999999885 | -873.577 | -91.946 | -8.598 | -2.126 | -0.558 | -0.085 | 0.072 | 0.121 |
| 6.429999999999885 | -875.112 | -92.112 | -8.615 | -2.131 | -0.56 | -0.086 | 0.071 | 0.121 |
| 6.434999999999885 | -876.649 | -92.278 | -8.632 | -2.136 | -0.562 | -0.086 | 0.071 | 0.121 |
| 6.439999999999884 | -878.187 | -92.445 | -8.649 | -2.141 | -0.563 | -0.087 | 0.071 | 0.121 |
| 6.444999999999884 | -879.727 | -92.611 | -8.666 | -2.146 | -0.565 | -0.088 | 0.071 | 0.121 |
| 6.449999999999884 | -881.267 | -92.778 | -8.683 | -2.15 | -0.567 | -0.088 | 0.07 | 0.121 |
| 6.454999999999884 | -882.81 | -92.945 | -8.7 | -2.155 | -0.568 | -0.089 | 0.07 | 0.121 |
| 6.459999999999884 | -884.353 | -93.112 | -8.717 | -2.16 | -0.57 | -0.09 | 0.07 | 0.121 |
| 6.464999999999884 | -885.898 | -93.279 | -8.734 | -2.165 | -0.572 | -0.09 | 0.07 | 0.121 |
| 6.469999999999884 | -887.444 | -93.446 | -8.751 | -2.17 | -0.574 | -0.091 | 0.069 | 0.121 |
| 6.474999999999884 | -888.992 | -93.614 | -8.768 | -2.175 | -0.575 | -0.092 | 0.069 | 0.121 |
| 6.479999999999884 | -890.541 | -93.782 | -8.785 | -2.18 | -0.577 | -0.092 | 0.069 | 0.121 |
| 6.484999999999884 | -892.091 | -93.949 | -8.803 | -2.185 | -0.579 | -0.093 | 0.069 | 0.121 |
| 6.489999999999883 | -893.643 | -94.117 | -8.82 | -2.189 | -0.58 | -0.093 | 0.068 | 0.121 |
| 6.494999999999884 | -895.196 | -94.285 | -8.837 | -2.194 | -0.582 | -0.094 | 0.068 | 0.12 |
| 6.499999999999883 | -896.75 | -94.454 | -8.854 | -2.199 | -0.584 | -0.095 | 0.068 | 0.12 |
| 6.504999999999884 | -898.306 | -94.622 | -8.871 | -2.204 | -0.586 | -0.095 | 0.068 | 0.12 |
| 6.509999999999883 | -899.863 | -94.791 | -8.889 | -2.209 | -0.587 | -0.096 | 0.067 | 0.12 |
| 6.514999999999883 | -901.421 | -94.959 | -8.906 | -2.214 | -0.589 | -0.097 | 0.067 | 0.12 |
| 6.519999999999883 | -902.981 | -95.128 | -8.923 | -2.219 | -0.591 | -0.097 | 0.067 | 0.12 |
| 6.524999999999883 | -904.542 | -95.297 | -8.941 | -2.224 | -0.592 | -0.098 | 0.067 | 0.12 |
| 6.529999999999883 | -906.104 | -95.466 | -8.958 | -2.229 | -0.594 | -0.099 | 0.066 | 0.12 |
| 6.534999999999883 | -907.668 | -95.636 | -8.975 | -2.234 | -0.596 | -0.099 | 0.066 | 0.12 |
| 6.539999999999882 | -909.233 | -95.805 | -8.993 | -2.239 | -0.598 | -0.1 | 0.066 | 0.12 |
| 6.544999999999883 | -910.8 | -95.975 | -9.01 | -2.244 | -0.599 | -0.101 | 0.066 | 0.12 |
| 6.549999999999882 | -912.367 | -96.145 | -9.027 | -2.249 | -0.601 | -0.101 | 0.065 | 0.12 |
| 6.554999999999882 | -913.937 | -96.314 | -9.045 | -2.253 | -0.603 | -0.102 | 0.065 | 0.12 |
| 6.559999999999882 | -915.507 | -96.485 | -9.062 | -2.258 | -0.605 | -0.103 | 0.065 | 0.12 |
| 6.564999999999882 | -917.079 | -96.655 | -9.08 | -2.263 | -0.606 | -0.103 | 0.065 | 0.119 |
| 6.569999999999882 | -918.652 | -96.825 | -9.097 | -2.268 | -0.608 | -0.104 | 0.064 | 0.119 |
| 6.574999999999882 | -920.227 | -96.996 | -9.114 | -2.273 | -0.61 | -0.105 | 0.064 | 0.119 |
| 6.579999999999881 | -921.803 | -97.166 | -9.132 | -2.278 | -0.612 | -0.105 | 0.064 | 0.119 |
| 6.584999999999882 | -923.38 | -97.337 | -9.149 | -2.283 | -0.613 | -0.106 | 0.064 | 0.119 |
| 6.589999999999881 | -924.959 | -97.508 | -9.167 | -2.288 | -0.615 | -0.107 | 0.063 | 0.119 |
| 6.594999999999882 | -926.539 | -97.679 | -9.184 | -2.293 | -0.617 | -0.108 | 0.063 | 0.119 |
| 6.599999999999881 | -928.12 | -97.85 | -9.202 | -2.298 | -0.619 | -0.108 | 0.063 | 0.119 |
| 6.604999999999881 | -929.703 | -98.022 | -9.22 | -2.303 | -0.62 | -0.109 | 0.063 | 0.119 |
| 6.609999999999881 | -931.287 | -98.193 | -9.237 | -2.308 | -0.622 | -0.11 | 0.062 | 0.119 |
| 6.614999999999881 | -932.872 | -98.365 | -9.255 | -2.313 | -0.624 | -0.11 | 0.062 | 0.119 |
| 6.619999999999881 | -934.459 | -98.537 | -9.272 | -2.318 | -0.626 | -0.111 | 0.062 | 0.119 |
| 6.624999999999881 | -936.047 | -98.709 | -9.29 | -2.323 | -0.628 | -0.112 | 0.062 | 0.119 |
| 6.629999999999881 | -937.636 | -98.881 | -9.308 | -2.328 | -0.629 | -0.112 | 0.061 | 0.118 |
| 6.634999999999881 | -939.227 | -99.053 | -9.325 | -2.334 | -0.631 | -0.113 | 0.061 | 0.118 |
| 6.63999999999988 | -940.819 | -99.226 | -9.343 | -2.339 | -0.633 | -0.114 | 0.061 | 0.118 |
| 6.64499999999988 | -942.413 | -99.398 | -9.361 | -2.344 | -0.635 | -0.114 | 0.061 | 0.118 |
| 6.64999999999988 | -944.007 | -99.571 | -9.378 | -2.349 | -0.636 | -0.115 | 0.06 | 0.118 |
| 6.65499999999988 | -945.604 | -99.744 | -9.396 | -2.354 | -0.638 | -0.116 | 0.06 | 0.118 |
| 6.65999999999988 | -947.201 | -99.917 | -9.414 | -2.359 | -0.64 | -0.116 | 0.06 | 0.118 |
| 6.66499999999988 | -948.8 | -100.09 | -9.432 | -2.364 | -0.642 | -0.117 | 0.059 | 0.118 |
| 6.66999999999988 | -950.4 | -100.264 | -9.449 | -2.369 | -0.644 | -0.118 | 0.059 | 0.118 |
| 6.67499999999988 | -952.002 | -100.437 | -9.467 | -2.374 | -0.645 | -0.119 | 0.059 | 0.118 |
| 6.67999999999988 | -953.605 | -100.611 | -9.485 | -2.379 | -0.647 | -0.119 | 0.059 | 0.118 |
| 6.68499999999988 | -955.209 | -100.785 | -9.503 | -2.384 | -0.649 | -0.12 | 0.058 | 0.118 |
| 6.68999999999988 | -956.815 | -100.959 | -9.521 | -2.389 | -0.651 | -0.121 | 0.058 | 0.117 |
| 6.694999999999879 | -958.422 | -101.133 | -9.539 | -2.394 | -0.653 | -0.121 | 0.058 | 0.117 |
| 6.69999999999988 | -960.03 | -101.307 | -9.556 | -2.4 | -0.654 | -0.122 | 0.058 | 0.117 |
| 6.70499999999988 | -961.64 | -101.481 | -9.574 | -2.405 | -0.656 | -0.123 | 0.057 | 0.117 |
| 6.70999999999988 | -963.251 | -101.656 | -9.592 | -2.41 | -0.658 | -0.123 | 0.057 | 0.117 |
| 6.714999999999879 | -964.863 | -101.831 | -9.61 | -2.415 | -0.66 | -0.124 | 0.057 | 0.117 |
| 6.719999999999878 | -966.477 | -102.006 | -9.628 | -2.42 | -0.662 | -0.125 | 0.057 | 0.117 |
| 6.724999999999879 | -968.092 | -102.181 | -9.646 | -2.425 | -0.663 | -0.126 | 0.056 | 0.117 |
| 6.729999999999878 | -969.708 | -102.356 | -9.664 | -2.43 | -0.665 | -0.126 | 0.056 | 0.117 |
| 6.734999999999878 | -971.326 | -102.531 | -9.682 | -2.435 | -0.667 | -0.127 | 0.056 | 0.117 |
| 6.739999999999878 | -972.945 | -102.707 | -9.7 | -2.441 | -0.669 | -0.128 | 0.055 | 0.117 |
| 6.744999999999878 | -974.566 | -102.882 | -9.718 | -2.446 | -0.671 | -0.128 | 0.055 | 0.116 |
| 6.749999999999878 | -976.187 | -103.058 | -9.736 | -2.451 | -0.673 | -0.129 | 0.055 | 0.116 |
| 6.754999999999878 | -977.811 | -103.234 | -9.754 | -2.456 | -0.674 | -0.13 | 0.055 | 0.116 |
| 6.759999999999878 | -979.435 | -103.41 | -9.772 | -2.461 | -0.676 | -0.131 | 0.054 | 0.116 |
| 6.764999999999878 | -981.061 | -103.586 | -9.79 | -2.466 | -0.678 | -0.131 | 0.054 | 0.116 |
| 6.769999999999877 | -982.688 | -103.762 | -9.809 | -2.472 | -0.68 | -0.132 | 0.054 | 0.116 |
| 6.774999999999877 | -984.317 | -103.939 | -9.827 | -2.477 | -0.682 | -0.133 | 0.053 | 0.116 |
| 6.779999999999877 | -985.947 | -104.116 | -9.845 | -2.482 | -0.684 | -0.133 | 0.053 | 0.116 |
| 6.784999999999877 | -987.578 | -104.292 | -9.863 | -2.487 | -0.685 | -0.134 | 0.053 | 0.116 |
| 6.789999999999877 | -989.211 | -104.469 | -9.881 | -2.492 | -0.687 | -0.135 | 0.053 | 0.116 |
| 6.794999999999877 | -990.845 | -104.646 | -9.899 | -2.498 | -0.689 | -0.136 | 0.052 | 0.116 |
| 6.799999999999877 | -992.48 | -104.824 | -9.918 | -2.503 | -0.691 | -0.136 | 0.052 | 0.115 |
| 6.804999999999877 | -994.117 | -105.001 | -9.936 | -2.508 | -0.693 | -0.137 | 0.052 | 0.115 |
| 6.809999999999876 | -995.755 | -105.179 | -9.954 | -2.513 | -0.695 | -0.138 | 0.052 | 0.115 |
| 6.814999999999877 | -997.394 | -105.356 | -9.972 | -2.519 | -0.697 | -0.138 | 0.051 | 0.115 |
| 6.819999999999876 | -999.035 | -105.534 | -9.991 | -2.524 | -0.698 | -0.139 | 0.051 | 0.115 |
| 6.824999999999877 | -1000.677 | -105.712 | -10.009 | -2.529 | -0.7 | -0.14 | 0.051 | 0.115 |
| 6.829999999999876 | -1002.32 | -105.89 | -10.027 | -2.534 | -0.702 | -0.141 | 0.05 | 0.115 |
| 6.834999999999876 | -1003.965 | -106.069 | -10.046 | -2.54 | -0.704 | -0.141 | 0.05 | 0.115 |
| 6.839999999999876 | -1005.611 | -106.247 | -10.064 | -2.545 | -0.706 | -0.142 | 0.05 | 0.115 |
| 6.844999999999876 | -1007.259 | -106.426 | -10.082 | -2.55 | -0.708 | -0.143 | 0.05 | 0.115 |
| 6.849999999999876 | -1008.907 | -106.605 | -10.101 | -2.555 | -0.71 | -0.144 | 0.049 | 0.115 |
| 6.854999999999876 | -1010.558 | -106.783 | -10.119 | -2.561 | -0.711 | -0.144 | 0.049 | 0.114 |
| 6.859999999999875 | -1012.209 | -106.963 | -10.137 | -2.566 | -0.713 | -0.145 | 0.049 | 0.114 |
| 6.864999999999876 | -1013.862 | -107.142 | -10.156 | -2.571 | -0.715 | -0.146 | 0.048 | 0.114 |
| 6.869999999999875 | -1015.516 | -107.321 | -10.174 | -2.576 | -0.717 | -0.146 | 0.048 | 0.114 |
| 6.874999999999875 | -1017.172 | -107.501 | -10.193 | -2.582 | -0.719 | -0.147 | 0.048 | 0.114 |
| 6.879999999999875 | -1018.829 | -107.68 | -10.211 | -2.587 | -0.721 | -0.148 | 0.048 | 0.114 |
| 6.884999999999875 | -1020.487 | -107.86 | -10.23 | -2.592 | -0.723 | -0.149 | 0.047 | 0.114 |
| 6.889999999999875 | -1022.147 | -108.04 | -10.248 | -2.598 | -0.725 | -0.149 | 0.047 | 0.114 |
| 6.894999999999875 | -1023.808 | -108.22 | -10.267 | -2.603 | -0.726 | -0.15 | 0.047 | 0.114 |
| 6.899999999999875 | -1025.47 | -108.4 | -10.285 | -2.608 | -0.728 | -0.151 | 0.046 | 0.114 |
| 6.904999999999874 | -1027.134 | -108.581 | -10.304 | -2.614 | -0.73 | -0.152 | 0.046 | 0.113 |
| 6.909999999999874 | -1028.799 | -108.761 | -10.323 | -2.619 | -0.732 | -0.152 | 0.046 | 0.113 |
| 6.914999999999874 | -1030.465 | -108.942 | -10.341 | -2.624 | -0.734 | -0.153 | 0.045 | 0.113 |
| 6.919999999999874 | -1032.133 | -109.123 | -10.36 | -2.63 | -0.736 | -0.154 | 0.045 | 0.113 |
| 6.924999999999874 | -1033.802 | -109.304 | -10.378 | -2.635 | -0.738 | -0.155 | 0.045 | 0.113 |
| 6.929999999999874 | -1035.472 | -109.485 | -10.397 | -2.64 | -0.74 | -0.155 | 0.045 | 0.113 |
| 6.934999999999874 | -1037.144 | -109.666 | -10.416 | -2.646 | -0.742 | -0.156 | 0.044 | 0.113 |
| 6.939999999999874 | -1038.817 | -109.848 | -10.434 | -2.651 | -0.744 | -0.157 | 0.044 | 0.113 |
| 6.944999999999874 | -1040.492 | -110.029 | -10.453 | -2.656 | -0.745 | -0.158 | 0.044 | 0.113 |
| 6.949999999999874 | -1042.167 | -110.211 | -10.472 | -2.662 | -0.747 | -0.158 | 0.043 | 0.113 |
| 6.954999999999874 | -1043.845 | -110.393 | -10.49 | -2.667 | -0.749 | -0.159 | 0.043 | 0.112 |
| 6.959999999999873 | -1045.523 | -110.575 | -10.509 | -2.673 | -0.751 | -0.16 | 0.043 | 0.112 |
| 6.964999999999874 | -1047.203 | -110.757 | -10.528 | -2.678 | -0.753 | -0.161 | 0.042 | 0.112 |
| 6.969999999999873 | -1048.884 | -110.94 | -10.547 | -2.683 | -0.755 | -0.161 | 0.042 | 0.112 |
| 6.974999999999873 | -1050.567 | -111.122 | -10.566 | -2.689 | -0.757 | -0.162 | 0.042 | 0.112 |
| 6.979999999999873 | -1052.251 | -111.305 | -10.584 | -2.694 | -0.759 | -0.163 | 0.042 | 0.112 |
| 6.984999999999873 | -1053.936 | -111.488 | -10.603 | -2.7 | -0.761 | -0.164 | 0.041 | 0.112 |
| 6.989999999999873 | -1055.623 | -111.671 | -10.622 | -2.705 | -0.763 | -0.164 | 0.041 | 0.112 |
| 6.994999999999873 | -1057.311 | -111.854 | -10.641 | -2.71 | -0.765 | -0.165 | 0.041 | 0.112 |
| 6.999999999999872 | -1059 | -112.037 | -10.66 | -2.716 | -0.767 | -0.166 | 0.04 | 0.112 |
| 7.004999999999873 | -1060.691 | -112.22 | -10.679 | -2.721 | -0.769 | -0.167 | 0.04 | 0.111 |
| 7.009999999999872 | -1062.383 | -112.404 | -10.698 | -2.727 | -0.771 | -0.168 | 0.04 | 0.111 |
| 7.014999999999873 | -1064.076 | -112.588 | -10.717 | -2.732 | -0.772 | -0.168 | 0.039 | 0.111 |
| 7.019999999999872 | -1065.771 | -112.772 | -10.735 | -2.738 | -0.774 | -0.169 | 0.039 | 0.111 |
| 7.024999999999872 | -1067.467 | -112.956 | -10.754 | -2.743 | -0.776 | -0.17 | 0.039 | 0.111 |
| 7.029999999999872 | -1069.164 | -113.14 | -10.773 | -2.748 | -0.778 | -0.171 | 0.039 | 0.111 |
| 7.034999999999872 | -1070.863 | -113.324 | -10.792 | -2.754 | -0.78 | -0.171 | 0.038 | 0.111 |
| 7.039999999999872 | -1072.563 | -113.509 | -10.811 | -2.759 | -0.782 | -0.172 | 0.038 | 0.111 |
| 7.044999999999872 | -1074.265 | -113.693 | -10.83 | -2.765 | -0.784 | -0.173 | 0.038 | 0.111 |
| 7.049999999999871 | -1075.967 | -113.878 | -10.85 | -2.77 | -0.786 | -0.174 | 0.037 | 0.11 |
| 7.054999999999872 | -1077.672 | -114.063 | -10.869 | -2.776 | -0.788 | -0.174 | 0.037 | 0.11 |
| 7.059999999999871 | -1079.377 | -114.248 | -10.888 | -2.781 | -0.79 | -0.175 | 0.037 | 0.11 |
| 7.064999999999872 | -1081.084 | -114.433 | -10.907 | -2.787 | -0.792 | -0.176 | 0.036 | 0.11 |
| 7.069999999999871 | -1082.792 | -114.618 | -10.926 | -2.792 | -0.794 | -0.177 | 0.036 | 0.11 |
| 7.074999999999871 | -1084.502 | -114.804 | -10.945 | -2.798 | -0.796 | -0.178 | 0.036 | 0.11 |
| 7.07999999999987 | -1086.213 | -114.99 | -10.964 | -2.803 | -0.798 | -0.178 | 0.035 | 0.11 |
| 7.084999999999871 | -1087.925 | -115.175 | -10.983 | -2.809 | -0.8 | -0.179 | 0.035 | 0.11 |
| 7.08999999999987 | -1089.639 | -115.361 | -11.003 | -2.814 | -0.802 | -0.18 | 0.035 | 0.11 |
| 7.094999999999871 | -1091.354 | -115.547 | -11.022 | -2.82 | -0.804 | -0.181 | 0.034 | 0.11 |
| 7.09999999999987 | -1093.07 | -115.734 | -11.041 | -2.825 | -0.806 | -0.181 | 0.034 | 0.109 |
| 7.104999999999871 | -1094.788 | -115.92 | -11.06 | -2.831 | -0.808 | -0.182 | 0.034 | 0.109 |
| 7.10999999999987 | -1096.507 | -116.107 | -11.079 | -2.837 | -0.81 | -0.183 | 0.034 | 0.109 |
| 7.114999999999871 | -1098.227 | -116.293 | -11.099 | -2.842 | -0.812 | -0.184 | 0.033 | 0.109 |
| 7.11999999999987 | -1099.949 | -116.48 | -11.118 | -2.848 | -0.814 | -0.185 | 0.033 | 0.109 |
| 7.12499999999987 | -1101.672 | -116.667 | -11.137 | -2.853 | -0.816 | -0.185 | 0.033 | 0.109 |
| 7.12999999999987 | -1103.396 | -116.854 | -11.157 | -2.859 | -0.818 | -0.186 | 0.032 | 0.109 |
| 7.13499999999987 | -1105.122 | -117.042 | -11.176 | -2.864 | -0.82 | -0.187 | 0.032 | 0.109 |
| 7.13999999999987 | -1106.849 | -117.229 | -11.195 | -2.87 | -0.822 | -0.188 | 0.032 | 0.108 |
| 7.14499999999987 | -1108.578 | -117.417 | -11.215 | -2.875 | -0.824 | -0.189 | 0.031 | 0.108 |
| 7.14999999999987 | -1110.307 | -117.605 | -11.234 | -2.881 | -0.826 | -0.189 | 0.031 | 0.108 |
| 7.15499999999987 | -1112.039 | -117.792 | -11.253 | -2.887 | -0.828 | -0.19 | 0.031 | 0.108 |
| 7.15999999999987 | -1113.771 | -117.981 | -11.273 | -2.892 | -0.83 | -0.191 | 0.03 | 0.108 |
| 7.164999999999869 | -1115.505 | -118.169 | -11.292 | -2.898 | -0.832 | -0.192 | 0.03 | 0.108 |
| 7.16999999999987 | -1117.24 | -118.357 | -11.312 | -2.903 | -0.834 | -0.193 | 0.03 | 0.108 |
| 7.17499999999987 | -1118.977 | -118.546 | -11.331 | -2.909 | -0.836 | -0.193 | 0.029 | 0.108 |
| 7.17999999999987 | -1120.715 | -118.734 | -11.351 | -2.915 | -0.838 | -0.194 | 0.029 | 0.108 |
| 7.18499999999987 | -1122.454 | -118.923 | -11.37 | -2.92 | -0.84 | -0.195 | 0.029 | 0.107 |
| 7.189999999999868 | -1124.195 | -119.112 | -11.39 | -2.926 | -0.842 | -0.196 | 0.028 | 0.107 |
| 7.194999999999869 | -1125.937 | -119.301 | -11.409 | -2.932 | -0.844 | -0.197 | 0.028 | 0.107 |
| 7.199999999999868 | -1127.68 | -119.49 | -11.429 | -2.937 | -0.846 | -0.197 | 0.028 | 0.107 |
| 7.204999999999868 | -1129.425 | -119.68 | -11.448 | -2.943 | -0.848 | -0.198 | 0.027 | 0.107 |
| 7.209999999999868 | -1131.171 | -119.869 | -11.468 | -2.949 | -0.85 | -0.199 | 0.027 | 0.107 |
| 7.214999999999868 | -1132.918 | -120.059 | -11.487 | -2.954 | -0.852 | -0.2 | 0.027 | 0.107 |
| 7.219999999999868 | -1134.667 | -120.249 | -11.507 | -2.96 | -0.854 | -0.201 | 0.026 | 0.107 |
| 7.224999999999868 | -1136.417 | -120.439 | -11.527 | -2.965 | -0.856 | -0.201 | 0.026 | 0.106 |
| 7.229999999999868 | -1138.168 | -120.629 | -11.546 | -2.971 | -0.858 | -0.202 | 0.026 | 0.106 |
| 7.234999999999867 | -1139.921 | -120.819 | -11.566 | -2.977 | -0.86 | -0.203 | 0.025 | 0.106 |
| 7.239999999999867 | -1141.675 | -121.01 | -11.586 | -2.983 | -0.862 | -0.204 | 0.025 | 0.106 |
| 7.244999999999867 | -1143.431 | -121.2 | -11.605 | -2.988 | -0.864 | -0.205 | 0.025 | 0.106 |
| 7.249999999999867 | -1145.187 | -121.391 | -11.625 | -2.994 | -0.866 | -0.205 | 0.024 | 0.106 |
| 7.254999999999867 | -1146.946 | -121.582 | -11.645 | -3 | -0.868 | -0.206 | 0.024 | 0.106 |
| 7.259999999999867 | -1148.705 | -121.773 | -11.665 | -3.005 | -0.87 | -0.207 | 0.024 | 0.106 |
| 7.264999999999867 | -1150.466 | -121.964 | -11.684 | -3.011 | -0.872 | -0.208 | 0.023 | 0.106 |
| 7.269999999999867 | -1152.228 | -122.156 | -11.704 | -3.017 | -0.874 | -0.209 | 0.023 | 0.105 |
| 7.274999999999867 | -1153.992 | -122.347 | -11.724 | -3.022 | -0.876 | -0.21 | 0.023 | 0.105 |
| 7.279999999999867 | -1155.757 | -122.539 | -11.744 | -3.028 | -0.878 | -0.21 | 0.022 | 0.105 |
| 7.284999999999866 | -1157.523 | -122.731 | -11.764 | -3.034 | -0.881 | -0.211 | 0.022 | 0.105 |
| 7.289999999999866 | -1159.291 | -122.923 | -11.783 | -3.04 | -0.883 | -0.212 | 0.022 | 0.105 |
| 7.294999999999866 | -1161.06 | -123.115 | -11.803 | -3.045 | -0.885 | -0.213 | 0.021 | 0.105 |
| 7.299999999999866 | -1162.83 | -123.307 | -11.823 | -3.051 | -0.887 | -0.214 | 0.021 | 0.105 |
| 7.304999999999866 | -1164.602 | -123.499 | -11.843 | -3.057 | -0.889 | -0.215 | 0.021 | 0.105 |
| 7.309999999999866 | -1166.375 | -123.692 | -11.863 | -3.063 | -0.891 | -0.215 | 0.02 | 0.104 |
| 7.314999999999866 | -1168.149 | -123.885 | -11.883 | -3.068 | -0.893 | -0.216 | 0.02 | 0.104 |
| 7.319999999999866 | -1169.925 | -124.078 | -11.903 | -3.074 | -0.895 | -0.217 | 0.02 | 0.104 |
| 7.324999999999866 | -1171.702 | -124.271 | -11.923 | -3.08 | -0.897 | -0.218 | 0.019 | 0.104 |
| 7.329999999999865 | -1173.48 | -124.464 | -11.943 | -3.086 | -0.899 | -0.219 | 0.019 | 0.104 |
| 7.334999999999865 | -1175.26 | -124.657 | -11.963 | -3.091 | -0.901 | -0.219 | 0.019 | 0.104 |
| 7.339999999999865 | -1177.041 | -124.851 | -11.983 | -3.097 | -0.903 | -0.22 | 0.018 | 0.104 |
| 7.344999999999865 | -1178.824 | -125.044 | -12.003 | -3.103 | -0.905 | -0.221 | 0.018 | 0.104 |
| 7.349999999999865 | -1180.607 | -125.238 | -12.023 | -3.109 | -0.907 | -0.222 | 0.018 | 0.103 |
| 7.354999999999865 | -1182.393 | -125.432 | -12.043 | -3.115 | -0.91 | -0.223 | 0.017 | 0.103 |
| 7.359999999999865 | -1184.179 | -125.626 | -12.063 | -3.12 | -0.912 | -0.224 | 0.017 | 0.103 |
| 7.364999999999865 | -1185.967 | -125.82 | -12.083 | -3.126 | -0.914 | -0.225 | 0.017 | 0.103 |
| 7.369999999999865 | -1187.756 | -126.014 | -12.103 | -3.132 | -0.916 | -0.225 | 0.016 | 0.103 |
| 7.374999999999864 | -1189.547 | -126.209 | -12.123 | -3.138 | -0.918 | -0.226 | 0.016 | 0.103 |
| 7.379999999999864 | -1191.339 | -126.404 | -12.143 | -3.144 | -0.92 | -0.227 | 0.016 | 0.103 |
| 7.384999999999864 | -1193.132 | -126.598 | -12.164 | -3.15 | -0.922 | -0.228 | 0.015 | 0.102 |
| 7.389999999999864 | -1194.927 | -126.793 | -12.184 | -3.155 | -0.924 | -0.229 | 0.015 | 0.102 |
| 7.394999999999864 | -1196.723 | -126.988 | -12.204 | -3.161 | -0.926 | -0.23 | 0.015 | 0.102 |
| 7.399999999999864 | -1198.52 | -127.184 | -12.224 | -3.167 | -0.928 | -0.23 | 0.014 | 0.102 |
| 7.404999999999864 | -1200.319 | -127.379 | -12.244 | -3.173 | -0.931 | -0.231 | 0.014 | 0.102 |
| 7.409999999999864 | -1202.119 | -127.575 | -12.265 | -3.179 | -0.933 | -0.232 | 0.014 | 0.102 |
| 7.414999999999864 | -1203.92 | -127.77 | -12.285 | -3.185 | -0.935 | -0.233 | 0.013 | 0.102 |
| 7.419999999999864 | -1205.723 | -127.966 | -12.305 | -3.191 | -0.937 | -0.234 | 0.013 | 0.102 |
| 7.424999999999864 | -1207.527 | -128.162 | -12.326 | -3.196 | -0.939 | -0.235 | 0.012 | 0.101 |
| 7.429999999999863 | -1209.332 | -128.358 | -12.346 | -3.202 | -0.941 | -0.236 | 0.012 | 0.101 |
| 7.434999999999863 | -1211.139 | -128.555 | -12.366 | -3.208 | -0.943 | -0.236 | 0.012 | 0.101 |
| 7.439999999999863 | -1212.947 | -128.751 | -12.387 | -3.214 | -0.945 | -0.237 | 0.011 | 0.101 |
| 7.444999999999863 | -1214.757 | -128.948 | -12.407 | -3.22 | -0.948 | -0.238 | 0.011 | 0.101 |
| 7.449999999999863 | -1216.567 | -129.145 | -12.427 | -3.226 | -0.95 | -0.239 | 0.011 | 0.101 |
| 7.454999999999863 | -1218.38 | -129.341 | -12.448 | -3.232 | -0.952 | -0.24 | 0.01 | 0.101 |
| 7.459999999999863 | -1220.193 | -129.539 | -12.468 | -3.238 | -0.954 | -0.241 | 0.01 | 0.101 |
| 7.464999999999863 | -1222.008 | -129.736 | -12.489 | -3.244 | -0.956 | -0.242 | 0.01 | 0.1 |
| 7.469999999999862 | -1223.824 | -129.933 | -12.509 | -3.25 | -0.958 | -0.242 | 0.009 | 0.1 |
| 7.474999999999862 | -1225.642 | -130.131 | -12.529 | -3.255 | -0.96 | -0.243 | 0.009 | 0.1 |
| 7.479999999999862 | -1227.461 | -130.328 | -12.55 | -3.261 | -0.962 | -0.244 | 0.009 | 0.1 |
| 7.484999999999862 | -1229.281 | -130.526 | -12.57 | -3.267 | -0.965 | -0.245 | 0.008 | 0.1 |
| 7.489999999999862 | -1231.103 | -130.724 | -12.591 | -3.273 | -0.967 | -0.246 | 0.008 | 0.1 |
| 7.494999999999862 | -1232.926 | -130.922 | -12.611 | -3.279 | -0.969 | -0.247 | 0.008 | 0.1 |
| 7.499999999999862 | -1234.75 | -131.12 | -12.632 | -3.285 | -0.971 | -0.248 | 0.007 | 0.099 |
| 7.504999999999862 | -1236.576 | -131.319 | -12.653 | -3.291 | -0.973 | -0.248 | 0.007 | 0.099 |
| 7.509999999999862 | -1238.403 | -131.517 | -12.673 | -3.297 | -0.975 | -0.249 | 0.006 | 0.099 |
| 7.514999999999862 | -1240.231 | -131.716 | -12.694 | -3.303 | -0.978 | -0.25 | 0.006 | 0.099 |
| 7.519999999999861 | -1242.061 | -131.915 | -12.714 | -3.309 | -0.98 | -0.251 | 0.006 | 0.099 |
| 7.524999999999862 | -1243.892 | -132.114 | -12.735 | -3.315 | -0.982 | -0.252 | 0.005 | 0.099 |
| 7.529999999999861 | -1245.724 | -132.313 | -12.756 | -3.321 | -0.984 | -0.253 | 0.005 | 0.099 |
| 7.534999999999861 | -1247.558 | -132.512 | -12.776 | -3.327 | -0.986 | -0.254 | 0.005 | 0.098 |
| 7.53999999999986 | -1249.393 | -132.712 | -12.797 | -3.333 | -0.988 | -0.255 | 0.004 | 0.098 |
| 7.544999999999861 | -1251.23 | -132.911 | -12.818 | -3.339 | -0.991 | -0.255 | 0.004 | 0.098 |
| 7.54999999999986 | -1253.067 | -133.111 | -12.838 | -3.345 | -0.993 | -0.256 | 0.004 | 0.098 |
| 7.554999999999861 | -1254.907 | -133.311 | -12.859 | -3.351 | -0.995 | -0.257 | 0.003 | 0.098 |
| 7.55999999999986 | -1256.747 | -133.511 | -12.88 | -3.357 | -0.997 | -0.258 | 0.003 | 0.098 |
| 7.564999999999861 | -1258.589 | -133.711 | -12.901 | -3.363 | -0.999 | -0.259 | 0.002 | 0.098 |
| 7.56999999999986 | -1260.432 | -133.912 | -12.921 | -3.369 | -1.001 | -0.26 | 0.002 | 0.097 |
| 7.57499999999986 | -1262.277 | -134.112 | -12.942 | -3.375 | -1.004 | -0.261 | 0.002 | 0.097 |
| 7.57999999999986 | -1264.123 | -134.313 | -12.963 | -3.381 | -1.006 | -0.262 | 0.001 | 0.097 |
| 7.58499999999986 | -1265.97 | -134.514 | -12.984 | -3.387 | -1.008 | -0.262 | 0.001 | 0.097 |
| 7.58999999999986 | -1267.819 | -134.715 | -13.005 | -3.393 | -1.01 | -0.263 | 0.001 | 0.097 |
| 7.59499999999986 | -1269.669 | -134.916 | -13.026 | -3.399 | -1.012 | -0.264 | 0 | 0.097 |
| 7.59999999999986 | -1271.52 | -135.117 | -13.046 | -3.405 | -1.015 | -0.265 | 0 | 0.097 |
| 7.60499999999986 | -1273.373 | -135.318 | -13.067 | -3.411 | -1.017 | -0.266 | -0.001 | 0.096 |
| 7.60999999999986 | -1275.227 | -135.52 | -13.088 | -3.417 | -1.019 | -0.267 | -0.001 | 0.096 |
| 7.61499999999986 | -1277.082 | -135.722 | -13.109 | -3.424 | -1.021 | -0.268 | -0.001 | 0.096 |
| 7.61999999999986 | -1278.939 | -135.924 | -13.13 | -3.43 | -1.023 | -0.269 | -0.002 | 0.096 |
| 7.62499999999986 | -1280.797 | -136.126 | -13.151 | -3.436 | -1.026 | -0.27 | -0.002 | 0.096 |
| 7.629999999999859 | -1282.656 | -136.328 | -13.172 | -3.442 | -1.028 | -0.27 | -0.002 | 0.096 |
| 7.634999999999859 | -1284.517 | -136.53 | -13.193 | -3.448 | -1.03 | -0.271 | -0.003 | 0.096 |
| 7.63999999999986 | -1286.379 | -136.733 | -13.214 | -3.454 | -1.032 | -0.272 | -0.003 | 0.095 |
| 7.644999999999859 | -1288.243 | -136.935 | -13.235 | -3.46 | -1.034 | -0.273 | -0.004 | 0.095 |
| 7.64999999999986 | -1290.107 | -137.138 | -13.256 | -3.466 | -1.037 | -0.274 | -0.004 | 0.095 |
| 7.654999999999859 | -1291.974 | -137.341 | -13.277 | -3.472 | -1.039 | -0.275 | -0.004 | 0.095 |
| 7.659999999999859 | -1293.841 | -137.544 | -13.298 | -3.478 | -1.041 | -0.276 | -0.005 | 0.095 |
| 7.664999999999859 | -1295.71 | -137.747 | -13.319 | -3.485 | -1.043 | -0.277 | -0.005 | 0.095 |
| 7.669999999999859 | -1297.58 | -137.95 | -13.341 | -3.491 | -1.045 | -0.278 | -0.005 | 0.095 |
| 7.674999999999859 | -1299.452 | -138.154 | -13.362 | -3.497 | -1.048 | -0.279 | -0.006 | 0.094 |
| 7.679999999999858 | -1301.325 | -138.358 | -13.383 | -3.503 | -1.05 | -0.28 | -0.006 | 0.094 |
| 7.684999999999858 | -1303.199 | -138.561 | -13.404 | -3.509 | -1.052 | -0.28 | -0.007 | 0.094 |
| 7.689999999999858 | -1305.075 | -138.765 | -13.425 | -3.515 | -1.054 | -0.281 | -0.007 | 0.094 |
| 7.694999999999858 | -1306.952 | -138.969 | -13.446 | -3.521 | -1.057 | -0.282 | -0.007 | 0.094 |
| 7.699999999999858 | -1308.83 | -139.174 | -13.468 | -3.528 | -1.059 | -0.283 | -0.008 | 0.094 |
| 7.704999999999858 | -1310.71 | -139.378 | -13.489 | -3.534 | -1.061 | -0.284 | -0.008 | 0.093 |
| 7.709999999999857 | -1312.591 | -139.583 | -13.51 | -3.54 | -1.063 | -0.285 | -0.008 | 0.093 |
| 7.714999999999858 | -1314.473 | -139.787 | -13.531 | -3.546 | -1.066 | -0.286 | -0.009 | 0.093 |
| 7.719999999999857 | -1316.357 | -139.992 | -13.553 | -3.552 | -1.068 | -0.287 | -0.009 | 0.093 |
| 7.724999999999857 | -1318.242 | -140.197 | -13.574 | -3.559 | -1.07 | -0.288 | -0.01 | 0.093 |
| 7.729999999999857 | -1320.128 | -140.402 | -13.595 | -3.565 | -1.072 | -0.289 | -0.01 | 0.093 |
| 7.734999999999857 | -1322.016 | -140.608 | -13.617 | -3.571 | -1.075 | -0.29 | -0.01 | 0.093 |
| 7.739999999999857 | -1323.905 | -140.813 | -13.638 | -3.577 | -1.077 | -0.29 | -0.011 | 0.092 |
| 7.744999999999857 | -1325.796 | -141.019 | -13.659 | -3.583 | -1.079 | -0.291 | -0.011 | 0.092 |
| 7.749999999999856 | -1327.687 | -141.225 | -13.681 | -3.59 | -1.081 | -0.292 | -0.012 | 0.092 |
| 7.754999999999857 | -1329.581 | -141.43 | -13.702 | -3.596 | -1.084 | -0.293 | -0.012 | 0.092 |
| 7.759999999999856 | -1331.475 | -141.637 | -13.723 | -3.602 | -1.086 | -0.294 | -0.012 | 0.092 |
| 7.764999999999857 | -1333.371 | -141.843 | -13.745 | -3.608 | -1.088 | -0.295 | -0.013 | 0.092 |
| 7.769999999999856 | -1335.268 | -142.049 | -13.766 | -3.615 | -1.09 | -0.296 | -0.013 | 0.091 |
| 7.774999999999856 | -1337.167 | -142.256 | -13.788 | -3.621 | -1.093 | -0.297 | -0.014 | 0.091 |
| 7.779999999999856 | -1339.067 | -142.462 | -13.809 | -3.627 | -1.095 | -0.298 | -0.014 | 0.091 |
| 7.784999999999856 | -1340.968 | -142.669 | -13.831 | -3.633 | -1.097 | -0.299 | -0.014 | 0.091 |
| 7.789999999999856 | -1342.871 | -142.876 | -13.852 | -3.64 | -1.1 | -0.3 | -0.015 | 0.091 |
| 7.794999999999856 | -1344.775 | -143.083 | -13.874 | -3.646 | -1.102 | -0.301 | -0.015 | 0.091 |
| 7.799999999999855 | -1346.68 | -143.29 | -13.895 | -3.652 | -1.104 | -0.302 | -0.015 | 0.091 |
| 7.804999999999856 | -1348.587 | -143.498 | -13.917 | -3.658 | -1.106 | -0.302 | -0.016 | 0.09 |
| 7.809999999999855 | -1350.495 | -143.705 | -13.939 | -3.665 | -1.109 | -0.303 | -0.016 | 0.09 |
| 7.814999999999856 | -1352.404 | -143.913 | -13.96 | -3.671 | -1.111 | -0.304 | -0.017 | 0.09 |
| 7.819999999999855 | -1354.315 | -144.121 | -13.982 | -3.677 | -1.113 | -0.305 | -0.017 | 0.09 |
| 7.824999999999855 | -1356.227 | -144.329 | -14.003 | -3.684 | -1.115 | -0.306 | -0.017 | 0.09 |
| 7.829999999999855 | -1358.14 | -144.537 | -14.025 | -3.69 | -1.118 | -0.307 | -0.018 | 0.09 |
| 7.834999999999855 | -1360.055 | -144.745 | -14.047 | -3.696 | -1.12 | -0.308 | -0.018 | 0.089 |
| 7.839999999999855 | -1361.971 | -144.954 | -14.068 | -3.702 | -1.122 | -0.309 | -0.019 | 0.089 |
| 7.844999999999855 | -1363.889 | -145.162 | -14.09 | -3.709 | -1.125 | -0.31 | -0.019 | 0.089 |
| 7.849999999999854 | -1365.807 | -145.371 | -14.112 | -3.715 | -1.127 | -0.311 | -0.019 | 0.089 |
| 7.854999999999855 | -1367.728 | -145.58 | -14.133 | -3.721 | -1.129 | -0.312 | -0.02 | 0.089 |
| 7.859999999999854 | -1369.649 | -145.789 | -14.155 | -3.728 | -1.132 | -0.313 | -0.02 | 0.089 |
| 7.864999999999854 | -1371.572 | -145.998 | -14.177 | -3.734 | -1.134 | -0.314 | -0.021 | 0.088 |
| 7.869999999999854 | -1373.496 | -146.208 | -14.199 | -3.74 | -1.136 | -0.315 | -0.021 | 0.088 |
| 7.874999999999854 | -1375.422 | -146.417 | -14.221 | -3.747 | -1.139 | -0.316 | -0.021 | 0.088 |
| 7.879999999999854 | -1377.349 | -146.627 | -14.242 | -3.753 | -1.141 | -0.317 | -0.022 | 0.088 |
| 7.884999999999854 | -1379.277 | -146.837 | -14.264 | -3.759 | -1.143 | -0.318 | -0.022 | 0.088 |
| 7.889999999999854 | -1381.207 | -147.047 | -14.286 | -3.766 | -1.145 | -0.318 | -0.023 | 0.088 |
| 7.894999999999854 | -1383.138 | -147.257 | -14.308 | -3.772 | -1.148 | -0.319 | -0.023 | 0.087 |
| 7.899999999999854 | -1385.07 | -147.467 | -14.33 | -3.779 | -1.15 | -0.32 | -0.023 | 0.087 |
| 7.904999999999854 | -1387.004 | -147.677 | -14.352 | -3.785 | -1.152 | -0.321 | -0.024 | 0.087 |
| 7.909999999999853 | -1388.939 | -147.888 | -14.374 | -3.791 | -1.155 | -0.322 | -0.024 | 0.087 |
| 7.914999999999853 | -1390.875 | -148.099 | -14.396 | -3.798 | -1.157 | -0.323 | -0.025 | 0.087 |
| 7.919999999999853 | -1392.813 | -148.31 | -14.417 | -3.804 | -1.159 | -0.324 | -0.025 | 0.087 |
| 7.924999999999853 | -1394.752 | -148.521 | -14.439 | -3.811 | -1.162 | -0.325 | -0.026 | 0.086 |
| 7.929999999999853 | -1396.692 | -148.732 | -14.461 | -3.817 | -1.164 | -0.326 | -0.026 | 0.086 |
| 7.934999999999853 | -1398.634 | -148.943 | -14.483 | -3.823 | -1.166 | -0.327 | -0.026 | 0.086 |
| 7.939999999999852 | -1400.577 | -149.155 | -14.505 | -3.83 | -1.169 | -0.328 | -0.027 | 0.086 |
| 7.944999999999853 | -1402.522 | -149.366 | -14.527 | -3.836 | -1.171 | -0.329 | -0.027 | 0.086 |
| 7.949999999999852 | -1404.467 | -149.578 | -14.55 | -3.843 | -1.173 | -0.33 | -0.028 | 0.086 |
| 7.954999999999853 | -1406.415 | -149.79 | -14.572 | -3.849 | -1.176 | -0.331 | -0.028 | 0.085 |
| 7.959999999999852 | -1408.363 | -150.002 | -14.594 | -3.856 | -1.178 | -0.332 | -0.028 | 0.085 |
| 7.964999999999852 | -1410.313 | -150.214 | -14.616 | -3.862 | -1.181 | -0.333 | -0.029 | 0.085 |
| 7.969999999999852 | -1412.264 | -150.426 | -14.638 | -3.868 | -1.183 | -0.334 | -0.029 | 0.085 |
| 7.974999999999852 | -1414.217 | -150.639 | -14.66 | -3.875 | -1.185 | -0.335 | -0.03 | 0.085 |
| 7.979999999999852 | -1416.171 | -150.852 | -14.682 | -3.881 | -1.188 | -0.336 | -0.03 | 0.085 |
| 7.984999999999852 | -1418.126 | -151.064 | -14.704 | -3.888 | -1.19 | -0.337 | -0.03 | 0.084 |
| 7.989999999999851 | -1420.083 | -151.277 | -14.727 | -3.894 | -1.192 | -0.338 | -0.031 | 0.084 |
| 7.994999999999852 | -1422.041 | -151.49 | -14.749 | -3.901 | -1.195 | -0.339 | -0.031 | 0.084 |
| 7.999999999999851 | -1424 | -151.704 | -14.771 | -3.907 | -1.197 | -0.34 | -0.032 | 0.084 |
| 8.004999999999852 | -1425.961 | -151.917 | -14.793 | -3.914 | -1.199 | -0.341 | -0.032 | 0.084 |
| 8.009999999999852 | -1427.923 | -152.131 | -14.815 | -3.92 | -1.202 | -0.342 | -0.033 | 0.084 |
| 8.014999999999853 | -1429.886 | -152.344 | -14.838 | -3.927 | -1.204 | -0.343 | -0.033 | 0.083 |
| 8.019999999999852 | -1431.851 | -152.558 | -14.86 | -3.933 | -1.207 | -0.343 | -0.033 | 0.083 |
| 8.024999999999855 | -1433.817 | -152.772 | -14.882 | -3.94 | -1.209 | -0.344 | -0.034 | 0.083 |
| 8.029999999999855 | -1435.784 | -152.986 | -14.905 | -3.946 | -1.211 | -0.345 | -0.034 | 0.083 |
| 8.034999999999856 | -1437.753 | -153.201 | -14.927 | -3.953 | -1.214 | -0.346 | -0.035 | 0.083 |
| 8.039999999999857 | -1439.723 | -153.415 | -14.949 | -3.959 | -1.216 | -0.347 | -0.035 | 0.083 |
| 8.044999999999858 | -1441.695 | -153.63 | -14.972 | -3.966 | -1.218 | -0.348 | -0.035 | 0.082 |
| 8.049999999999859 | -1443.667 | -153.845 | -14.994 | -3.972 | -1.221 | -0.349 | -0.036 | 0.082 |
| 8.05499999999986 | -1445.642 | -154.059 | -15.016 | -3.979 | -1.223 | -0.35 | -0.036 | 0.082 |
| 8.05999999999986 | -1447.617 | -154.275 | -15.039 | -3.985 | -1.226 | -0.351 | -0.037 | 0.082 |
| 8.06499999999986 | -1449.594 | -154.49 | -15.061 | -3.992 | -1.228 | -0.352 | -0.037 | 0.082 |
| 8.06999999999986 | -1451.572 | -154.705 | -15.084 | -3.999 | -1.23 | -0.353 | -0.038 | 0.082 |
| 8.074999999999863 | -1453.552 | -154.921 | -15.106 | -4.005 | -1.233 | -0.354 | -0.038 | 0.081 |
| 8.079999999999863 | -1455.533 | -155.136 | -15.129 | -4.012 | -1.235 | -0.355 | -0.038 | 0.081 |
| 8.084999999999864 | -1457.515 | -155.352 | -15.151 | -4.018 | -1.238 | -0.356 | -0.039 | 0.081 |
| 8.089999999999865 | -1459.499 | -155.568 | -15.174 | -4.025 | -1.24 | -0.357 | -0.039 | 0.081 |
| 8.094999999999866 | -1461.484 | -155.784 | -15.196 | -4.031 | -1.242 | -0.358 | -0.04 | 0.081 |
| 8.099999999999866 | -1463.47 | -156 | -15.219 | -4.038 | -1.245 | -0.359 | -0.04 | 0.08 |
| 8.104999999999867 | -1465.458 | -156.217 | -15.241 | -4.045 | -1.247 | -0.36 | -0.041 | 0.08 |
| 8.109999999999866 | -1467.447 | -156.433 | -15.264 | -4.051 | -1.25 | -0.361 | -0.041 | 0.08 |
| 8.114999999999869 | -1469.437 | -156.65 | -15.286 | -4.058 | -1.252 | -0.362 | -0.041 | 0.08 |
| 8.11999999999987 | -1471.429 | -156.867 | -15.309 | -4.064 | -1.255 | -0.363 | -0.042 | 0.08 |
| 8.12499999999987 | -1473.422 | -157.084 | -15.332 | -4.071 | -1.257 | -0.364 | -0.042 | 0.08 |
| 8.129999999999871 | -1475.416 | -157.301 | -15.354 | -4.078 | -1.259 | -0.365 | -0.043 | 0.079 |
| 8.134999999999872 | -1477.412 | -157.518 | -15.377 | -4.084 | -1.262 | -0.366 | -0.043 | 0.079 |
| 8.139999999999873 | -1479.409 | -157.736 | -15.4 | -4.091 | -1.264 | -0.367 | -0.044 | 0.079 |
| 8.144999999999873 | -1481.408 | -157.953 | -15.422 | -4.097 | -1.267 | -0.368 | -0.044 | 0.079 |
| 8.149999999999874 | -1483.407 | -158.171 | -15.445 | -4.104 | -1.269 | -0.369 | -0.044 | 0.079 |
| 8.154999999999875 | -1485.409 | -158.389 | -15.468 | -4.111 | -1.272 | -0.37 | -0.045 | 0.079 |
| 8.159999999999876 | -1487.411 | -158.607 | -15.491 | -4.117 | -1.274 | -0.371 | -0.045 | 0.078 |
| 8.164999999999877 | -1489.415 | -158.825 | -15.513 | -4.124 | -1.276 | -0.372 | -0.046 | 0.078 |
| 8.169999999999877 | -1491.42 | -159.044 | -15.536 | -4.131 | -1.279 | -0.373 | -0.046 | 0.078 |
| 8.174999999999878 | -1493.427 | -159.262 | -15.559 | -4.137 | -1.281 | -0.374 | -0.047 | 0.078 |
| 8.179999999999877 | -1495.435 | -159.481 | -15.582 | -4.144 | -1.284 | -0.375 | -0.047 | 0.078 |
| 8.18499999999988 | -1497.444 | -159.7 | -15.605 | -4.151 | -1.286 | -0.376 | -0.047 | 0.077 |
| 8.18999999999988 | -1499.455 | -159.919 | -15.627 | -4.157 | -1.289 | -0.377 | -0.048 | 0.077 |
| 8.194999999999881 | -1501.467 | -160.138 | -15.65 | -4.164 | -1.291 | -0.378 | -0.048 | 0.077 |
| 8.199999999999882 | -1503.48 | -160.357 | -15.673 | -4.171 | -1.294 | -0.379 | -0.049 | 0.077 |
| 8.204999999999883 | -1505.495 | -160.576 | -15.696 | -4.178 | -1.296 | -0.38 | -0.049 | 0.077 |
| 8.209999999999884 | -1507.511 | -160.796 | -15.719 | -4.184 | -1.298 | -0.381 | -0.05 | 0.077 |
| 8.214999999999884 | -1509.528 | -161.016 | -15.742 | -4.191 | -1.301 | -0.382 | -0.05 | 0.076 |
| 8.219999999999885 | -1511.547 | -161.236 | -15.765 | -4.198 | -1.303 | -0.383 | -0.051 | 0.076 |
| 8.224999999999886 | -1513.567 | -161.456 | -15.788 | -4.204 | -1.306 | -0.384 | -0.051 | 0.076 |
| 8.229999999999887 | -1515.588 | -161.676 | -15.811 | -4.211 | -1.308 | -0.385 | -0.051 | 0.076 |
| 8.234999999999888 | -1517.611 | -161.896 | -15.834 | -4.218 | -1.311 | -0.386 | -0.052 | 0.076 |
| 8.239999999999888 | -1519.635 | -162.117 | -15.857 | -4.225 | -1.313 | -0.387 | -0.052 | 0.075 |
| 8.244999999999889 | -1521.661 | -162.337 | -15.88 | -4.231 | -1.316 | -0.388 | -0.053 | 0.075 |
| 8.24999999999989 | -1523.687 | -162.558 | -15.903 | -4.238 | -1.318 | -0.39 | -0.053 | 0.075 |
| 8.25499999999989 | -1525.716 | -162.779 | -15.926 | -4.245 | -1.321 | -0.391 | -0.054 | 0.075 |
| 8.25999999999989 | -1527.745 | -163 | -15.949 | -4.252 | -1.323 | -0.392 | -0.054 | 0.075 |
| 8.264999999999892 | -1529.776 | -163.221 | -15.972 | -4.258 | -1.326 | -0.393 | -0.055 | 0.074 |
| 8.269999999999891 | -1531.808 | -163.442 | -15.995 | -4.265 | -1.328 | -0.394 | -0.055 | 0.074 |
| 8.274999999999894 | -1533.842 | -163.664 | -16.018 | -4.272 | -1.331 | -0.395 | -0.055 | 0.074 |
| 8.279999999999895 | -1535.877 | -163.886 | -16.041 | -4.279 | -1.333 | -0.396 | -0.056 | 0.074 |
| 8.284999999999895 | -1537.913 | -164.107 | -16.065 | -4.285 | -1.336 | -0.397 | -0.056 | 0.074 |
| 8.289999999999896 | -1539.951 | -164.329 | -16.088 | -4.292 | -1.338 | -0.398 | -0.057 | 0.074 |
| 8.294999999999897 | -1541.99 | -164.551 | -16.111 | -4.299 | -1.341 | -0.399 | -0.057 | 0.073 |
| 8.299999999999898 | -1544.03 | -164.774 | -16.134 | -4.306 | -1.343 | -0.4 | -0.058 | 0.073 |
| 8.304999999999898 | -1546.072 | -164.996 | -16.157 | -4.313 | -1.346 | -0.401 | -0.058 | 0.073 |
| 8.3099999999999 | -1548.115 | -165.219 | -16.181 | -4.319 | -1.348 | -0.402 | -0.059 | 0.073 |
| 8.3149999999999 | -1550.159 | -165.441 | -16.204 | -4.326 | -1.351 | -0.403 | -0.059 | 0.073 |
| 8.3199999999999 | -1552.205 | -165.664 | -16.227 | -4.333 | -1.353 | -0.404 | -0.059 | 0.072 |
| 8.3249999999999 | -1554.252 | -165.887 | -16.251 | -4.34 | -1.356 | -0.405 | -0.06 | 0.072 |
| 8.3299999999999 | -1556.3 | -166.11 | -16.274 | -4.347 | -1.358 | -0.406 | -0.06 | 0.072 |
| 8.334999999999903 | -1558.35 | -166.334 | -16.297 | -4.354 | -1.361 | -0.407 | -0.061 | 0.072 |
| 8.339999999999902 | -1560.401 | -166.557 | -16.321 | -4.36 | -1.363 | -0.408 | -0.061 | 0.072 |
| 8.344999999999905 | -1562.454 | -166.781 | -16.344 | -4.367 | -1.366 | -0.409 | -0.062 | 0.071 |
| 8.349999999999905 | -1564.507 | -167.005 | -16.367 | -4.374 | -1.368 | -0.41 | -0.062 | 0.071 |
| 8.354999999999906 | -1566.563 | -167.228 | -16.391 | -4.381 | -1.371 | -0.411 | -0.063 | 0.071 |
| 8.359999999999907 | -1568.619 | -167.453 | -16.414 | -4.388 | -1.373 | -0.412 | -0.063 | 0.071 |
| 8.364999999999908 | -1570.677 | -167.677 | -16.438 | -4.395 | -1.376 | -0.413 | -0.064 | 0.071 |
| 8.369999999999909 | -1572.736 | -167.901 | -16.461 | -4.402 | -1.378 | -0.414 | -0.064 | 0.07 |
| 8.37499999999991 | -1574.797 | -168.126 | -16.484 | -4.408 | -1.381 | -0.415 | -0.065 | 0.07 |
| 8.37999999999991 | -1576.859 | -168.35 | -16.508 | -4.415 | -1.383 | -0.416 | -0.065 | 0.07 |
| 8.38499999999991 | -1578.922 | -168.575 | -16.531 | -4.422 | -1.386 | -0.418 | -0.065 | 0.07 |
| 8.38999999999991 | -1580.987 | -168.8 | -16.555 | -4.429 | -1.388 | -0.419 | -0.066 | 0.07 |
| 8.39499999999991 | -1583.053 | -169.025 | -16.578 | -4.436 | -1.391 | -0.42 | -0.066 | 0.069 |
| 8.39999999999991 | -1585.12 | -169.25 | -16.602 | -4.443 | -1.393 | -0.421 | -0.067 | 0.069 |
| 8.404999999999914 | -1587.189 | -169.476 | -16.626 | -4.45 | -1.396 | -0.422 | -0.067 | 0.069 |
| 8.409999999999915 | -1589.259 | -169.701 | -16.649 | -4.457 | -1.398 | -0.423 | -0.068 | 0.069 |
| 8.414999999999916 | -1591.33 | -169.927 | -16.673 | -4.464 | -1.401 | -0.424 | -0.068 | 0.069 |
| 8.419999999999916 | -1593.403 | -170.153 | -16.696 | -4.471 | -1.404 | -0.425 | -0.069 | 0.068 |
| 8.424999999999917 | -1595.477 | -170.379 | -16.72 | -4.477 | -1.406 | -0.426 | -0.069 | 0.068 |
| 8.429999999999916 | -1597.552 | -170.605 | -16.744 | -4.484 | -1.409 | -0.427 | -0.07 | 0.068 |
| 8.434999999999919 | -1599.629 | -170.831 | -16.767 | -4.491 | -1.411 | -0.428 | -0.07 | 0.068 |
| 8.43999999999992 | -1601.707 | -171.058 | -16.791 | -4.498 | -1.414 | -0.429 | -0.071 | 0.068 |
| 8.44499999999992 | -1603.787 | -171.284 | -16.815 | -4.505 | -1.416 | -0.43 | -0.071 | 0.067 |
| 8.44999999999992 | -1605.867 | -171.511 | -16.838 | -4.512 | -1.419 | -0.431 | -0.071 | 0.067 |
| 8.45499999999992 | -1607.95 | -171.738 | -16.862 | -4.519 | -1.421 | -0.432 | -0.072 | 0.067 |
| 8.45999999999992 | -1610.033 | -171.965 | -16.886 | -4.526 | -1.424 | -0.433 | -0.072 | 0.067 |
| 8.464999999999923 | -1612.118 | -172.192 | -16.91 | -4.533 | -1.427 | -0.435 | -0.073 | 0.067 |
| 8.469999999999924 | -1614.204 | -172.42 | -16.933 | -4.54 | -1.429 | -0.436 | -0.073 | 0.066 |
| 8.474999999999925 | -1616.292 | -172.647 | -16.957 | -4.547 | -1.432 | -0.437 | -0.074 | 0.066 |
| 8.479999999999926 | -1618.381 | -172.875 | -16.981 | -4.554 | -1.434 | -0.438 | -0.074 | 0.066 |
| 8.484999999999927 | -1620.471 | -173.103 | -17.005 | -4.561 | -1.437 | -0.439 | -0.075 | 0.066 |
| 8.489999999999927 | -1622.563 | -173.331 | -17.029 | -4.568 | -1.439 | -0.44 | -0.075 | 0.066 |
| 8.494999999999928 | -1624.656 | -173.559 | -17.053 | -4.575 | -1.442 | -0.441 | -0.076 | 0.065 |
| 8.499999999999927 | -1626.75 | -173.787 | -17.076 | -4.582 | -1.445 | -0.442 | -0.076 | 0.065 |
| 8.50499999999993 | -1628.846 | -174.015 | -17.1 | -4.589 | -1.447 | -0.443 | -0.077 | 0.065 |
| 8.50999999999993 | -1630.943 | -174.244 | -17.124 | -4.596 | -1.45 | -0.444 | -0.077 | 0.065 |
| 8.51499999999993 | -1633.041 | -174.473 | -17.148 | -4.603 | -1.452 | -0.445 | -0.078 | 0.065 |
| 8.51999999999993 | -1635.141 | -174.702 | -17.172 | -4.61 | -1.455 | -0.446 | -0.078 | 0.064 |
| 8.524999999999933 | -1637.242 | -174.931 | -17.196 | -4.617 | -1.458 | -0.447 | -0.079 | 0.064 |
| 8.529999999999934 | -1639.344 | -175.16 | -17.22 | -4.624 | -1.46 | -0.448 | -0.079 | 0.064 |
| 8.534999999999934 | -1641.448 | -175.389 | -17.244 | -4.631 | -1.463 | -0.45 | -0.079 | 0.064 |
| 8.539999999999935 | -1643.553 | -175.619 | -17.268 | -4.638 | -1.465 | -0.451 | -0.08 | 0.064 |
| 8.544999999999934 | -1645.66 | -175.848 | -17.292 | -4.645 | -1.468 | -0.452 | -0.08 | 0.063 |
| 8.549999999999937 | -1647.767 | -176.078 | -17.316 | -4.652 | -1.471 | -0.453 | -0.081 | 0.063 |
| 8.554999999999938 | -1649.877 | -176.308 | -17.34 | -4.659 | -1.473 | -0.454 | -0.081 | 0.063 |
| 8.559999999999938 | -1651.987 | -176.538 | -17.364 | -4.667 | -1.476 | -0.455 | -0.082 | 0.063 |
| 8.56499999999994 | -1654.099 | -176.768 | -17.388 | -4.674 | -1.478 | -0.456 | -0.082 | 0.063 |
| 8.56999999999994 | -1656.212 | -176.998 | -17.413 | -4.681 | -1.481 | -0.457 | -0.083 | 0.062 |
| 8.57499999999994 | -1658.327 | -177.229 | -17.437 | -4.688 | -1.484 | -0.458 | -0.083 | 0.062 |
| 8.57999999999994 | -1660.443 | -177.46 | -17.461 | -4.695 | -1.486 | -0.459 | -0.084 | 0.062 |
| 8.58499999999994 | -1662.56 | -177.69 | -17.485 | -4.702 | -1.489 | -0.46 | -0.084 | 0.062 |
| 8.58999999999994 | -1664.679 | -177.921 | -17.509 | -4.709 | -1.492 | -0.462 | -0.085 | 0.062 |
| 8.594999999999944 | -1666.799 | -178.152 | -17.533 | -4.716 | -1.494 | -0.463 | -0.085 | 0.061 |
| 8.599999999999945 | -1668.92 | -178.384 | -17.558 | -4.723 | -1.497 | -0.464 | -0.086 | 0.061 |
| 8.604999999999945 | -1671.043 | -178.615 | -17.582 | -4.73 | -1.499 | -0.465 | -0.086 | 0.061 |
| 8.609999999999946 | -1673.167 | -178.847 | -17.606 | -4.738 | -1.502 | -0.466 | -0.087 | 0.061 |
| 8.614999999999945 | -1675.292 | -179.078 | -17.63 | -4.745 | -1.505 | -0.467 | -0.087 | 0.06 |
| 8.619999999999948 | -1677.419 | -179.31 | -17.655 | -4.752 | -1.507 | -0.468 | -0.088 | 0.06 |
| 8.624999999999948 | -1679.547 | -179.542 | -17.679 | -4.759 | -1.51 | -0.469 | -0.088 | 0.06 |
| 8.62999999999995 | -1681.676 | -179.774 | -17.703 | -4.766 | -1.513 | -0.47 | -0.089 | 0.06 |
| 8.63499999999995 | -1683.807 | -180.007 | -17.728 | -4.773 | -1.515 | -0.471 | -0.089 | 0.06 |
| 8.63999999999995 | -1685.939 | -180.239 | -17.752 | -4.78 | -1.518 | -0.473 | -0.09 | 0.059 |
| 8.644999999999952 | -1688.073 | -180.472 | -17.776 | -4.788 | -1.521 | -0.474 | -0.09 | 0.059 |
| 8.649999999999952 | -1690.207 | -180.705 | -17.801 | -4.795 | -1.523 | -0.475 | -0.091 | 0.059 |
| 8.654999999999953 | -1692.344 | -180.937 | -17.825 | -4.802 | -1.526 | -0.476 | -0.091 | 0.059 |
| 8.659999999999952 | -1694.481 | -181.171 | -17.849 | -4.809 | -1.528 | -0.477 | -0.092 | 0.059 |
| 8.664999999999955 | -1696.62 | -181.404 | -17.874 | -4.816 | -1.531 | -0.478 | -0.092 | 0.058 |
| 8.669999999999956 | -1698.76 | -181.637 | -17.898 | -4.823 | -1.534 | -0.479 | -0.093 | 0.058 |
| 8.674999999999956 | -1700.902 | -181.871 | -17.923 | -4.831 | -1.536 | -0.48 | -0.093 | 0.058 |
| 8.679999999999955 | -1703.045 | -182.104 | -17.947 | -4.838 | -1.539 | -0.481 | -0.094 | 0.058 |
| 8.684999999999958 | -1705.189 | -182.338 | -17.972 | -4.845 | -1.542 | -0.483 | -0.094 | 0.057 |
| 8.689999999999959 | -1707.335 | -182.572 | -17.996 | -4.852 | -1.544 | -0.484 | -0.095 | 0.057 |
| 8.69499999999996 | -1709.482 | -182.806 | -18.021 | -4.859 | -1.547 | -0.485 | -0.095 | 0.057 |
| 8.69999999999996 | -1711.63 | -183.04 | -18.045 | -4.867 | -1.55 | -0.486 | -0.096 | 0.057 |
| 8.70499999999996 | -1713.78 | -183.275 | -18.07 | -4.874 | -1.552 | -0.487 | -0.096 | 0.057 |
| 8.70999999999996 | -1715.931 | -183.509 | -18.095 | -4.881 | -1.555 | -0.488 | -0.096 | 0.056 |
| 8.714999999999963 | -1718.083 | -183.744 | -18.119 | -4.888 | -1.558 | -0.489 | -0.097 | 0.056 |
| 8.719999999999963 | -1720.237 | -183.979 | -18.144 | -4.896 | -1.56 | -0.49 | -0.097 | 0.056 |
| 8.724999999999964 | -1722.392 | -184.214 | -18.168 | -4.903 | -1.563 | -0.492 | -0.098 | 0.056 |
| 8.729999999999963 | -1724.548 | -184.449 | -18.193 | -4.91 | -1.566 | -0.493 | -0.098 | 0.056 |
| 8.734999999999966 | -1726.706 | -184.684 | -18.218 | -4.917 | -1.568 | -0.494 | -0.099 | 0.055 |
| 8.739999999999966 | -1728.865 | -184.92 | -18.242 | -4.925 | -1.571 | -0.495 | -0.099 | 0.055 |
| 8.744999999999967 | -1731.026 | -185.155 | -18.267 | -4.932 | -1.574 | -0.496 | -0.1 | 0.055 |
| 8.749999999999966 | -1733.187 | -185.391 | -18.292 | -4.939 | -1.577 | -0.497 | -0.1 | 0.055 |
| 8.754999999999969 | -1735.351 | -185.627 | -18.316 | -4.946 | -1.579 | -0.498 | -0.101 | 0.054 |
| 8.75999999999997 | -1737.515 | -185.863 | -18.341 | -4.954 | -1.582 | -0.499 | -0.101 | 0.054 |
| 8.76499999999997 | -1739.681 | -186.099 | -18.366 | -4.961 | -1.585 | -0.501 | -0.102 | 0.054 |
| 8.76999999999997 | -1741.848 | -186.336 | -18.391 | -4.968 | -1.587 | -0.502 | -0.102 | 0.054 |
| 8.77499999999997 | -1744.017 | -186.572 | -18.416 | -4.976 | -1.59 | -0.503 | -0.103 | 0.054 |
| 8.779999999999973 | -1746.187 | -186.809 | -18.44 | -4.983 | -1.593 | -0.504 | -0.104 | 0.053 |
| 8.784999999999973 | -1748.358 | -187.046 | -18.465 | -4.99 | -1.595 | -0.505 | -0.104 | 0.053 |
| 8.789999999999974 | -1750.531 | -187.283 | -18.49 | -4.998 | -1.598 | -0.506 | -0.105 | 0.053 |
| 8.794999999999975 | -1752.705 | -187.52 | -18.515 | -5.005 | -1.601 | -0.507 | -0.105 | 0.053 |
| 8.799999999999976 | -1754.88 | -187.757 | -18.54 | -5.012 | -1.604 | -0.508 | -0.106 | 0.052 |
| 8.804999999999977 | -1757.057 | -187.994 | -18.565 | -5.02 | -1.606 | -0.51 | -0.106 | 0.052 |
| 8.809999999999977 | -1759.235 | -188.232 | -18.59 | -5.027 | -1.609 | -0.511 | -0.107 | 0.052 |
| 8.814999999999978 | -1761.414 | -188.47 | -18.615 | -5.034 | -1.612 | -0.512 | -0.107 | 0.052 |
| 8.819999999999977 | -1763.595 | -188.708 | -18.639 | -5.042 | -1.614 | -0.513 | -0.108 | 0.052 |
| 8.82499999999998 | -1765.777 | -188.946 | -18.664 | -5.049 | -1.617 | -0.514 | -0.108 | 0.051 |
| 8.82999999999998 | -1767.96 | -189.184 | -18.689 | -5.056 | -1.62 | -0.515 | -0.109 | 0.051 |
| 8.83499999999998 | -1770.145 | -189.422 | -18.714 | -5.064 | -1.623 | -0.516 | -0.109 | 0.051 |
| 8.83999999999998 | -1772.331 | -189.661 | -18.739 | -5.071 | -1.625 | -0.518 | -0.11 | 0.051 |
| 8.844999999999983 | -1774.519 | -189.899 | -18.764 | -5.078 | -1.628 | -0.519 | -0.11 | 0.05 |
| 8.849999999999984 | -1776.707 | -190.138 | -18.79 | -5.086 | -1.631 | -0.52 | -0.111 | 0.05 |
| 8.854999999999984 | -1778.898 | -190.377 | -18.815 | -5.093 | -1.634 | -0.521 | -0.111 | 0.05 |
| 8.859999999999985 | -1781.089 | -190.616 | -18.84 | -5.101 | -1.636 | -0.522 | -0.112 | 0.05 |
| 8.864999999999984 | -1783.282 | -190.855 | -18.865 | -5.108 | -1.639 | -0.523 | -0.112 | 0.049 |
| 8.869999999999987 | -1785.476 | -191.094 | -18.89 | -5.115 | -1.642 | -0.525 | -0.113 | 0.049 |
| 8.874999999999988 | -1787.672 | -191.334 | -18.915 | -5.123 | -1.645 | -0.526 | -0.113 | 0.049 |
| 8.879999999999988 | -1789.869 | -191.574 | -18.94 | -5.13 | -1.647 | -0.527 | -0.114 | 0.049 |
| 8.88499999999999 | -1792.067 | -191.813 | -18.965 | -5.138 | -1.65 | -0.528 | -0.114 | 0.049 |
| 8.88999999999999 | -1794.267 | -192.053 | -18.991 | -5.145 | -1.653 | -0.529 | -0.115 | 0.048 |
| 8.89499999999999 | -1796.468 | -192.293 | -19.016 | -5.152 | -1.656 | -0.53 | -0.115 | 0.048 |
| 8.89999999999999 | -1798.67 | -192.534 | -19.041 | -5.16 | -1.658 | -0.531 | -0.116 | 0.048 |
| 8.90499999999999 | -1800.874 | -192.774 | -19.066 | -5.167 | -1.661 | -0.533 | -0.116 | 0.048 |
| 8.90999999999999 | -1803.079 | -193.015 | -19.091 | -5.175 | -1.664 | -0.534 | -0.117 | 0.047 |
| 8.914999999999994 | -1805.285 | -193.255 | -19.117 | -5.182 | -1.667 | -0.535 | -0.117 | 0.047 |
| 8.919999999999995 | -1807.493 | -193.496 | -19.142 | -5.19 | -1.669 | -0.536 | -0.118 | 0.047 |
| 8.924999999999995 | -1809.702 | -193.737 | -19.167 | -5.197 | -1.672 | -0.537 | -0.118 | 0.047 |
| 8.929999999999996 | -1811.912 | -193.978 | -19.193 | -5.205 | -1.675 | -0.538 | -0.119 | 0.046 |
| 8.934999999999995 | -1814.124 | -194.22 | -19.218 | -5.212 | -1.678 | -0.54 | -0.119 | 0.046 |
| 8.939999999999998 | -1816.337 | -194.461 | -19.243 | -5.219 | -1.68 | -0.541 | -0.12 | 0.046 |
| 8.944999999999999 | -1818.552 | -194.703 | -19.269 | -5.227 | -1.683 | -0.542 | -0.12 | 0.046 |
| 8.95 | -1820.768 | -194.945 | -19.294 | -5.234 | -1.686 | -0.543 | -0.121 | 0.046 |
| 8.955 | -1822.985 | -195.186 | -19.319 | -5.242 | -1.689 | -0.544 | -0.121 | 0.045 |
| 8.96 | -1825.203 | -195.429 | -19.345 | -5.249 | -1.692 | -0.545 | -0.122 | 0.045 |
| 8.965 | -1827.423 | -195.671 | -19.37 | -5.257 | -1.694 | -0.547 | -0.123 | 0.045 |
| 8.970000000000002 | -1829.644 | -195.913 | -19.396 | -5.264 | -1.697 | -0.548 | -0.123 | 0.045 |
| 8.975000000000003 | -1831.867 | -196.156 | -19.421 | -5.272 | -1.7 | -0.549 | -0.124 | 0.044 |
| 8.980000000000002 | -1834.091 | -196.398 | -19.447 | -5.279 | -1.703 | -0.55 | -0.124 | 0.044 |
| 8.985000000000005 | -1836.316 | -196.641 | -19.472 | -5.287 | -1.705 | -0.551 | -0.125 | 0.044 |
| 8.990000000000006 | -1838.543 | -196.884 | -19.498 | -5.295 | -1.708 | -0.553 | -0.125 | 0.044 |
| 8.995000000000006 | -1840.771 | -197.127 | -19.523 | -5.302 | -1.711 | -0.554 | -0.126 | 0.043 |
| 9.000000000000007 | -1843 | -197.37 | -19.549 | -5.31 | -1.714 | -0.555 | -0.126 | 0.043 |
| 9.005000000000008 | -1845.231 | -197.614 | -19.574 | -5.317 | -1.717 | -0.556 | -0.127 | 0.043 |
| 9.010000000000009 | -1847.463 | -197.857 | -19.6 | -5.325 | -1.719 | -0.557 | -0.127 | 0.043 |
| 9.01500000000001 | -1849.696 | -198.101 | -19.625 | -5.332 | -1.722 | -0.558 | -0.128 | 0.042 |
| 9.02000000000001 | -1851.931 | -198.345 | -19.651 | -5.34 | -1.725 | -0.56 | -0.128 | 0.042 |
| 9.02500000000001 | -1854.167 | -198.589 | -19.677 | -5.347 | -1.728 | -0.561 | -0.129 | 0.042 |
| 9.030000000000012 | -1856.404 | -198.833 | -19.702 | -5.355 | -1.731 | -0.562 | -0.129 | 0.042 |
| 9.035000000000013 | -1858.643 | -199.077 | -19.728 | -5.362 | -1.734 | -0.563 | -0.13 | 0.042 |
| 9.040000000000013 | -1860.883 | -199.322 | -19.754 | -5.37 | -1.736 | -0.564 | -0.13 | 0.041 |
| 9.045000000000014 | -1863.125 | -199.566 | -19.779 | -5.378 | -1.739 | -0.566 | -0.131 | 0.041 |
| 9.050000000000013 | -1865.368 | -199.811 | -19.805 | -5.385 | -1.742 | -0.567 | -0.132 | 0.041 |
| 9.055000000000016 | -1867.612 | -200.056 | -19.831 | -5.393 | -1.745 | -0.568 | -0.132 | 0.041 |
| 9.060000000000016 | -1869.857 | -200.301 | -19.857 | -5.4 | -1.748 | -0.569 | -0.133 | 0.04 |
| 9.065000000000017 | -1872.104 | -200.546 | -19.882 | -5.408 | -1.75 | -0.57 | -0.133 | 0.04 |
| 9.070000000000018 | -1874.352 | -200.792 | -19.908 | -5.416 | -1.753 | -0.571 | -0.134 | 0.04 |
| 9.075000000000019 | -1876.602 | -201.037 | -19.934 | -5.423 | -1.756 | -0.573 | -0.134 | 0.04 |
| 9.08000000000002 | -1878.853 | -201.283 | -19.96 | -5.431 | -1.759 | -0.574 | -0.135 | 0.039 |
| 9.08500000000002 | -1881.105 | -201.529 | -19.986 | -5.438 | -1.762 | -0.575 | -0.135 | 0.039 |
| 9.090000000000021 | -1883.359 | -201.775 | -20.011 | -5.446 | -1.765 | -0.576 | -0.136 | 0.039 |
| 9.09500000000002 | -1885.614 | -202.021 | -20.037 | -5.454 | -1.767 | -0.577 | -0.136 | 0.039 |
| 9.100000000000023 | -1887.87 | -202.267 | -20.063 | -5.461 | -1.77 | -0.579 | -0.137 | 0.038 |
| 9.105000000000024 | -1890.128 | -202.513 | -20.089 | -5.469 | -1.773 | -0.58 | -0.137 | 0.038 |
| 9.110000000000024 | -1892.387 | -202.76 | -20.115 | -5.477 | -1.776 | -0.581 | -0.138 | 0.038 |
| 9.115000000000025 | -1894.647 | -203.007 | -20.141 | -5.484 | -1.779 | -0.582 | -0.139 | 0.038 |
| 9.120000000000026 | -1896.909 | -203.254 | -20.167 | -5.492 | -1.782 | -0.584 | -0.139 | 0.037 |
| 9.125000000000027 | -1899.172 | -203.501 | -20.193 | -5.5 | -1.785 | -0.585 | -0.14 | 0.037 |
| 9.130000000000027 | -1901.436 | -203.748 | -20.219 | -5.507 | -1.787 | -0.586 | -0.14 | 0.037 |
| 9.135000000000028 | -1903.702 | -203.995 | -20.245 | -5.515 | -1.79 | -0.587 | -0.141 | 0.037 |
| 9.140000000000029 | -1905.969 | -204.243 | -20.271 | -5.523 | -1.793 | -0.588 | -0.141 | 0.036 |
| 9.14500000000003 | -1908.238 | -204.49 | -20.297 | -5.53 | -1.796 | -0.59 | -0.142 | 0.036 |
| 9.15000000000003 | -1910.508 | -204.738 | -20.323 | -5.538 | -1.799 | -0.591 | -0.142 | 0.036 |
| 9.15500000000003 | -1912.779 | -204.986 | -20.349 | -5.546 | -1.802 | -0.592 | -0.143 | 0.036 |
| 9.160000000000032 | -1915.051 | -205.234 | -20.375 | -5.554 | -1.805 | -0.593 | -0.143 | 0.035 |
| 9.165000000000031 | -1917.325 | -205.482 | -20.401 | -5.561 | -1.807 | -0.594 | -0.144 | 0.035 |
| 9.170000000000034 | -1919.6 | -205.73 | -20.427 | -5.569 | -1.81 | -0.596 | -0.145 | 0.035 |
| 9.175000000000034 | -1921.877 | -205.979 | -20.453 | -5.577 | -1.813 | -0.597 | -0.145 | 0.035 |
| 9.180000000000035 | -1924.155 | -206.228 | -20.479 | -5.584 | -1.816 | -0.598 | -0.146 | 0.034 |
| 9.185000000000036 | -1926.434 | -206.476 | -20.506 | -5.592 | -1.819 | -0.599 | -0.146 | 0.034 |
| 9.190000000000037 | -1928.715 | -206.725 | -20.532 | -5.6 | -1.822 | -0.6 | -0.147 | 0.034 |
| 9.195000000000038 | -1930.997 | -206.974 | -20.558 | -5.608 | -1.825 | -0.602 | -0.147 | 0.034 |
| 9.200000000000038 | -1933.28 | -207.224 | -20.584 | -5.615 | -1.828 | -0.603 | -0.148 | 0.033 |
| 9.20500000000004 | -1935.565 | -207.473 | -20.61 | -5.623 | -1.83 | -0.604 | -0.148 | 0.033 |
| 9.21000000000004 | -1937.851 | -207.723 | -20.637 | -5.631 | -1.833 | -0.605 | -0.149 | 0.033 |
| 9.21500000000004 | -1940.138 | -207.972 | -20.663 | -5.639 | -1.836 | -0.607 | -0.149 | 0.033 |
| 9.220000000000041 | -1942.427 | -208.222 | -20.689 | -5.646 | -1.839 | -0.608 | -0.15 | 0.032 |
| 9.225000000000042 | -1944.717 | -208.472 | -20.716 | -5.654 | -1.842 | -0.609 | -0.151 | 0.032 |
| 9.230000000000043 | -1947.008 | -208.722 | -20.742 | -5.662 | -1.845 | -0.61 | -0.151 | 0.032 |
| 9.235000000000044 | -1949.301 | -208.973 | -20.768 | -5.67 | -1.848 | -0.612 | -0.152 | 0.032 |
| 9.240000000000045 | -1951.595 | -209.223 | -20.795 | -5.678 | -1.851 | -0.613 | -0.152 | 0.031 |
| 9.245000000000045 | -1953.891 | -209.474 | -20.821 | -5.685 | -1.854 | -0.614 | -0.153 | 0.031 |
| 9.250000000000046 | -1956.188 | -209.725 | -20.847 | -5.693 | -1.857 | -0.615 | -0.153 | 0.031 |
| 9.255000000000045 | -1958.486 | -209.975 | -20.874 | -5.701 | -1.859 | -0.616 | -0.154 | 0.031 |
| 9.260000000000048 | -1960.785 | -210.227 | -20.9 | -5.709 | -1.862 | -0.618 | -0.154 | 0.03 |
| 9.265000000000049 | -1963.086 | -210.478 | -20.927 | -5.717 | -1.865 | -0.619 | -0.155 | 0.03 |
| 9.27000000000005 | -1965.388 | -210.729 | -20.953 | -5.724 | -1.868 | -0.62 | -0.156 | 0.03 |
| 9.27500000000005 | -1967.692 | -210.981 | -20.979 | -5.732 | -1.871 | -0.621 | -0.156 | 0.03 |
| 9.28000000000005 | -1969.997 | -211.232 | -21.006 | -5.74 | -1.874 | -0.623 | -0.157 | 0.029 |
| 9.285000000000052 | -1972.303 | -211.484 | -21.032 | -5.748 | -1.877 | -0.624 | -0.157 | 0.029 |
| 9.290000000000052 | -1974.611 | -211.736 | -21.059 | -5.756 | -1.88 | -0.625 | -0.158 | 0.029 |
| 9.295000000000053 | -1976.92 | -211.988 | -21.085 | -5.764 | -1.883 | -0.626 | -0.158 | 0.029 |
| 9.300000000000052 | -1979.23 | -212.24 | -21.112 | -5.771 | -1.886 | -0.628 | -0.159 | 0.028 |
| 9.305000000000055 | -1981.542 | -212.493 | -21.139 | -5.779 | -1.889 | -0.629 | -0.16 | 0.028 |
| 9.310000000000056 | -1983.855 | -212.745 | -21.165 | -5.787 | -1.892 | -0.63 | -0.16 | 0.028 |
| 9.315000000000056 | -1986.169 | -212.998 | -21.192 | -5.795 | -1.895 | -0.631 | -0.161 | 0.028 |
| 9.320000000000057 | -1988.485 | -213.251 | -21.218 | -5.803 | -1.897 | -0.633 | -0.161 | 0.027 |
| 9.325000000000056 | -1990.802 | -213.504 | -21.245 | -5.811 | -1.9 | -0.634 | -0.162 | 0.027 |
| 9.330000000000059 | -1993.12 | -213.757 | -21.272 | -5.819 | -1.903 | -0.635 | -0.162 | 0.027 |
| 9.33500000000006 | -1995.44 | -214.01 | -21.298 | -5.827 | -1.906 | -0.636 | -0.163 | 0.027 |
| 9.34000000000006 | -1997.761 | -214.264 | -21.325 | -5.834 | -1.909 | -0.638 | -0.163 | 0.026 |
| 9.34500000000006 | -2000.084 | -214.517 | -21.352 | -5.842 | -1.912 | -0.639 | -0.164 | 0.026 |
| 9.35000000000006 | -2002.408 | -214.771 | -21.378 | -5.85 | -1.915 | -0.64 | -0.165 | 0.026 |
| 9.35500000000006 | -2004.733 | -215.025 | -21.405 | -5.858 | -1.918 | -0.641 | -0.165 | 0.026 |
| 9.360000000000063 | -2007.059 | -215.279 | -21.432 | -5.866 | -1.921 | -0.643 | -0.166 | 0.025 |
| 9.365000000000064 | -2009.387 | -215.533 | -21.459 | -5.874 | -1.924 | -0.644 | -0.166 | 0.025 |
| 9.370000000000063 | -2011.716 | -215.788 | -21.485 | -5.882 | -1.927 | -0.645 | -0.167 | 0.025 |
| 9.375000000000066 | -2014.047 | -216.042 | -21.512 | -5.89 | -1.93 | -0.646 | -0.167 | 0.025 |
| 9.380000000000067 | -2016.379 | -216.297 | -21.539 | -5.898 | -1.933 | -0.648 | -0.168 | 0.024 |
| 9.385000000000067 | -2018.712 | -216.552 | -21.566 | -5.906 | -1.936 | -0.649 | -0.169 | 0.024 |
| 9.390000000000068 | -2021.047 | -216.807 | -21.593 | -5.914 | -1.939 | -0.65 | -0.169 | 0.024 |
| 9.395000000000069 | -2023.383 | -217.062 | -21.62 | -5.922 | -1.942 | -0.651 | -0.17 | 0.023 |
| 9.40000000000007 | -2025.72 | -217.317 | -21.646 | -5.93 | -1.945 | -0.653 | -0.17 | 0.023 |
| 9.40500000000007 | -2028.059 | -217.572 | -21.673 | -5.938 | -1.948 | -0.654 | -0.171 | 0.023 |
| 9.410000000000071 | -2030.399 | -217.828 | -21.7 | -5.946 | -1.951 | -0.655 | -0.171 | 0.023 |
| 9.41500000000007 | -2032.74 | -218.084 | -21.727 | -5.953 | -1.954 | -0.656 | -0.172 | 0.022 |
| 9.420000000000073 | -2035.083 | -218.34 | -21.754 | -5.961 | -1.957 | -0.658 | -0.173 | 0.022 |
| 9.425000000000074 | -2037.427 | -218.596 | -21.781 | -5.969 | -1.96 | -0.659 | -0.173 | 0.022 |
| 9.430000000000074 | -2039.772 | -218.852 | -21.808 | -5.977 | -1.963 | -0.66 | -0.174 | 0.022 |
| 9.435000000000075 | -2042.119 | -219.108 | -21.835 | -5.985 | -1.966 | -0.662 | -0.174 | 0.021 |
| 9.440000000000076 | -2044.467 | -219.365 | -21.862 | -5.993 | -1.969 | -0.663 | -0.175 | 0.021 |
| 9.445000000000077 | -2046.817 | -219.621 | -21.889 | -6.001 | -1.972 | -0.664 | -0.176 | 0.021 |
| 9.450000000000077 | -2049.168 | -219.878 | -21.916 | -6.009 | -1.975 | -0.665 | -0.176 | 0.021 |
| 9.455000000000078 | -2051.52 | -220.135 | -21.943 | -6.017 | -1.978 | -0.667 | -0.177 | 0.02 |
| 9.460000000000077 | -2053.873 | -220.392 | -21.97 | -6.025 | -1.981 | -0.668 | -0.177 | 0.02 |
| 9.46500000000008 | -2056.228 | -220.649 | -21.997 | -6.034 | -1.984 | -0.669 | -0.178 | 0.02 |
| 9.47000000000008 | -2058.584 | -220.906 | -22.025 | -6.042 | -1.987 | -0.67 | -0.178 | 0.019 |
| 9.47500000000008 | -2060.942 | -221.164 | -22.052 | -6.05 | -1.99 | -0.672 | -0.179 | 0.019 |
| 9.480000000000082 | -2063.301 | -221.422 | -22.079 | -6.058 | -1.993 | -0.673 | -0.18 | 0.019 |
| 9.485000000000081 | -2065.661 | -221.679 | -22.106 | -6.066 | -1.996 | -0.674 | -0.18 | 0.019 |
| 9.490000000000084 | -2068.023 | -221.937 | -22.133 | -6.074 | -1.999 | -0.676 | -0.181 | 0.018 |
| 9.495000000000084 | -2070.386 | -222.195 | -22.16 | -6.082 | -2.002 | -0.677 | -0.181 | 0.018 |
| 9.500000000000085 | -2072.75 | -222.454 | -22.188 | -6.09 | -2.005 | -0.678 | -0.182 | 0.018 |
| 9.505000000000086 | -2075.116 | -222.712 | -22.215 | -6.098 | -2.008 | -0.679 | -0.183 | 0.018 |
| 9.510000000000087 | -2077.483 | -222.971 | -22.242 | -6.106 | -2.011 | -0.681 | -0.183 | 0.017 |
| 9.515000000000088 | -2079.851 | -223.229 | -22.269 | -6.114 | -2.014 | -0.682 | -0.184 | 0.017 |
| 9.520000000000088 | -2082.221 | -223.488 | -22.297 | -6.122 | -2.017 | -0.683 | -0.184 | 0.017 |
| 9.52500000000009 | -2084.592 | -223.747 | -22.324 | -6.13 | -2.02 | -0.685 | -0.185 | 0.017 |
| 9.53000000000009 | -2086.964 | -224.006 | -22.351 | -6.138 | -2.023 | -0.686 | -0.185 | 0.016 |
| 9.53500000000009 | -2089.338 | -224.266 | -22.379 | -6.146 | -2.026 | -0.687 | -0.186 | 0.016 |
| 9.540000000000092 | -2091.713 | -224.525 | -22.406 | -6.155 | -2.029 | -0.688 | -0.187 | 0.016 |
| 9.545000000000092 | -2094.09 | -224.785 | -22.433 | -6.163 | -2.032 | -0.69 | -0.187 | 0.015 |
| 9.550000000000093 | -2096.468 | -225.045 | -22.461 | -6.171 | -2.035 | -0.691 | -0.188 | 0.015 |
| 9.555000000000094 | -2098.847 | -225.304 | -22.488 | -6.179 | -2.038 | -0.692 | -0.188 | 0.015 |
| 9.560000000000095 | -2101.227 | -225.565 | -22.515 | -6.187 | -2.041 | -0.694 | -0.189 | 0.015 |
| 9.565000000000095 | -2103.609 | -225.825 | -22.543 | -6.195 | -2.044 | -0.695 | -0.19 | 0.014 |
| 9.570000000000096 | -2105.992 | -226.085 | -22.57 | -6.203 | -2.047 | -0.696 | -0.19 | 0.014 |
| 9.575000000000095 | -2108.377 | -226.346 | -22.598 | -6.211 | -2.05 | -0.698 | -0.191 | 0.014 |
| 9.580000000000098 | -2110.763 | -226.606 | -22.625 | -6.22 | -2.053 | -0.699 | -0.191 | 0.014 |
| 9.585000000000099 | -2113.15 | -226.867 | -22.653 | -6.228 | -2.056 | -0.7 | -0.192 | 0.013 |
| 9.5900000000001 | -2115.539 | -227.128 | -22.68 | -6.236 | -2.059 | -0.701 | -0.193 | 0.013 |
| 9.5950000000001 | -2117.929 | -227.389 | -22.708 | -6.244 | -2.062 | -0.703 | -0.193 | 0.013 |
| 9.600000000000101 | -2120.32 | -227.65 | -22.735 | -6.252 | -2.065 | -0.704 | -0.194 | 0.012 |
| 9.605000000000102 | -2122.713 | -227.912 | -22.763 | -6.26 | -2.068 | -0.705 | -0.194 | 0.012 |
| 9.610000000000102 | -2125.107 | -228.173 | -22.791 | -6.269 | -2.072 | -0.707 | -0.195 | 0.012 |
| 9.615000000000103 | -2127.502 | -228.435 | -22.818 | -6.277 | -2.075 | -0.708 | -0.196 | 0.012 |
| 9.620000000000104 | -2129.899 | -228.697 | -22.846 | -6.285 | -2.078 | -0.709 | -0.196 | 0.011 |
| 9.625000000000105 | -2132.297 | -228.959 | -22.873 | -6.293 | -2.081 | -0.711 | -0.197 | 0.011 |
| 9.630000000000106 | -2134.696 | -229.221 | -22.901 | -6.301 | -2.084 | -0.712 | -0.197 | 0.011 |
| 9.635000000000106 | -2137.097 | -229.483 | -22.929 | -6.31 | -2.087 | -0.713 | -0.198 | 0.01 |
| 9.640000000000107 | -2139.499 | -229.746 | -22.956 | -6.318 | -2.09 | -0.715 | -0.199 | 0.01 |
| 9.645000000000108 | -2141.903 | -230.008 | -22.984 | -6.326 | -2.093 | -0.716 | -0.199 | 0.01 |
| 9.650000000000109 | -2144.308 | -230.271 | -23.012 | -6.334 | -2.096 | -0.717 | -0.2 | 0.01 |
| 9.65500000000011 | -2146.714 | -230.534 | -23.039 | -6.342 | -2.099 | -0.718 | -0.2 | 0.009 |
| 9.66000000000011 | -2149.121 | -230.797 | -23.067 | -6.351 | -2.102 | -0.72 | -0.201 | 0.009 |
| 9.66500000000011 | -2151.53 | -231.06 | -23.095 | -6.359 | -2.105 | -0.721 | -0.202 | 0.009 |
| 9.670000000000112 | -2153.94 | -231.324 | -23.123 | -6.367 | -2.108 | -0.722 | -0.202 | 0.009 |
| 9.675000000000113 | -2156.352 | -231.587 | -23.151 | -6.375 | -2.112 | -0.724 | -0.203 | 0.008 |
| 9.680000000000113 | -2158.765 | -231.851 | -23.178 | -6.384 | -2.115 | -0.725 | -0.203 | 0.008 |
| 9.685000000000114 | -2161.179 | -232.115 | -23.206 | -6.392 | -2.118 | -0.726 | -0.204 | 0.008 |
| 9.690000000000115 | -2163.595 | -232.379 | -23.234 | -6.4 | -2.121 | -0.728 | -0.205 | 0.007 |
| 9.695000000000116 | -2166.012 | -232.643 | -23.262 | -6.408 | -2.124 | -0.729 | -0.205 | 0.007 |
| 9.700000000000117 | -2168.43 | -232.907 | -23.29 | -6.417 | -2.127 | -0.73 | -0.206 | 0.007 |
| 9.705000000000117 | -2170.85 | -233.171 | -23.318 | -6.425 | -2.13 | -0.732 | -0.206 | 0.007 |
| 9.710000000000118 | -2173.271 | -233.436 | -23.346 | -6.433 | -2.133 | -0.733 | -0.207 | 0.006 |
| 9.715000000000119 | -2175.693 | -233.701 | -23.374 | -6.442 | -2.136 | -0.734 | -0.208 | 0.006 |
| 9.72000000000012 | -2178.117 | -233.966 | -23.401 | -6.45 | -2.139 | -0.736 | -0.208 | 0.006 |
| 9.72500000000012 | -2180.542 | -234.231 | -23.429 | -6.458 | -2.143 | -0.737 | -0.209 | 0.005 |
| 9.730000000000121 | -2182.968 | -234.496 | -23.457 | -6.466 | -2.146 | -0.738 | -0.209 | 0.005 |
| 9.735000000000122 | -2185.396 | -234.761 | -23.485 | -6.475 | -2.149 | -0.74 | -0.21 | 0.005 |
| 9.740000000000123 | -2187.825 | -235.027 | -23.513 | -6.483 | -2.152 | -0.741 | -0.211 | 0.005 |
| 9.745000000000124 | -2190.256 | -235.292 | -23.541 | -6.491 | -2.155 | -0.742 | -0.211 | 0.004 |
| 9.750000000000124 | -2192.688 | -235.558 | -23.57 | -6.5 | -2.158 | -0.744 | -0.212 | 0.004 |
| 9.755000000000125 | -2195.121 | -235.824 | -23.598 | -6.508 | -2.161 | -0.745 | -0.213 | 0.004 |
| 9.760000000000126 | -2197.555 | -236.09 | -23.626 | -6.516 | -2.164 | -0.746 | -0.213 | 0.003 |
| 9.765000000000127 | -2199.991 | -236.356 | -23.654 | -6.525 | -2.168 | -0.748 | -0.214 | 0.003 |
| 9.770000000000127 | -2202.428 | -236.622 | -23.682 | -6.533 | -2.171 | -0.749 | -0.214 | 0.003 |
| 9.775000000000128 | -2204.867 | -236.889 | -23.71 | -6.541 | -2.174 | -0.75 | -0.215 | 0.003 |
| 9.780000000000129 | -2207.307 | -237.156 | -23.738 | -6.55 | -2.177 | -0.752 | -0.216 | 0.002 |
| 9.78500000000013 | -2209.748 | -237.422 | -23.766 | -6.558 | -2.18 | -0.753 | -0.216 | 0.002 |
| 9.79000000000013 | -2212.191 | -237.689 | -23.795 | -6.567 | -2.183 | -0.754 | -0.217 | 0.002 |
| 9.795000000000131 | -2214.635 | -237.956 | -23.823 | -6.575 | -2.186 | -0.756 | -0.217 | 0.001 |
| 9.800000000000132 | -2217.08 | -238.224 | -23.851 | -6.583 | -2.19 | -0.757 | -0.218 | 0.001 |
| 9.805000000000131 | -2219.527 | -238.491 | -23.879 | -6.592 | -2.193 | -0.758 | -0.219 | 0.001 |
| 9.810000000000134 | -2221.975 | -238.759 | -23.907 | -6.6 | -2.196 | -0.76 | -0.219 | 0.001 |
| 9.815000000000135 | -2224.424 | -239.026 | -23.936 | -6.608 | -2.199 | -0.761 | -0.22 | 0 |
| 9.820000000000135 | -2226.875 | -239.294 | -23.964 | -6.617 | -2.202 | -0.762 | -0.221 | 0 |
| 9.825000000000136 | -2229.327 | -239.562 | -23.992 | -6.625 | -2.205 | -0.764 | -0.221 | 0 |
| 9.830000000000137 | -2231.78 | -239.83 | -24.021 | -6.634 | -2.208 | -0.765 | -0.222 | -0.001 |
| 9.835000000000138 | -2234.235 | -240.099 | -24.049 | -6.642 | -2.212 | -0.767 | -0.222 | -0.001 |
| 9.840000000000138 | -2236.691 | -240.367 | -24.077 | -6.651 | -2.215 | -0.768 | -0.223 | -0.001 |
| 9.84500000000014 | -2239.149 | -240.636 | -24.106 | -6.659 | -2.218 | -0.769 | -0.224 | -0.002 |
| 9.85000000000014 | -2241.608 | -240.905 | -24.134 | -6.667 | -2.221 | -0.771 | -0.224 | -0.002 |
| 9.85500000000014 | -2244.068 | -241.173 | -24.162 | -6.676 | -2.224 | -0.772 | -0.225 | -0.002 |
| 9.86000000000014 | -2246.529 | -241.443 | -24.191 | -6.684 | -2.227 | -0.773 | -0.226 | -0.002 |
| 9.86500000000014 | -2248.992 | -241.712 | -24.219 | -6.693 | -2.231 | -0.775 | -0.226 | -0.003 |
| 9.870000000000143 | -2251.456 | -241.981 | -24.248 | -6.701 | -2.234 | -0.776 | -0.227 | -0.003 |
| 9.875000000000144 | -2253.922 | -242.251 | -24.276 | -6.71 | -2.237 | -0.777 | -0.227 | -0.003 |
| 9.880000000000145 | -2256.389 | -242.52 | -24.305 | -6.718 | -2.24 | -0.779 | -0.228 | -0.004 |
| 9.885000000000145 | -2258.857 | -242.79 | -24.333 | -6.727 | -2.243 | -0.78 | -0.229 | -0.004 |
| 9.890000000000146 | -2261.327 | -243.06 | -24.362 | -6.735 | -2.246 | -0.782 | -0.229 | -0.004 |
| 9.895000000000145 | -2263.798 | -243.33 | -24.39 | -6.744 | -2.25 | -0.783 | -0.23 | -0.004 |
| 9.900000000000148 | -2266.27 | -243.6 | -24.419 | -6.752 | -2.253 | -0.784 | -0.231 | -0.005 |
| 9.905000000000149 | -2268.744 | -243.871 | -24.447 | -6.761 | -2.256 | -0.786 | -0.231 | -0.005 |
| 9.91000000000015 | -2271.219 | -244.141 | -24.476 | -6.769 | -2.259 | -0.787 | -0.232 | -0.005 |
| 9.91500000000015 | -2273.695 | -244.412 | -24.504 | -6.778 | -2.262 | -0.788 | -0.232 | -0.006 |
| 9.920000000000151 | -2276.173 | -244.683 | -24.533 | -6.786 | -2.266 | -0.79 | -0.233 | -0.006 |
| 9.925000000000152 | -2278.652 | -244.954 | -24.562 | -6.795 | -2.269 | -0.791 | -0.234 | -0.006 |
| 9.930000000000152 | -2281.132 | -245.225 | -24.59 | -6.803 | -2.272 | -0.792 | -0.234 | -0.007 |
| 9.935000000000153 | -2283.614 | -245.496 | -24.619 | -6.812 | -2.275 | -0.794 | -0.235 | -0.007 |
| 9.940000000000154 | -2286.097 | -245.768 | -24.648 | -6.82 | -2.278 | -0.795 | -0.236 | -0.007 |
| 9.945000000000155 | -2288.582 | -246.039 | -24.676 | -6.829 | -2.282 | -0.797 | -0.236 | -0.007 |
| 9.950000000000156 | -2291.068 | -246.311 | -24.705 | -6.837 | -2.285 | -0.798 | -0.237 | -0.008 |
| 9.955000000000156 | -2293.555 | -246.583 | -24.734 | -6.846 | -2.288 | -0.799 | -0.238 | -0.008 |
| 9.960000000000157 | -2296.043 | -246.855 | -24.763 | -6.854 | -2.291 | -0.801 | -0.238 | -0.008 |
| 9.965000000000156 | -2298.533 | -247.127 | -24.791 | -6.863 | -2.294 | -0.802 | -0.239 | -0.009 |
| 9.970000000000159 | -2301.024 | -247.4 | -24.82 | -6.871 | -2.298 | -0.803 | -0.239 | -0.009 |
| 9.97500000000016 | -2303.517 | -247.672 | -24.849 | -6.88 | -2.301 | -0.805 | -0.24 | -0.009 |
| 9.98000000000016 | -2306.011 | -247.945 | -24.878 | -6.889 | -2.304 | -0.806 | -0.241 | -0.01 |
| 9.98500000000016 | -2308.506 | -248.218 | -24.907 | -6.897 | -2.307 | -0.808 | -0.241 | -0.01 |
| 9.990000000000162 | -2311.003 | -248.491 | -24.935 | -6.906 | -2.311 | -0.809 | -0.242 | -0.01 |
| 9.995000000000163 | -2313.501 | -248.764 | -24.964 | -6.914 | -2.314 | -0.81 | -0.243 | -0.01 |
| 10.00000000000016 | -2316 | -249.037 | -24.993 | -6.923 | -2.317 | -0.812 | -0.243 | -0.011 |